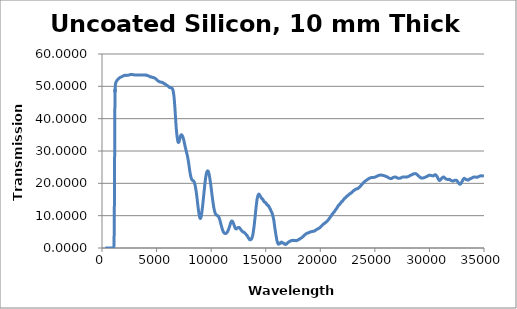
| Category | Transmission % |
|---|---|
| 300.0 | 0.002 |
| 301.0 | 0.002 |
| 302.0 | 0.002 |
| 303.0 | 0.002 |
| 304.0 | 0.002 |
| 305.0 | 0.002 |
| 306.0 | 0.002 |
| 307.0 | 0.002 |
| 308.0 | 0.002 |
| 309.0 | 0.002 |
| 310.0 | 0.002 |
| 311.0 | 0.002 |
| 312.0 | 0.002 |
| 313.0 | 0.002 |
| 314.0 | 0.002 |
| 315.0 | 0.002 |
| 316.0 | 0.002 |
| 317.0 | 0.002 |
| 318.0 | 0.002 |
| 319.0 | 0.002 |
| 320.0 | 0.002 |
| 321.0 | 0.002 |
| 322.0 | 0.002 |
| 323.0 | 0.002 |
| 324.0 | 0.002 |
| 325.0 | 0.002 |
| 326.0 | 0.002 |
| 327.0 | 0.002 |
| 328.0 | 0.002 |
| 329.0 | 0.002 |
| 330.0 | 0.002 |
| 331.0 | 0.002 |
| 332.0 | 0.002 |
| 333.0 | 0.002 |
| 334.0 | 0.002 |
| 335.0 | 0.002 |
| 336.0 | 0.002 |
| 337.0 | 0.002 |
| 338.0 | 0.002 |
| 339.0 | 0.002 |
| 340.0 | 0.002 |
| 341.0 | 0.002 |
| 342.0 | 0.002 |
| 343.0 | 0.002 |
| 344.0 | 0.002 |
| 345.0 | 0.002 |
| 346.0 | 0.002 |
| 347.0 | 0.002 |
| 348.0 | 0.002 |
| 349.0 | 0.002 |
| 350.0 | 0.001 |
| 351.0 | 0.001 |
| 352.0 | 0.001 |
| 353.0 | 0.001 |
| 354.0 | 0.001 |
| 355.0 | 0.001 |
| 356.0 | 0.001 |
| 357.0 | 0.001 |
| 358.0 | 0.001 |
| 359.0 | 0.001 |
| 360.0 | 0.001 |
| 361.0 | 0.001 |
| 362.0 | 0.001 |
| 363.0 | 0.002 |
| 364.0 | 0.002 |
| 365.0 | 0.002 |
| 366.0 | 0.002 |
| 367.0 | 0.002 |
| 368.0 | 0.002 |
| 369.0 | 0.002 |
| 370.0 | 0.002 |
| 371.0 | 0.002 |
| 372.0 | 0.002 |
| 373.0 | 0.001 |
| 374.0 | 0.002 |
| 375.0 | 0.002 |
| 376.0 | 0.002 |
| 377.0 | 0.002 |
| 378.0 | 0.001 |
| 379.0 | 0.001 |
| 380.0 | 0.001 |
| 381.0 | 0.001 |
| 382.0 | 0.001 |
| 383.0 | 0.001 |
| 384.0 | 0.001 |
| 385.0 | 0.001 |
| 386.0 | 0.001 |
| 387.0 | 0.001 |
| 388.0 | 0.001 |
| 389.0 | 0.001 |
| 390.0 | 0.001 |
| 391.0 | 0.001 |
| 392.0 | 0.002 |
| 393.0 | 0.002 |
| 394.0 | 0.001 |
| 395.0 | 0.001 |
| 396.0 | 0.002 |
| 397.0 | 0.002 |
| 398.0 | 0.002 |
| 399.0 | 0.001 |
| 400.0 | 0.001 |
| 401.0 | 0.001 |
| 402.0 | 0.001 |
| 403.0 | 0.001 |
| 404.0 | 0.001 |
| 405.0 | 0.001 |
| 406.0 | 0.001 |
| 407.0 | 0.001 |
| 408.0 | 0.001 |
| 409.0 | 0.001 |
| 410.0 | 0.001 |
| 411.0 | 0.001 |
| 412.0 | 0.001 |
| 413.0 | 0.001 |
| 414.0 | 0.001 |
| 415.0 | 0.001 |
| 416.0 | 0.001 |
| 417.0 | 0.001 |
| 418.0 | 0.001 |
| 419.0 | 0.001 |
| 420.0 | 0.001 |
| 421.0 | 0.001 |
| 422.0 | 0.001 |
| 423.0 | 0.001 |
| 424.0 | 0.001 |
| 425.0 | 0.001 |
| 426.0 | 0.001 |
| 427.0 | 0.001 |
| 428.0 | 0.001 |
| 429.0 | 0.001 |
| 430.0 | 0.001 |
| 431.0 | 0.001 |
| 432.0 | 0.001 |
| 433.0 | 0.001 |
| 434.0 | 0.001 |
| 435.0 | 0.001 |
| 436.0 | 0.001 |
| 437.0 | 0.001 |
| 438.0 | 0.001 |
| 439.0 | 0.001 |
| 440.0 | 0.001 |
| 441.0 | 0.001 |
| 442.0 | 0.001 |
| 443.0 | 0.001 |
| 444.0 | 0.001 |
| 445.0 | 0.001 |
| 446.0 | 0.001 |
| 447.0 | 0.001 |
| 448.0 | 0.001 |
| 449.0 | 0.001 |
| 450.0 | 0.001 |
| 451.0 | 0.001 |
| 452.0 | 0.001 |
| 453.0 | 0.001 |
| 454.0 | 0.001 |
| 455.0 | 0.001 |
| 456.0 | 0.001 |
| 457.0 | 0.001 |
| 458.0 | 0.001 |
| 459.0 | 0.001 |
| 460.0 | 0.001 |
| 461.0 | 0.001 |
| 462.0 | 0.001 |
| 463.0 | 0.001 |
| 464.0 | 0.001 |
| 465.0 | 0.001 |
| 466.0 | 0.001 |
| 467.0 | 0.001 |
| 468.0 | 0.001 |
| 469.0 | 0.001 |
| 470.0 | 0.001 |
| 471.0 | 0.001 |
| 472.0 | 0.001 |
| 473.0 | 0.001 |
| 474.0 | 0.001 |
| 475.0 | 0.001 |
| 476.0 | 0.001 |
| 477.0 | 0.001 |
| 478.0 | 0.001 |
| 479.0 | 0.001 |
| 480.0 | 0.001 |
| 481.0 | 0.001 |
| 482.0 | 0.001 |
| 483.0 | 0.001 |
| 484.0 | 0.001 |
| 485.0 | 0.001 |
| 486.0 | 0.001 |
| 487.0 | 0.001 |
| 488.0 | 0.001 |
| 489.0 | 0.001 |
| 490.0 | 0.001 |
| 491.0 | 0.001 |
| 492.0 | 0.001 |
| 493.0 | 0.001 |
| 494.0 | 0.001 |
| 495.0 | 0.001 |
| 496.0 | 0.001 |
| 497.0 | 0.001 |
| 498.0 | 0.001 |
| 499.0 | 0.001 |
| 500.0 | 0.001 |
| 501.0 | 0.001 |
| 502.0 | 0.001 |
| 503.0 | 0.001 |
| 504.0 | 0.001 |
| 505.0 | 0.001 |
| 506.0 | 0.001 |
| 507.0 | 0.001 |
| 508.0 | 0.001 |
| 509.0 | 0.001 |
| 510.0 | 0.001 |
| 511.0 | 0.001 |
| 512.0 | 0.001 |
| 513.0 | 0.001 |
| 514.0 | 0.001 |
| 515.0 | 0.001 |
| 516.0 | 0.001 |
| 517.0 | 0.001 |
| 518.0 | 0.001 |
| 519.0 | 0.001 |
| 520.0 | 0.001 |
| 521.0 | 0.001 |
| 522.0 | 0.001 |
| 523.0 | 0.001 |
| 524.0 | 0.001 |
| 525.0 | 0.001 |
| 526.0 | 0.001 |
| 527.0 | 0.001 |
| 528.0 | 0.001 |
| 529.0 | 0.001 |
| 530.0 | 0.001 |
| 531.0 | 0.001 |
| 532.0 | 0.001 |
| 533.0 | 0.001 |
| 534.0 | 0.001 |
| 535.0 | 0.001 |
| 536.0 | 0.001 |
| 537.0 | 0.001 |
| 538.0 | 0.001 |
| 539.0 | 0.001 |
| 540.0 | 0.001 |
| 541.0 | 0.001 |
| 542.0 | 0.001 |
| 543.0 | 0.001 |
| 544.0 | 0.001 |
| 545.0 | 0.001 |
| 546.0 | 0.002 |
| 547.0 | 0.001 |
| 548.0 | 0.001 |
| 549.0 | 0.001 |
| 550.0 | 0.001 |
| 551.0 | 0.002 |
| 552.0 | 0.002 |
| 553.0 | 0.002 |
| 554.0 | 0.002 |
| 555.0 | 0.002 |
| 556.0 | 0.002 |
| 557.0 | 0.002 |
| 558.0 | 0.002 |
| 559.0 | 0.001 |
| 560.0 | 0.001 |
| 561.0 | 0.001 |
| 562.0 | 0.001 |
| 563.0 | 0.001 |
| 564.0 | 0.001 |
| 565.0 | 0.001 |
| 566.0 | 0.001 |
| 567.0 | 0.001 |
| 568.0 | 0.001 |
| 569.0 | 0.001 |
| 570.0 | 0.001 |
| 571.0 | 0.001 |
| 572.0 | 0.001 |
| 573.0 | 0.001 |
| 574.0 | 0.001 |
| 575.0 | 0.001 |
| 576.0 | 0.001 |
| 577.0 | 0.001 |
| 578.0 | 0.001 |
| 579.0 | 0.001 |
| 580.0 | 0.001 |
| 581.0 | 0.001 |
| 582.0 | 0.001 |
| 583.0 | 0.001 |
| 584.0 | 0.001 |
| 585.0 | 0.001 |
| 586.0 | 0.001 |
| 587.0 | 0.001 |
| 588.0 | 0.001 |
| 589.0 | 0.001 |
| 590.0 | 0.001 |
| 591.0 | 0.001 |
| 592.0 | 0.001 |
| 593.0 | 0.001 |
| 594.0 | 0.001 |
| 595.0 | 0.001 |
| 596.0 | 0.001 |
| 597.0 | 0.001 |
| 598.0 | 0.001 |
| 599.0 | 0.001 |
| 600.0 | 0.001 |
| 601.0 | 0.002 |
| 602.0 | 0.002 |
| 603.0 | 0.002 |
| 604.0 | 0.002 |
| 605.0 | 0.002 |
| 606.0 | 0.002 |
| 607.0 | 0.002 |
| 608.0 | 0.002 |
| 609.0 | 0.002 |
| 610.0 | 0.002 |
| 611.0 | 0.002 |
| 612.0 | 0.002 |
| 613.0 | 0.002 |
| 614.0 | 0.002 |
| 615.0 | 0.002 |
| 616.0 | 0.002 |
| 617.0 | 0.002 |
| 618.0 | 0.002 |
| 619.0 | 0.002 |
| 620.0 | 0.002 |
| 621.0 | 0.002 |
| 622.0 | 0.002 |
| 623.0 | 0.002 |
| 624.0 | 0.002 |
| 625.0 | 0.002 |
| 626.0 | 0.002 |
| 627.0 | 0.002 |
| 628.0 | 0.002 |
| 629.0 | 0.002 |
| 630.0 | 0.002 |
| 631.0 | 0.002 |
| 632.0 | 0.002 |
| 633.0 | 0.002 |
| 634.0 | 0.002 |
| 635.0 | 0.002 |
| 636.0 | 0.002 |
| 637.0 | 0.002 |
| 638.0 | 0.002 |
| 639.0 | 0.002 |
| 640.0 | 0.002 |
| 641.0 | 0.002 |
| 642.0 | 0.002 |
| 643.0 | 0.002 |
| 644.0 | 0.002 |
| 645.0 | 0.002 |
| 646.0 | 0.002 |
| 647.0 | 0.002 |
| 648.0 | 0.002 |
| 649.0 | 0.002 |
| 650.0 | 0.002 |
| 651.0 | 0.002 |
| 652.0 | 0.002 |
| 653.0 | 0.002 |
| 654.0 | 0.002 |
| 655.0 | 0.002 |
| 656.0 | 0.002 |
| 657.0 | 0.002 |
| 658.0 | 0.002 |
| 659.0 | 0.002 |
| 660.0 | 0.002 |
| 661.0 | 0.002 |
| 662.0 | 0.002 |
| 663.0 | 0.002 |
| 664.0 | 0.002 |
| 665.0 | 0.002 |
| 666.0 | 0.002 |
| 667.0 | 0.002 |
| 668.0 | 0.002 |
| 669.0 | 0.002 |
| 670.0 | 0.002 |
| 671.0 | 0.002 |
| 672.0 | 0.002 |
| 673.0 | 0.002 |
| 674.0 | 0.002 |
| 675.0 | 0.002 |
| 676.0 | 0.002 |
| 677.0 | 0.002 |
| 678.0 | 0.002 |
| 679.0 | 0.002 |
| 680.0 | 0.002 |
| 681.0 | 0.002 |
| 682.0 | 0.002 |
| 683.0 | 0.002 |
| 684.0 | 0.002 |
| 685.0 | 0.002 |
| 686.0 | 0.002 |
| 687.0 | 0.002 |
| 688.0 | 0.002 |
| 689.0 | 0.002 |
| 690.0 | 0.002 |
| 691.0 | 0.002 |
| 692.0 | 0.002 |
| 693.0 | 0.002 |
| 694.0 | 0.002 |
| 695.0 | 0.002 |
| 696.0 | 0.002 |
| 697.0 | 0.002 |
| 698.0 | 0.002 |
| 699.0 | 0.002 |
| 700.0 | 0.002 |
| 701.0 | 0.002 |
| 702.0 | 0.002 |
| 703.0 | 0.002 |
| 704.0 | 0.002 |
| 705.0 | 0.002 |
| 706.0 | 0.002 |
| 707.0 | 0.002 |
| 708.0 | 0.002 |
| 709.0 | 0.002 |
| 710.0 | 0.002 |
| 711.0 | 0.002 |
| 712.0 | 0.002 |
| 713.0 | 0.002 |
| 714.0 | 0.002 |
| 715.0 | 0.002 |
| 716.0 | 0.002 |
| 717.0 | 0.002 |
| 718.0 | 0.002 |
| 719.0 | 0.002 |
| 720.0 | 0.002 |
| 721.0 | 0.002 |
| 722.0 | 0.002 |
| 723.0 | 0.002 |
| 724.0 | 0.002 |
| 725.0 | 0.002 |
| 726.0 | 0.002 |
| 727.0 | 0.002 |
| 728.0 | 0.002 |
| 729.0 | 0.002 |
| 730.0 | 0.002 |
| 731.0 | 0.002 |
| 732.0 | 0.002 |
| 733.0 | 0.001 |
| 734.0 | 0.001 |
| 735.0 | 0.001 |
| 736.0 | 0.001 |
| 737.0 | 0.001 |
| 738.0 | 0.001 |
| 739.0 | 0.001 |
| 740.0 | 0.001 |
| 741.0 | 0.001 |
| 742.0 | 0.001 |
| 743.0 | 0.001 |
| 744.0 | 0.001 |
| 745.0 | 0.001 |
| 746.0 | 0.001 |
| 747.0 | 0.001 |
| 748.0 | 0.001 |
| 749.0 | 0.001 |
| 750.0 | 0.001 |
| 751.0 | 0.001 |
| 752.0 | 0.001 |
| 753.0 | 0.001 |
| 754.0 | 0.001 |
| 755.0 | 0.001 |
| 756.0 | 0.001 |
| 757.0 | 0.001 |
| 758.0 | 0.001 |
| 759.0 | 0.001 |
| 760.0 | 0.001 |
| 761.0 | 0.001 |
| 762.0 | 0.001 |
| 763.0 | 0.001 |
| 764.0 | 0.001 |
| 765.0 | 0.001 |
| 766.0 | 0.001 |
| 767.0 | 0.001 |
| 768.0 | 0.001 |
| 769.0 | 0.001 |
| 770.0 | 0.001 |
| 771.0 | 0.001 |
| 772.0 | 0.001 |
| 773.0 | 0.001 |
| 774.0 | 0.001 |
| 775.0 | 0.001 |
| 776.0 | 0.001 |
| 777.0 | 0.001 |
| 778.0 | 0.001 |
| 779.0 | 0.001 |
| 780.0 | 0.001 |
| 781.0 | 0.001 |
| 782.0 | 0.001 |
| 783.0 | 0.001 |
| 784.0 | 0.001 |
| 785.0 | 0.001 |
| 786.0 | 0.001 |
| 787.0 | 0.001 |
| 788.0 | 0.001 |
| 789.0 | 0.001 |
| 790.0 | 0.001 |
| 791.0 | 0.001 |
| 792.0 | 0.001 |
| 793.0 | 0.001 |
| 794.0 | 0.001 |
| 795.0 | 0.001 |
| 796.0 | 0.001 |
| 797.0 | 0.001 |
| 798.0 | 0.001 |
| 799.0 | 0.001 |
| 800.0 | 0.001 |
| 801.0 | 0.001 |
| 802.0 | 0.001 |
| 803.0 | 0.001 |
| 804.0 | 0.001 |
| 805.0 | 0.001 |
| 806.0 | 0.001 |
| 807.0 | 0.001 |
| 808.0 | 0.001 |
| 809.0 | 0.001 |
| 810.0 | 0.001 |
| 811.0 | 0.001 |
| 812.0 | 0.001 |
| 813.0 | 0.001 |
| 814.0 | 0.001 |
| 815.0 | 0.001 |
| 816.0 | 0.001 |
| 817.0 | 0.001 |
| 818.0 | 0.001 |
| 819.0 | 0.001 |
| 820.0 | 0.001 |
| 821.0 | 0.001 |
| 822.0 | 0.001 |
| 823.0 | 0.001 |
| 824.0 | 0.001 |
| 825.0 | 0.001 |
| 826.0 | 0.001 |
| 827.0 | 0.001 |
| 828.0 | 0.001 |
| 829.0 | 0.001 |
| 830.0 | 0.001 |
| 831.0 | 0.001 |
| 832.0 | 0.001 |
| 833.0 | 0.001 |
| 834.0 | 0.001 |
| 835.0 | 0.001 |
| 836.0 | 0.001 |
| 837.0 | 0.001 |
| 838.0 | 0.001 |
| 839.0 | 0.001 |
| 840.0 | 0.001 |
| 841.0 | 0.002 |
| 842.0 | 0.002 |
| 843.0 | 0.002 |
| 844.0 | 0.003 |
| 845.0 | 0.004 |
| 846.0 | 0.004 |
| 847.0 | 0.005 |
| 848.0 | 0.006 |
| 849.0 | 0.007 |
| 850.0 | 0.007 |
| 851.0 | 0.008 |
| 852.0 | 0.008 |
| 853.0 | 0.008 |
| 854.0 | 0.009 |
| 855.0 | 0.01 |
| 856.0 | 0.01 |
| 857.0 | 0.01 |
| 858.0 | 0.01 |
| 859.0 | 0.011 |
| 860.0 | 0.011 |
| 861.0 | 0.011 |
| 862.0 | 0.011 |
| 863.0 | 0.011 |
| 864.0 | 0.012 |
| 865.0 | 0.013 |
| 866.0 | 0.013 |
| 867.0 | 0.014 |
| 868.0 | 0.015 |
| 869.0 | 0.015 |
| 870.0 | 0.016 |
| 871.0 | 0.017 |
| 872.0 | 0.018 |
| 873.0 | 0.018 |
| 874.0 | 0.019 |
| 875.0 | 0.019 |
| 876.0 | 0.019 |
| 877.0 | 0.02 |
| 878.0 | 0.021 |
| 879.0 | 0.022 |
| 880.0 | 0.022 |
| 881.0 | 0.023 |
| 882.0 | 0.023 |
| 883.0 | 0.023 |
| 884.0 | 0.023 |
| 885.0 | 0.023 |
| 886.0 | 0.022 |
| 887.0 | 0.022 |
| 888.0 | 0.022 |
| 889.0 | 0.021 |
| 890.0 | 0.021 |
| 891.0 | 0.021 |
| 892.0 | 0.021 |
| 893.0 | 0.022 |
| 894.0 | 0.022 |
| 895.0 | 0.021 |
| 896.0 | 0.02 |
| 897.0 | 0.02 |
| 898.0 | 0.02 |
| 899.0 | 0.02 |
| 900.0 | 0.02 |
| 901.0 | 0.02 |
| 902.0 | 0.02 |
| 903.0 | 0.021 |
| 904.0 | 0.021 |
| 905.0 | 0.021 |
| 906.0 | 0.021 |
| 907.0 | 0.021 |
| 908.0 | 0.021 |
| 909.0 | 0.021 |
| 910.0 | 0.021 |
| 911.0 | 0.021 |
| 912.0 | 0.02 |
| 913.0 | 0.02 |
| 914.0 | 0.02 |
| 915.0 | 0.02 |
| 916.0 | 0.019 |
| 917.0 | 0.02 |
| 918.0 | 0.019 |
| 919.0 | 0.019 |
| 920.0 | 0.019 |
| 921.0 | 0.02 |
| 922.0 | 0.02 |
| 923.0 | 0.019 |
| 924.0 | 0.019 |
| 925.0 | 0.018 |
| 926.0 | 0.018 |
| 927.0 | 0.019 |
| 928.0 | 0.019 |
| 929.0 | 0.019 |
| 930.0 | 0.019 |
| 931.0 | 0.019 |
| 932.0 | 0.019 |
| 933.0 | 0.019 |
| 934.0 | 0.02 |
| 935.0 | 0.021 |
| 936.0 | 0.021 |
| 937.0 | 0.022 |
| 938.0 | 0.022 |
| 939.0 | 0.023 |
| 940.0 | 0.024 |
| 941.0 | 0.025 |
| 942.0 | 0.025 |
| 943.0 | 0.025 |
| 944.0 | 0.024 |
| 945.0 | 0.024 |
| 946.0 | 0.024 |
| 947.0 | 0.023 |
| 948.0 | 0.023 |
| 949.0 | 0.022 |
| 950.0 | 0.022 |
| 951.0 | 0.022 |
| 952.0 | 0.022 |
| 953.0 | 0.022 |
| 954.0 | 0.022 |
| 955.0 | 0.022 |
| 956.0 | 0.022 |
| 957.0 | 0.022 |
| 958.0 | 0.022 |
| 959.0 | 0.022 |
| 960.0 | 0.022 |
| 961.0 | 0.023 |
| 962.0 | 0.022 |
| 963.0 | 0.022 |
| 964.0 | 0.022 |
| 965.0 | 0.022 |
| 966.0 | 0.022 |
| 967.0 | 0.022 |
| 968.0 | 0.022 |
| 969.0 | 0.022 |
| 970.0 | 0.022 |
| 971.0 | 0.022 |
| 972.0 | 0.022 |
| 973.0 | 0.022 |
| 974.0 | 0.022 |
| 975.0 | 0.021 |
| 976.0 | 0.021 |
| 977.0 | 0.021 |
| 978.0 | 0.02 |
| 979.0 | 0.021 |
| 980.0 | 0.02 |
| 981.0 | 0.02 |
| 982.0 | 0.02 |
| 983.0 | 0.019 |
| 984.0 | 0.02 |
| 985.0 | 0.02 |
| 986.0 | 0.021 |
| 987.0 | 0.021 |
| 988.0 | 0.021 |
| 989.0 | 0.021 |
| 990.0 | 0.021 |
| 991.0 | 0.021 |
| 992.0 | 0.022 |
| 993.0 | 0.021 |
| 994.0 | 0.021 |
| 995.0 | 0.021 |
| 996.0 | 0.021 |
| 997.0 | 0.021 |
| 998.0 | 0.021 |
| 999.0 | 0.021 |
| 1000.0 | 0.021 |
| 1001.0 | 0.021 |
| 1002.0 | 0.02 |
| 1003.0 | 0.021 |
| 1004.0 | 0.021 |
| 1005.0 | 0.021 |
| 1006.0 | 0.021 |
| 1007.0 | 0.022 |
| 1008.0 | 0.022 |
| 1009.0 | 0.023 |
| 1010.0 | 0.023 |
| 1011.0 | 0.023 |
| 1012.0 | 0.024 |
| 1013.0 | 0.024 |
| 1014.0 | 0.023 |
| 1015.0 | 0.024 |
| 1016.0 | 0.025 |
| 1017.0 | 0.024 |
| 1018.0 | 0.024 |
| 1019.0 | 0.024 |
| 1020.0 | 0.024 |
| 1021.0 | 0.023 |
| 1022.0 | 0.023 |
| 1023.0 | 0.023 |
| 1024.0 | 0.022 |
| 1025.0 | 0.022 |
| 1026.0 | 0.022 |
| 1027.0 | 0.022 |
| 1028.0 | 0.022 |
| 1029.0 | 0.022 |
| 1030.0 | 0.022 |
| 1031.0 | 0.023 |
| 1032.0 | 0.022 |
| 1033.0 | 0.022 |
| 1034.0 | 0.022 |
| 1035.0 | 0.022 |
| 1036.0 | 0.023 |
| 1037.0 | 0.023 |
| 1038.0 | 0.023 |
| 1039.0 | 0.024 |
| 1040.0 | 0.024 |
| 1041.0 | 0.024 |
| 1042.0 | 0.024 |
| 1043.0 | 0.025 |
| 1044.0 | 0.025 |
| 1045.0 | 0.026 |
| 1046.0 | 0.026 |
| 1047.0 | 0.026 |
| 1048.0 | 0.026 |
| 1049.0 | 0.026 |
| 1050.0 | 0.026 |
| 1051.0 | 0.026 |
| 1052.0 | 0.026 |
| 1053.0 | 0.026 |
| 1054.0 | 0.027 |
| 1055.0 | 0.028 |
| 1056.0 | 0.027 |
| 1057.0 | 0.026 |
| 1058.0 | 0.027 |
| 1059.0 | 0.029 |
| 1060.0 | 0.031 |
| 1061.0 | 0.033 |
| 1062.0 | 0.036 |
| 1063.0 | 0.038 |
| 1064.0 | 0.039 |
| 1065.0 | 0.042 |
| 1066.0 | 0.046 |
| 1067.0 | 0.05 |
| 1068.0 | 0.056 |
| 1069.0 | 0.063 |
| 1070.0 | 0.07 |
| 1071.0 | 0.077 |
| 1072.0 | 0.086 |
| 1073.0 | 0.096 |
| 1074.0 | 0.109 |
| 1075.0 | 0.122 |
| 1076.0 | 0.138 |
| 1077.0 | 0.155 |
| 1078.0 | 0.174 |
| 1079.0 | 0.195 |
| 1080.0 | 0.219 |
| 1081.0 | 0.246 |
| 1082.0 | 0.276 |
| 1083.0 | 0.308 |
| 1084.0 | 0.344 |
| 1085.0 | 0.383 |
| 1086.0 | 0.426 |
| 1087.0 | 0.471 |
| 1088.0 | 0.523 |
| 1089.0 | 0.579 |
| 1090.0 | 0.64 |
| 1091.0 | 0.706 |
| 1092.0 | 0.778 |
| 1093.0 | 0.855 |
| 1094.0 | 0.939 |
| 1095.0 | 1.03 |
| 1096.0 | 1.128 |
| 1097.0 | 1.234 |
| 1098.0 | 1.348 |
| 1099.0 | 1.469 |
| 1100.0 | 1.599 |
| 1101.0 | 1.736 |
| 1102.0 | 1.882 |
| 1103.0 | 2.037 |
| 1104.0 | 2.203 |
| 1105.0 | 2.38 |
| 1106.0 | 2.567 |
| 1107.0 | 2.762 |
| 1108.0 | 2.968 |
| 1109.0 | 3.185 |
| 1110.0 | 3.413 |
| 1111.0 | 3.653 |
| 1112.0 | 3.905 |
| 1113.0 | 4.169 |
| 1114.0 | 4.444 |
| 1115.0 | 4.731 |
| 1116.0 | 5.032 |
| 1117.0 | 5.347 |
| 1118.0 | 5.674 |
| 1119.0 | 6.015 |
| 1120.0 | 6.368 |
| 1121.0 | 6.733 |
| 1122.0 | 7.112 |
| 1123.0 | 7.504 |
| 1124.0 | 7.908 |
| 1125.0 | 8.326 |
| 1126.0 | 8.757 |
| 1127.0 | 9.201 |
| 1128.0 | 9.661 |
| 1129.0 | 10.135 |
| 1130.0 | 10.622 |
| 1131.0 | 11.123 |
| 1132.0 | 11.638 |
| 1133.0 | 12.165 |
| 1134.0 | 12.705 |
| 1135.0 | 13.258 |
| 1136.0 | 13.824 |
| 1137.0 | 14.403 |
| 1138.0 | 14.993 |
| 1139.0 | 15.598 |
| 1140.0 | 16.214 |
| 1141.0 | 16.842 |
| 1142.0 | 17.481 |
| 1143.0 | 18.132 |
| 1144.0 | 18.792 |
| 1145.0 | 19.463 |
| 1146.0 | 20.141 |
| 1147.0 | 20.827 |
| 1148.0 | 21.52 |
| 1149.0 | 22.22 |
| 1150.0 | 22.926 |
| 1151.0 | 23.636 |
| 1152.0 | 24.352 |
| 1153.0 | 25.075 |
| 1154.0 | 25.803 |
| 1155.0 | 26.538 |
| 1156.0 | 27.28 |
| 1157.0 | 28.029 |
| 1158.0 | 28.784 |
| 1159.0 | 29.547 |
| 1160.0 | 30.314 |
| 1161.0 | 31.083 |
| 1162.0 | 31.847 |
| 1163.0 | 32.604 |
| 1164.0 | 33.351 |
| 1165.0 | 34.087 |
| 1166.0 | 34.812 |
| 1167.0 | 35.523 |
| 1168.0 | 36.22 |
| 1169.0 | 36.901 |
| 1170.0 | 37.565 |
| 1171.0 | 38.214 |
| 1172.0 | 38.846 |
| 1173.0 | 39.463 |
| 1174.0 | 40.062 |
| 1175.0 | 40.645 |
| 1176.0 | 41.211 |
| 1177.0 | 41.758 |
| 1178.0 | 42.287 |
| 1179.0 | 42.798 |
| 1180.0 | 43.29 |
| 1181.0 | 43.763 |
| 1182.0 | 44.218 |
| 1183.0 | 44.653 |
| 1184.0 | 45.07 |
| 1185.0 | 45.469 |
| 1186.0 | 45.849 |
| 1187.0 | 46.211 |
| 1188.0 | 46.556 |
| 1189.0 | 46.884 |
| 1190.0 | 47.197 |
| 1191.0 | 47.492 |
| 1192.0 | 47.771 |
| 1193.0 | 48.034 |
| 1194.0 | 48.278 |
| 1195.0 | 48.505 |
| 1196.0 | 48.711 |
| 1197.0 | 48.898 |
| 1198.0 | 49.064 |
| 1199.0 | 49.207 |
| 1200.0 | 48.199 |
| 1201.0 | 48.371 |
| 1202.0 | 48.532 |
| 1203.0 | 48.683 |
| 1204.0 | 48.824 |
| 1205.0 | 48.956 |
| 1206.0 | 49.079 |
| 1207.0 | 49.193 |
| 1208.0 | 49.299 |
| 1209.0 | 49.397 |
| 1210.0 | 49.488 |
| 1211.0 | 49.572 |
| 1212.0 | 49.649 |
| 1213.0 | 49.72 |
| 1214.0 | 49.786 |
| 1215.0 | 49.845 |
| 1216.0 | 49.9 |
| 1217.0 | 49.95 |
| 1218.0 | 49.996 |
| 1219.0 | 50.039 |
| 1220.0 | 50.078 |
| 1221.0 | 50.138 |
| 1222.0 | 50.194 |
| 1223.0 | 50.246 |
| 1224.0 | 50.295 |
| 1225.0 | 50.341 |
| 1226.0 | 50.384 |
| 1227.0 | 50.424 |
| 1228.0 | 50.462 |
| 1229.0 | 50.498 |
| 1230.0 | 50.531 |
| 1231.0 | 50.563 |
| 1232.0 | 50.593 |
| 1233.0 | 50.621 |
| 1234.0 | 50.648 |
| 1235.0 | 50.673 |
| 1236.0 | 50.698 |
| 1237.0 | 50.721 |
| 1238.0 | 50.743 |
| 1239.0 | 50.764 |
| 1240.0 | 50.785 |
| 1241.0 | 50.805 |
| 1242.0 | 50.824 |
| 1243.0 | 50.843 |
| 1244.0 | 50.861 |
| 1245.0 | 50.878 |
| 1246.0 | 50.895 |
| 1247.0 | 50.911 |
| 1248.0 | 50.927 |
| 1249.0 | 50.943 |
| 1250.0 | 50.958 |
| 1251.0 | 50.973 |
| 1252.0 | 50.987 |
| 1253.0 | 51.001 |
| 1254.0 | 51.015 |
| 1255.0 | 51.028 |
| 1256.0 | 51.041 |
| 1257.0 | 51.053 |
| 1258.0 | 51.066 |
| 1259.0 | 51.078 |
| 1260.0 | 51.089 |
| 1261.0 | 51.101 |
| 1262.0 | 51.112 |
| 1263.0 | 51.123 |
| 1264.0 | 51.134 |
| 1265.0 | 51.144 |
| 1266.0 | 51.155 |
| 1267.0 | 51.165 |
| 1268.0 | 51.175 |
| 1269.0 | 51.184 |
| 1270.0 | 51.194 |
| 1271.0 | 51.203 |
| 1272.0 | 51.213 |
| 1273.0 | 51.222 |
| 1274.0 | 51.231 |
| 1275.0 | 51.239 |
| 1276.0 | 51.248 |
| 1277.0 | 51.257 |
| 1278.0 | 51.265 |
| 1279.0 | 51.273 |
| 1280.0 | 51.282 |
| 1281.0 | 51.29 |
| 1282.0 | 51.298 |
| 1283.0 | 51.305 |
| 1284.0 | 51.313 |
| 1285.0 | 51.321 |
| 1286.0 | 51.328 |
| 1287.0 | 51.336 |
| 1288.0 | 51.343 |
| 1289.0 | 51.351 |
| 1290.0 | 51.358 |
| 1291.0 | 51.365 |
| 1292.0 | 51.372 |
| 1293.0 | 51.379 |
| 1294.0 | 51.386 |
| 1295.0 | 51.393 |
| 1296.0 | 51.4 |
| 1297.0 | 51.407 |
| 1298.0 | 51.414 |
| 1299.0 | 51.42 |
| 1300.0 | 51.427 |
| 1301.0 | 51.433 |
| 1302.0 | 51.44 |
| 1303.0 | 51.446 |
| 1304.0 | 51.453 |
| 1305.0 | 51.459 |
| 1306.0 | 51.466 |
| 1307.0 | 51.472 |
| 1308.0 | 51.478 |
| 1309.0 | 51.484 |
| 1310.0 | 51.49 |
| 1311.0 | 51.496 |
| 1312.0 | 51.502 |
| 1313.0 | 51.508 |
| 1314.0 | 51.514 |
| 1315.0 | 51.52 |
| 1316.0 | 51.526 |
| 1317.0 | 51.532 |
| 1318.0 | 51.538 |
| 1319.0 | 51.543 |
| 1320.0 | 51.549 |
| 1321.0 | 51.555 |
| 1322.0 | 51.56 |
| 1323.0 | 51.566 |
| 1324.0 | 51.571 |
| 1325.0 | 51.577 |
| 1326.0 | 51.582 |
| 1327.0 | 51.588 |
| 1328.0 | 51.593 |
| 1329.0 | 51.598 |
| 1330.0 | 51.604 |
| 1331.0 | 51.609 |
| 1332.0 | 51.614 |
| 1333.0 | 51.619 |
| 1334.0 | 51.624 |
| 1335.0 | 51.63 |
| 1336.0 | 51.635 |
| 1337.0 | 51.64 |
| 1338.0 | 51.645 |
| 1339.0 | 51.65 |
| 1340.0 | 51.655 |
| 1341.0 | 51.66 |
| 1342.0 | 51.665 |
| 1343.0 | 51.669 |
| 1344.0 | 51.674 |
| 1345.0 | 51.679 |
| 1346.0 | 51.684 |
| 1347.0 | 51.689 |
| 1348.0 | 51.694 |
| 1349.0 | 51.698 |
| 1350.0 | 51.703 |
| 1351.0 | 51.708 |
| 1352.0 | 51.713 |
| 1353.0 | 51.717 |
| 1354.0 | 51.722 |
| 1355.0 | 51.727 |
| 1356.0 | 51.731 |
| 1357.0 | 51.736 |
| 1358.0 | 51.741 |
| 1359.0 | 51.745 |
| 1360.0 | 51.75 |
| 1361.0 | 51.755 |
| 1362.0 | 51.759 |
| 1363.0 | 51.764 |
| 1364.0 | 51.769 |
| 1365.0 | 51.774 |
| 1366.0 | 51.778 |
| 1367.0 | 51.783 |
| 1368.0 | 51.788 |
| 1369.0 | 51.792 |
| 1370.0 | 51.797 |
| 1371.0 | 51.802 |
| 1372.0 | 51.807 |
| 1373.0 | 51.811 |
| 1374.0 | 51.816 |
| 1375.0 | 51.821 |
| 1376.0 | 51.826 |
| 1377.0 | 51.83 |
| 1378.0 | 51.835 |
| 1379.0 | 51.84 |
| 1380.0 | 51.845 |
| 1381.0 | 51.849 |
| 1382.0 | 51.854 |
| 1383.0 | 51.859 |
| 1384.0 | 51.864 |
| 1385.0 | 51.868 |
| 1386.0 | 51.873 |
| 1387.0 | 51.878 |
| 1388.0 | 51.883 |
| 1389.0 | 51.887 |
| 1390.0 | 51.892 |
| 1391.0 | 51.897 |
| 1392.0 | 51.901 |
| 1393.0 | 51.906 |
| 1394.0 | 51.911 |
| 1395.0 | 51.916 |
| 1396.0 | 51.92 |
| 1397.0 | 51.925 |
| 1398.0 | 51.929 |
| 1399.0 | 51.934 |
| 1400.0 | 51.939 |
| 1401.0 | 51.943 |
| 1402.0 | 51.948 |
| 1403.0 | 51.953 |
| 1404.0 | 51.957 |
| 1405.0 | 51.962 |
| 1406.0 | 51.966 |
| 1407.0 | 51.971 |
| 1408.0 | 51.975 |
| 1409.0 | 51.98 |
| 1410.0 | 51.984 |
| 1411.0 | 51.988 |
| 1412.0 | 51.993 |
| 1413.0 | 51.997 |
| 1414.0 | 52.001 |
| 1415.0 | 52.006 |
| 1416.0 | 52.01 |
| 1417.0 | 52.014 |
| 1418.0 | 52.018 |
| 1419.0 | 52.022 |
| 1420.0 | 52.027 |
| 1421.0 | 52.031 |
| 1422.0 | 52.035 |
| 1423.0 | 52.039 |
| 1424.0 | 52.043 |
| 1425.0 | 52.047 |
| 1426.0 | 52.051 |
| 1427.0 | 52.055 |
| 1428.0 | 52.059 |
| 1429.0 | 52.063 |
| 1430.0 | 52.067 |
| 1431.0 | 52.071 |
| 1432.0 | 52.075 |
| 1433.0 | 52.079 |
| 1434.0 | 52.083 |
| 1435.0 | 52.087 |
| 1436.0 | 52.091 |
| 1437.0 | 52.095 |
| 1438.0 | 52.098 |
| 1439.0 | 52.102 |
| 1440.0 | 52.106 |
| 1441.0 | 52.11 |
| 1442.0 | 52.114 |
| 1443.0 | 52.117 |
| 1444.0 | 52.121 |
| 1445.0 | 52.125 |
| 1446.0 | 52.129 |
| 1447.0 | 52.132 |
| 1448.0 | 52.136 |
| 1449.0 | 52.14 |
| 1450.0 | 52.143 |
| 1451.0 | 52.147 |
| 1452.0 | 52.151 |
| 1453.0 | 52.154 |
| 1454.0 | 52.158 |
| 1455.0 | 52.162 |
| 1456.0 | 52.165 |
| 1457.0 | 52.169 |
| 1458.0 | 52.173 |
| 1459.0 | 52.176 |
| 1460.0 | 52.18 |
| 1461.0 | 52.183 |
| 1462.0 | 52.187 |
| 1463.0 | 52.19 |
| 1464.0 | 52.194 |
| 1465.0 | 52.197 |
| 1466.0 | 52.201 |
| 1467.0 | 52.204 |
| 1468.0 | 52.208 |
| 1469.0 | 52.211 |
| 1470.0 | 52.214 |
| 1471.0 | 52.218 |
| 1472.0 | 52.221 |
| 1473.0 | 52.224 |
| 1474.0 | 52.228 |
| 1475.0 | 52.231 |
| 1476.0 | 52.234 |
| 1477.0 | 52.237 |
| 1478.0 | 52.241 |
| 1479.0 | 52.244 |
| 1480.0 | 52.247 |
| 1481.0 | 52.25 |
| 1482.0 | 52.253 |
| 1483.0 | 52.256 |
| 1484.0 | 52.259 |
| 1485.0 | 52.262 |
| 1486.0 | 52.265 |
| 1487.0 | 52.268 |
| 1488.0 | 52.271 |
| 1489.0 | 52.274 |
| 1490.0 | 52.277 |
| 1491.0 | 52.28 |
| 1492.0 | 52.283 |
| 1493.0 | 52.286 |
| 1494.0 | 52.289 |
| 1495.0 | 52.292 |
| 1496.0 | 52.295 |
| 1497.0 | 52.298 |
| 1498.0 | 52.301 |
| 1499.0 | 52.304 |
| 1500.0 | 52.307 |
| 1501.0 | 52.31 |
| 1502.0 | 52.313 |
| 1503.0 | 52.316 |
| 1504.0 | 52.319 |
| 1505.0 | 52.322 |
| 1506.0 | 52.325 |
| 1507.0 | 52.328 |
| 1508.0 | 52.331 |
| 1509.0 | 52.334 |
| 1510.0 | 52.337 |
| 1511.0 | 52.34 |
| 1512.0 | 52.343 |
| 1513.0 | 52.346 |
| 1514.0 | 52.349 |
| 1515.0 | 52.353 |
| 1516.0 | 52.356 |
| 1517.0 | 52.359 |
| 1518.0 | 52.362 |
| 1519.0 | 52.366 |
| 1520.0 | 52.369 |
| 1521.0 | 52.372 |
| 1522.0 | 52.376 |
| 1523.0 | 52.379 |
| 1524.0 | 52.383 |
| 1525.0 | 52.386 |
| 1526.0 | 52.39 |
| 1527.0 | 52.393 |
| 1528.0 | 52.397 |
| 1529.0 | 52.4 |
| 1530.0 | 52.404 |
| 1531.0 | 52.407 |
| 1532.0 | 52.411 |
| 1533.0 | 52.414 |
| 1534.0 | 52.418 |
| 1535.0 | 52.421 |
| 1536.0 | 52.425 |
| 1537.0 | 52.428 |
| 1538.0 | 52.432 |
| 1539.0 | 52.436 |
| 1540.0 | 52.439 |
| 1541.0 | 52.443 |
| 1542.0 | 52.446 |
| 1543.0 | 52.45 |
| 1544.0 | 52.453 |
| 1545.0 | 52.457 |
| 1546.0 | 52.46 |
| 1547.0 | 52.463 |
| 1548.0 | 52.467 |
| 1549.0 | 52.47 |
| 1550.0 | 52.474 |
| 1551.0 | 52.477 |
| 1552.0 | 52.48 |
| 1553.0 | 52.483 |
| 1554.0 | 52.487 |
| 1555.0 | 52.49 |
| 1556.0 | 52.493 |
| 1557.0 | 52.496 |
| 1558.0 | 52.499 |
| 1559.0 | 52.502 |
| 1560.0 | 52.505 |
| 1561.0 | 52.508 |
| 1562.0 | 52.511 |
| 1563.0 | 52.514 |
| 1564.0 | 52.517 |
| 1565.0 | 52.52 |
| 1566.0 | 52.523 |
| 1567.0 | 52.526 |
| 1568.0 | 52.528 |
| 1569.0 | 52.531 |
| 1570.0 | 52.534 |
| 1571.0 | 52.537 |
| 1572.0 | 52.539 |
| 1573.0 | 52.542 |
| 1574.0 | 52.545 |
| 1575.0 | 52.547 |
| 1576.0 | 52.55 |
| 1577.0 | 52.552 |
| 1578.0 | 52.555 |
| 1579.0 | 52.558 |
| 1580.0 | 52.56 |
| 1581.0 | 52.563 |
| 1582.0 | 52.565 |
| 1583.0 | 52.568 |
| 1584.0 | 52.57 |
| 1585.0 | 52.572 |
| 1586.0 | 52.575 |
| 1587.0 | 52.577 |
| 1588.0 | 52.58 |
| 1589.0 | 52.582 |
| 1590.0 | 52.584 |
| 1591.0 | 52.587 |
| 1592.0 | 52.589 |
| 1593.0 | 52.591 |
| 1594.0 | 52.594 |
| 1595.0 | 52.596 |
| 1596.0 | 52.598 |
| 1597.0 | 52.601 |
| 1598.0 | 52.603 |
| 1599.0 | 52.605 |
| 1600.0 | 52.607 |
| 1601.0 | 52.61 |
| 1602.0 | 52.612 |
| 1603.0 | 52.614 |
| 1604.0 | 52.616 |
| 1605.0 | 52.619 |
| 1606.0 | 52.621 |
| 1607.0 | 52.623 |
| 1608.0 | 52.625 |
| 1609.0 | 52.627 |
| 1610.0 | 52.63 |
| 1611.0 | 52.632 |
| 1612.0 | 52.634 |
| 1613.0 | 52.636 |
| 1614.0 | 52.638 |
| 1615.0 | 52.64 |
| 1616.0 | 52.642 |
| 1617.0 | 52.644 |
| 1618.0 | 52.646 |
| 1619.0 | 52.649 |
| 1620.0 | 52.651 |
| 1621.0 | 52.653 |
| 1622.0 | 52.655 |
| 1623.0 | 52.657 |
| 1624.0 | 52.659 |
| 1625.0 | 52.661 |
| 1626.0 | 52.663 |
| 1627.0 | 52.665 |
| 1628.0 | 52.667 |
| 1629.0 | 52.669 |
| 1630.0 | 52.671 |
| 1631.0 | 52.673 |
| 1632.0 | 52.675 |
| 1633.0 | 52.677 |
| 1634.0 | 52.679 |
| 1635.0 | 52.681 |
| 1636.0 | 52.683 |
| 1637.0 | 52.685 |
| 1638.0 | 52.687 |
| 1639.0 | 52.689 |
| 1640.0 | 52.691 |
| 1641.0 | 52.693 |
| 1642.0 | 52.695 |
| 1643.0 | 52.697 |
| 1644.0 | 52.7 |
| 1645.0 | 52.702 |
| 1646.0 | 52.704 |
| 1647.0 | 52.706 |
| 1648.0 | 52.708 |
| 1649.0 | 52.71 |
| 1650.0 | 52.712 |
| 1651.0 | 52.714 |
| 1652.0 | 52.716 |
| 1653.0 | 52.718 |
| 1654.0 | 52.72 |
| 1655.0 | 52.722 |
| 1656.0 | 52.724 |
| 1657.0 | 52.726 |
| 1658.0 | 52.729 |
| 1659.0 | 52.731 |
| 1660.0 | 52.733 |
| 1661.0 | 52.735 |
| 1662.0 | 52.737 |
| 1663.0 | 52.739 |
| 1664.0 | 52.741 |
| 1665.0 | 52.743 |
| 1666.0 | 52.745 |
| 1667.0 | 52.747 |
| 1668.0 | 52.75 |
| 1669.0 | 52.752 |
| 1670.0 | 52.754 |
| 1671.0 | 52.756 |
| 1672.0 | 52.758 |
| 1673.0 | 52.76 |
| 1674.0 | 52.762 |
| 1675.0 | 52.764 |
| 1676.0 | 52.766 |
| 1677.0 | 52.768 |
| 1678.0 | 52.77 |
| 1679.0 | 52.772 |
| 1680.0 | 52.774 |
| 1681.0 | 52.776 |
| 1682.0 | 52.778 |
| 1683.0 | 52.78 |
| 1684.0 | 52.782 |
| 1685.0 | 52.784 |
| 1686.0 | 52.786 |
| 1687.0 | 52.788 |
| 1688.0 | 52.79 |
| 1689.0 | 52.792 |
| 1690.0 | 52.794 |
| 1691.0 | 52.796 |
| 1692.0 | 52.798 |
| 1693.0 | 52.8 |
| 1694.0 | 52.802 |
| 1695.0 | 52.804 |
| 1696.0 | 52.806 |
| 1697.0 | 52.808 |
| 1698.0 | 52.81 |
| 1699.0 | 52.812 |
| 1700.0 | 52.813 |
| 1701.0 | 52.815 |
| 1702.0 | 52.817 |
| 1703.0 | 52.819 |
| 1704.0 | 52.821 |
| 1705.0 | 52.823 |
| 1706.0 | 52.825 |
| 1707.0 | 52.827 |
| 1708.0 | 52.829 |
| 1709.0 | 52.831 |
| 1710.0 | 52.833 |
| 1711.0 | 52.835 |
| 1712.0 | 52.836 |
| 1713.0 | 52.838 |
| 1714.0 | 52.84 |
| 1715.0 | 52.842 |
| 1716.0 | 52.844 |
| 1717.0 | 52.846 |
| 1718.0 | 52.848 |
| 1719.0 | 52.85 |
| 1720.0 | 52.851 |
| 1721.0 | 52.853 |
| 1722.0 | 52.855 |
| 1723.0 | 52.857 |
| 1724.0 | 52.859 |
| 1725.0 | 52.861 |
| 1726.0 | 52.862 |
| 1727.0 | 52.864 |
| 1728.0 | 52.866 |
| 1729.0 | 52.868 |
| 1730.0 | 52.87 |
| 1731.0 | 52.872 |
| 1732.0 | 52.873 |
| 1733.0 | 52.875 |
| 1734.0 | 52.877 |
| 1735.0 | 52.879 |
| 1736.0 | 52.88 |
| 1737.0 | 52.882 |
| 1738.0 | 52.884 |
| 1739.0 | 52.886 |
| 1740.0 | 52.888 |
| 1741.0 | 52.889 |
| 1742.0 | 52.891 |
| 1743.0 | 52.893 |
| 1744.0 | 52.895 |
| 1745.0 | 52.896 |
| 1746.0 | 52.898 |
| 1747.0 | 52.9 |
| 1748.0 | 52.901 |
| 1749.0 | 52.903 |
| 1750.0 | 52.905 |
| 1751.0 | 52.907 |
| 1752.0 | 52.908 |
| 1753.0 | 52.91 |
| 1754.0 | 52.912 |
| 1755.0 | 52.913 |
| 1756.0 | 52.915 |
| 1757.0 | 52.917 |
| 1758.0 | 52.918 |
| 1759.0 | 52.92 |
| 1760.0 | 52.922 |
| 1761.0 | 52.923 |
| 1762.0 | 52.925 |
| 1763.0 | 52.927 |
| 1764.0 | 52.928 |
| 1765.0 | 52.93 |
| 1766.0 | 52.932 |
| 1767.0 | 52.933 |
| 1768.0 | 52.935 |
| 1769.0 | 52.937 |
| 1770.0 | 52.938 |
| 1771.0 | 52.94 |
| 1772.0 | 52.941 |
| 1773.0 | 52.943 |
| 1774.0 | 52.945 |
| 1775.0 | 52.946 |
| 1776.0 | 52.948 |
| 1777.0 | 52.949 |
| 1778.0 | 52.951 |
| 1779.0 | 52.953 |
| 1780.0 | 52.954 |
| 1781.0 | 52.956 |
| 1782.0 | 52.957 |
| 1783.0 | 52.959 |
| 1784.0 | 52.96 |
| 1785.0 | 52.962 |
| 1786.0 | 52.964 |
| 1787.0 | 52.965 |
| 1788.0 | 52.967 |
| 1789.0 | 52.968 |
| 1790.0 | 52.97 |
| 1791.0 | 52.971 |
| 1792.0 | 52.973 |
| 1793.0 | 52.974 |
| 1794.0 | 52.976 |
| 1795.0 | 52.977 |
| 1796.0 | 52.979 |
| 1797.0 | 52.98 |
| 1798.0 | 52.982 |
| 1799.0 | 52.983 |
| 1800.0 | 52.985 |
| 1801.0 | 52.986 |
| 1802.0 | 52.988 |
| 1803.0 | 52.989 |
| 1804.0 | 52.991 |
| 1805.0 | 52.992 |
| 1806.0 | 52.994 |
| 1807.0 | 52.995 |
| 1808.0 | 52.997 |
| 1809.0 | 52.998 |
| 1810.0 | 52.999 |
| 1811.0 | 53.001 |
| 1812.0 | 53.002 |
| 1813.0 | 53.004 |
| 1814.0 | 53.005 |
| 1815.0 | 53.007 |
| 1816.0 | 53.008 |
| 1817.0 | 53.009 |
| 1818.0 | 53.011 |
| 1819.0 | 53.012 |
| 1820.0 | 53.014 |
| 1821.0 | 53.015 |
| 1822.0 | 53.017 |
| 1823.0 | 53.018 |
| 1824.0 | 53.019 |
| 1825.0 | 53.021 |
| 1826.0 | 53.022 |
| 1827.0 | 53.024 |
| 1828.0 | 53.025 |
| 1829.0 | 53.026 |
| 1830.0 | 53.028 |
| 1831.0 | 53.029 |
| 1832.0 | 53.031 |
| 1833.0 | 53.032 |
| 1834.0 | 53.033 |
| 1835.0 | 53.035 |
| 1836.0 | 53.036 |
| 1837.0 | 53.038 |
| 1838.0 | 53.039 |
| 1839.0 | 53.04 |
| 1840.0 | 53.042 |
| 1841.0 | 53.043 |
| 1842.0 | 53.045 |
| 1843.0 | 53.046 |
| 1844.0 | 53.047 |
| 1845.0 | 53.049 |
| 1846.0 | 53.05 |
| 1847.0 | 53.052 |
| 1848.0 | 53.053 |
| 1849.0 | 53.054 |
| 1850.0 | 53.056 |
| 1851.0 | 53.057 |
| 1852.0 | 53.058 |
| 1853.0 | 53.06 |
| 1854.0 | 53.061 |
| 1855.0 | 53.063 |
| 1856.0 | 53.064 |
| 1857.0 | 53.065 |
| 1858.0 | 53.067 |
| 1859.0 | 53.068 |
| 1860.0 | 53.07 |
| 1861.0 | 53.071 |
| 1862.0 | 53.072 |
| 1863.0 | 53.074 |
| 1864.0 | 53.075 |
| 1865.0 | 53.077 |
| 1866.0 | 53.078 |
| 1867.0 | 53.08 |
| 1868.0 | 53.081 |
| 1869.0 | 53.082 |
| 1870.0 | 53.084 |
| 1871.0 | 53.085 |
| 1872.0 | 53.087 |
| 1873.0 | 53.088 |
| 1874.0 | 53.089 |
| 1875.0 | 53.091 |
| 1876.0 | 53.092 |
| 1877.0 | 53.094 |
| 1878.0 | 53.095 |
| 1879.0 | 53.097 |
| 1880.0 | 53.098 |
| 1881.0 | 53.1 |
| 1882.0 | 53.101 |
| 1883.0 | 53.103 |
| 1884.0 | 53.104 |
| 1885.0 | 53.106 |
| 1886.0 | 53.107 |
| 1887.0 | 53.109 |
| 1888.0 | 53.11 |
| 1889.0 | 53.112 |
| 1890.0 | 53.113 |
| 1891.0 | 53.115 |
| 1892.0 | 53.116 |
| 1893.0 | 53.118 |
| 1894.0 | 53.12 |
| 1895.0 | 53.121 |
| 1896.0 | 53.123 |
| 1897.0 | 53.124 |
| 1898.0 | 53.126 |
| 1899.0 | 53.128 |
| 1900.0 | 53.129 |
| 1901.0 | 53.131 |
| 1902.0 | 53.133 |
| 1903.0 | 53.134 |
| 1904.0 | 53.136 |
| 1905.0 | 53.138 |
| 1906.0 | 53.14 |
| 1907.0 | 53.142 |
| 1908.0 | 53.143 |
| 1909.0 | 53.145 |
| 1910.0 | 53.147 |
| 1911.0 | 53.149 |
| 1912.0 | 53.151 |
| 1913.0 | 53.152 |
| 1914.0 | 53.154 |
| 1915.0 | 53.156 |
| 1916.0 | 53.158 |
| 1917.0 | 53.16 |
| 1918.0 | 53.162 |
| 1919.0 | 53.164 |
| 1920.0 | 53.166 |
| 1921.0 | 53.168 |
| 1922.0 | 53.17 |
| 1923.0 | 53.172 |
| 1924.0 | 53.174 |
| 1925.0 | 53.176 |
| 1926.0 | 53.178 |
| 1927.0 | 53.18 |
| 1928.0 | 53.182 |
| 1929.0 | 53.184 |
| 1930.0 | 53.186 |
| 1931.0 | 53.189 |
| 1932.0 | 53.191 |
| 1933.0 | 53.193 |
| 1934.0 | 53.195 |
| 1935.0 | 53.197 |
| 1936.0 | 53.199 |
| 1937.0 | 53.201 |
| 1938.0 | 53.204 |
| 1939.0 | 53.206 |
| 1940.0 | 53.208 |
| 1941.0 | 53.21 |
| 1942.0 | 53.212 |
| 1943.0 | 53.214 |
| 1944.0 | 53.217 |
| 1945.0 | 53.219 |
| 1946.0 | 53.221 |
| 1947.0 | 53.223 |
| 1948.0 | 53.225 |
| 1949.0 | 53.227 |
| 1950.0 | 53.23 |
| 1951.0 | 53.232 |
| 1952.0 | 53.234 |
| 1953.0 | 53.236 |
| 1954.0 | 53.238 |
| 1955.0 | 53.24 |
| 1956.0 | 53.242 |
| 1957.0 | 53.245 |
| 1958.0 | 53.247 |
| 1959.0 | 53.249 |
| 1960.0 | 53.251 |
| 1961.0 | 53.253 |
| 1962.0 | 53.255 |
| 1963.0 | 53.257 |
| 1964.0 | 53.259 |
| 1965.0 | 53.261 |
| 1966.0 | 53.263 |
| 1967.0 | 53.265 |
| 1968.0 | 53.267 |
| 1969.0 | 53.269 |
| 1970.0 | 53.271 |
| 1971.0 | 53.273 |
| 1972.0 | 53.275 |
| 1973.0 | 53.277 |
| 1974.0 | 53.279 |
| 1975.0 | 53.28 |
| 1976.0 | 53.282 |
| 1977.0 | 53.284 |
| 1978.0 | 53.286 |
| 1979.0 | 53.288 |
| 1980.0 | 53.289 |
| 1981.0 | 53.291 |
| 1982.0 | 53.293 |
| 1983.0 | 53.295 |
| 1984.0 | 53.296 |
| 1985.0 | 53.298 |
| 1986.0 | 53.3 |
| 1987.0 | 53.301 |
| 1988.0 | 53.303 |
| 1989.0 | 53.305 |
| 1990.0 | 53.306 |
| 1991.0 | 53.308 |
| 1992.0 | 53.309 |
| 1993.0 | 53.311 |
| 1994.0 | 53.312 |
| 1995.0 | 53.314 |
| 1996.0 | 53.315 |
| 1997.0 | 53.317 |
| 1998.0 | 53.318 |
| 1999.0 | 53.319 |
| 2000.0 | 53.321 |
| 2001.0 | 53.322 |
| 2002.0 | 53.324 |
| 2003.0 | 53.325 |
| 2004.0 | 53.326 |
| 2005.0 | 53.328 |
| 2006.0 | 53.329 |
| 2007.0 | 53.33 |
| 2008.0 | 53.331 |
| 2009.0 | 53.333 |
| 2010.0 | 53.334 |
| 2011.0 | 53.335 |
| 2012.0 | 53.336 |
| 2013.0 | 53.337 |
| 2014.0 | 53.338 |
| 2015.0 | 53.34 |
| 2016.0 | 53.341 |
| 2017.0 | 53.342 |
| 2018.0 | 53.343 |
| 2019.0 | 53.344 |
| 2020.0 | 53.345 |
| 2021.0 | 53.346 |
| 2022.0 | 53.347 |
| 2023.0 | 53.348 |
| 2024.0 | 53.349 |
| 2025.0 | 53.35 |
| 2026.0 | 53.351 |
| 2027.0 | 53.352 |
| 2028.0 | 53.353 |
| 2029.0 | 53.354 |
| 2030.0 | 53.355 |
| 2031.0 | 53.356 |
| 2032.0 | 53.357 |
| 2033.0 | 53.358 |
| 2034.0 | 53.359 |
| 2035.0 | 53.359 |
| 2036.0 | 53.36 |
| 2037.0 | 53.361 |
| 2038.0 | 53.362 |
| 2039.0 | 53.363 |
| 2040.0 | 53.364 |
| 2041.0 | 53.365 |
| 2042.0 | 53.366 |
| 2043.0 | 53.366 |
| 2044.0 | 53.367 |
| 2045.0 | 53.368 |
| 2046.0 | 53.369 |
| 2047.0 | 53.37 |
| 2048.0 | 53.37 |
| 2049.0 | 53.371 |
| 2050.0 | 53.372 |
| 2051.0 | 53.373 |
| 2052.0 | 53.374 |
| 2053.0 | 53.374 |
| 2054.0 | 53.375 |
| 2055.0 | 53.376 |
| 2056.0 | 53.377 |
| 2057.0 | 53.378 |
| 2058.0 | 53.378 |
| 2059.0 | 53.379 |
| 2060.0 | 53.38 |
| 2061.0 | 53.381 |
| 2062.0 | 53.382 |
| 2063.0 | 53.382 |
| 2064.0 | 53.383 |
| 2065.0 | 53.384 |
| 2066.0 | 53.385 |
| 2067.0 | 53.385 |
| 2068.0 | 53.386 |
| 2069.0 | 53.387 |
| 2070.0 | 53.388 |
| 2071.0 | 53.389 |
| 2072.0 | 53.389 |
| 2073.0 | 53.39 |
| 2074.0 | 53.391 |
| 2075.0 | 53.392 |
| 2076.0 | 53.392 |
| 2077.0 | 53.393 |
| 2078.0 | 53.394 |
| 2079.0 | 53.395 |
| 2080.0 | 53.395 |
| 2081.0 | 53.396 |
| 2082.0 | 53.397 |
| 2083.0 | 53.398 |
| 2084.0 | 53.398 |
| 2085.0 | 53.399 |
| 2086.0 | 53.4 |
| 2087.0 | 53.401 |
| 2088.0 | 53.401 |
| 2089.0 | 53.402 |
| 2090.0 | 53.403 |
| 2091.0 | 53.403 |
| 2092.0 | 53.404 |
| 2093.0 | 53.405 |
| 2094.0 | 53.406 |
| 2095.0 | 53.406 |
| 2096.0 | 53.407 |
| 2097.0 | 53.408 |
| 2098.0 | 53.408 |
| 2099.0 | 53.409 |
| 2100.0 | 53.409 |
| 2101.0 | 53.41 |
| 2102.0 | 53.411 |
| 2103.0 | 53.411 |
| 2104.0 | 53.412 |
| 2105.0 | 53.412 |
| 2106.0 | 53.413 |
| 2107.0 | 53.414 |
| 2108.0 | 53.414 |
| 2109.0 | 53.415 |
| 2110.0 | 53.415 |
| 2111.0 | 53.416 |
| 2112.0 | 53.416 |
| 2113.0 | 53.417 |
| 2114.0 | 53.417 |
| 2115.0 | 53.417 |
| 2116.0 | 53.418 |
| 2117.0 | 53.418 |
| 2118.0 | 53.419 |
| 2119.0 | 53.419 |
| 2120.0 | 53.419 |
| 2121.0 | 53.42 |
| 2122.0 | 53.42 |
| 2123.0 | 53.42 |
| 2124.0 | 53.421 |
| 2125.0 | 53.421 |
| 2126.0 | 53.421 |
| 2127.0 | 53.421 |
| 2128.0 | 53.422 |
| 2129.0 | 53.422 |
| 2130.0 | 53.422 |
| 2131.0 | 53.422 |
| 2132.0 | 53.422 |
| 2133.0 | 53.422 |
| 2134.0 | 53.422 |
| 2135.0 | 53.422 |
| 2136.0 | 53.422 |
| 2137.0 | 53.422 |
| 2138.0 | 53.422 |
| 2139.0 | 53.422 |
| 2140.0 | 53.422 |
| 2141.0 | 53.422 |
| 2142.0 | 53.422 |
| 2143.0 | 53.422 |
| 2144.0 | 53.422 |
| 2145.0 | 53.422 |
| 2146.0 | 53.421 |
| 2147.0 | 53.421 |
| 2148.0 | 53.421 |
| 2149.0 | 53.421 |
| 2150.0 | 53.42 |
| 2151.0 | 53.42 |
| 2152.0 | 53.42 |
| 2153.0 | 53.419 |
| 2154.0 | 53.419 |
| 2155.0 | 53.418 |
| 2156.0 | 53.418 |
| 2157.0 | 53.417 |
| 2158.0 | 53.417 |
| 2159.0 | 53.416 |
| 2160.0 | 53.416 |
| 2161.0 | 53.415 |
| 2162.0 | 53.414 |
| 2163.0 | 53.414 |
| 2164.0 | 53.413 |
| 2165.0 | 53.412 |
| 2166.0 | 53.412 |
| 2167.0 | 53.411 |
| 2168.0 | 53.41 |
| 2169.0 | 53.409 |
| 2170.0 | 53.409 |
| 2171.0 | 53.408 |
| 2172.0 | 53.407 |
| 2173.0 | 53.406 |
| 2174.0 | 53.405 |
| 2175.0 | 53.404 |
| 2176.0 | 53.403 |
| 2177.0 | 53.402 |
| 2178.0 | 53.401 |
| 2179.0 | 53.4 |
| 2180.0 | 53.399 |
| 2181.0 | 53.398 |
| 2182.0 | 53.397 |
| 2183.0 | 53.396 |
| 2184.0 | 53.395 |
| 2185.0 | 53.394 |
| 2186.0 | 53.393 |
| 2187.0 | 53.392 |
| 2188.0 | 53.391 |
| 2189.0 | 53.39 |
| 2190.0 | 53.389 |
| 2191.0 | 53.388 |
| 2192.0 | 53.387 |
| 2193.0 | 53.386 |
| 2194.0 | 53.386 |
| 2195.0 | 53.385 |
| 2196.0 | 53.384 |
| 2197.0 | 53.383 |
| 2198.0 | 53.382 |
| 2199.0 | 53.381 |
| 2200.0 | 53.38 |
| 2201.0 | 53.379 |
| 2202.0 | 53.378 |
| 2203.0 | 53.378 |
| 2204.0 | 53.377 |
| 2205.0 | 53.376 |
| 2206.0 | 53.375 |
| 2207.0 | 53.375 |
| 2208.0 | 53.374 |
| 2209.0 | 53.373 |
| 2210.0 | 53.373 |
| 2211.0 | 53.372 |
| 2212.0 | 53.372 |
| 2213.0 | 53.371 |
| 2214.0 | 53.371 |
| 2215.0 | 53.37 |
| 2216.0 | 53.37 |
| 2217.0 | 53.369 |
| 2218.0 | 53.369 |
| 2219.0 | 53.369 |
| 2220.0 | 53.369 |
| 2221.0 | 53.368 |
| 2222.0 | 53.368 |
| 2223.0 | 53.368 |
| 2224.0 | 53.368 |
| 2225.0 | 53.368 |
| 2226.0 | 53.368 |
| 2227.0 | 53.368 |
| 2228.0 | 53.368 |
| 2229.0 | 53.368 |
| 2230.0 | 53.368 |
| 2231.0 | 53.369 |
| 2232.0 | 53.369 |
| 2233.0 | 53.369 |
| 2234.0 | 53.37 |
| 2235.0 | 53.37 |
| 2236.0 | 53.37 |
| 2237.0 | 53.371 |
| 2238.0 | 53.371 |
| 2239.0 | 53.372 |
| 2240.0 | 53.372 |
| 2241.0 | 53.373 |
| 2242.0 | 53.373 |
| 2243.0 | 53.374 |
| 2244.0 | 53.375 |
| 2245.0 | 53.375 |
| 2246.0 | 53.376 |
| 2247.0 | 53.377 |
| 2248.0 | 53.377 |
| 2249.0 | 53.378 |
| 2250.0 | 53.379 |
| 2251.0 | 53.38 |
| 2252.0 | 53.381 |
| 2253.0 | 53.382 |
| 2254.0 | 53.382 |
| 2255.0 | 53.383 |
| 2256.0 | 53.384 |
| 2257.0 | 53.385 |
| 2258.0 | 53.386 |
| 2259.0 | 53.387 |
| 2260.0 | 53.388 |
| 2261.0 | 53.389 |
| 2262.0 | 53.39 |
| 2263.0 | 53.391 |
| 2264.0 | 53.392 |
| 2265.0 | 53.393 |
| 2266.0 | 53.394 |
| 2267.0 | 53.395 |
| 2268.0 | 53.396 |
| 2269.0 | 53.397 |
| 2270.0 | 53.398 |
| 2271.0 | 53.399 |
| 2272.0 | 53.4 |
| 2273.0 | 53.401 |
| 2274.0 | 53.402 |
| 2275.0 | 53.403 |
| 2276.0 | 53.404 |
| 2277.0 | 53.405 |
| 2278.0 | 53.406 |
| 2279.0 | 53.407 |
| 2280.0 | 53.408 |
| 2281.0 | 53.409 |
| 2282.0 | 53.41 |
| 2283.0 | 53.411 |
| 2284.0 | 53.412 |
| 2285.0 | 53.413 |
| 2286.0 | 53.414 |
| 2287.0 | 53.415 |
| 2288.0 | 53.416 |
| 2289.0 | 53.417 |
| 2290.0 | 53.418 |
| 2291.0 | 53.419 |
| 2292.0 | 53.419 |
| 2293.0 | 53.42 |
| 2294.0 | 53.421 |
| 2295.0 | 53.422 |
| 2296.0 | 53.423 |
| 2297.0 | 53.424 |
| 2298.0 | 53.424 |
| 2299.0 | 53.425 |
| 2300.0 | 53.426 |
| 2301.0 | 53.427 |
| 2302.0 | 53.427 |
| 2303.0 | 53.428 |
| 2304.0 | 53.429 |
| 2305.0 | 53.43 |
| 2306.0 | 53.43 |
| 2307.0 | 53.431 |
| 2308.0 | 53.432 |
| 2309.0 | 53.432 |
| 2310.0 | 53.433 |
| 2311.0 | 53.433 |
| 2312.0 | 53.434 |
| 2313.0 | 53.435 |
| 2314.0 | 53.435 |
| 2315.0 | 53.436 |
| 2316.0 | 53.436 |
| 2317.0 | 53.437 |
| 2318.0 | 53.437 |
| 2319.0 | 53.438 |
| 2320.0 | 53.438 |
| 2321.0 | 53.439 |
| 2322.0 | 53.439 |
| 2323.0 | 53.44 |
| 2324.0 | 53.44 |
| 2325.0 | 53.441 |
| 2326.0 | 53.441 |
| 2327.0 | 53.441 |
| 2328.0 | 53.442 |
| 2329.0 | 53.442 |
| 2330.0 | 53.442 |
| 2331.0 | 53.443 |
| 2332.0 | 53.443 |
| 2333.0 | 53.443 |
| 2334.0 | 53.444 |
| 2335.0 | 53.444 |
| 2336.0 | 53.444 |
| 2337.0 | 53.445 |
| 2338.0 | 53.445 |
| 2339.0 | 53.445 |
| 2340.0 | 53.445 |
| 2341.0 | 53.446 |
| 2342.0 | 53.446 |
| 2343.0 | 53.446 |
| 2344.0 | 53.446 |
| 2345.0 | 53.447 |
| 2346.0 | 53.447 |
| 2347.0 | 53.447 |
| 2348.0 | 53.447 |
| 2349.0 | 53.447 |
| 2350.0 | 53.448 |
| 2351.0 | 53.448 |
| 2352.0 | 53.448 |
| 2353.0 | 53.448 |
| 2354.0 | 53.448 |
| 2355.0 | 53.449 |
| 2356.0 | 53.449 |
| 2357.0 | 53.449 |
| 2358.0 | 53.449 |
| 2359.0 | 53.449 |
| 2360.0 | 53.449 |
| 2361.0 | 53.45 |
| 2362.0 | 53.45 |
| 2363.0 | 53.45 |
| 2364.0 | 53.45 |
| 2365.0 | 53.45 |
| 2366.0 | 53.45 |
| 2367.0 | 53.451 |
| 2368.0 | 53.451 |
| 2369.0 | 53.451 |
| 2370.0 | 53.451 |
| 2371.0 | 53.451 |
| 2372.0 | 53.451 |
| 2373.0 | 53.451 |
| 2374.0 | 53.452 |
| 2375.0 | 53.452 |
| 2376.0 | 53.452 |
| 2377.0 | 53.452 |
| 2378.0 | 53.452 |
| 2379.0 | 53.452 |
| 2380.0 | 53.453 |
| 2381.0 | 53.453 |
| 2382.0 | 53.453 |
| 2383.0 | 53.453 |
| 2384.0 | 53.453 |
| 2385.0 | 53.454 |
| 2386.0 | 53.454 |
| 2387.0 | 53.454 |
| 2388.0 | 53.454 |
| 2389.0 | 53.454 |
| 2390.0 | 53.455 |
| 2391.0 | 53.455 |
| 2392.0 | 53.455 |
| 2393.0 | 53.455 |
| 2394.0 | 53.455 |
| 2395.0 | 53.456 |
| 2396.0 | 53.456 |
| 2397.0 | 53.456 |
| 2398.0 | 53.456 |
| 2399.0 | 53.457 |
| 2400.0 | 53.457 |
| 2401.0 | 53.457 |
| 2402.0 | 53.457 |
| 2403.0 | 53.458 |
| 2404.0 | 53.458 |
| 2405.0 | 53.458 |
| 2406.0 | 53.459 |
| 2407.0 | 53.459 |
| 2408.0 | 53.459 |
| 2409.0 | 53.46 |
| 2410.0 | 53.46 |
| 2411.0 | 53.46 |
| 2412.0 | 53.46 |
| 2413.0 | 53.461 |
| 2414.0 | 53.461 |
| 2415.0 | 53.462 |
| 2416.0 | 53.462 |
| 2417.0 | 53.462 |
| 2418.0 | 53.463 |
| 2419.0 | 53.463 |
| 2420.0 | 53.463 |
| 2421.0 | 53.464 |
| 2422.0 | 53.464 |
| 2423.0 | 53.465 |
| 2424.0 | 53.465 |
| 2425.0 | 53.465 |
| 2426.0 | 53.466 |
| 2427.0 | 53.466 |
| 2428.0 | 53.467 |
| 2429.0 | 53.467 |
| 2430.0 | 53.467 |
| 2431.0 | 53.468 |
| 2432.0 | 53.468 |
| 2433.0 | 53.469 |
| 2434.0 | 53.469 |
| 2435.0 | 53.47 |
| 2436.0 | 53.47 |
| 2437.0 | 53.471 |
| 2438.0 | 53.471 |
| 2439.0 | 53.472 |
| 2440.0 | 53.472 |
| 2441.0 | 53.472 |
| 2442.0 | 53.473 |
| 2443.0 | 53.473 |
| 2444.0 | 53.474 |
| 2445.0 | 53.474 |
| 2446.0 | 53.475 |
| 2447.0 | 53.475 |
| 2448.0 | 53.476 |
| 2449.0 | 53.476 |
| 2450.0 | 53.477 |
| 2451.0 | 53.477 |
| 2452.0 | 53.478 |
| 2453.0 | 53.478 |
| 2454.0 | 53.479 |
| 2455.0 | 53.479 |
| 2456.0 | 53.48 |
| 2457.0 | 53.48 |
| 2458.0 | 53.481 |
| 2459.0 | 53.481 |
| 2460.0 | 53.481 |
| 2461.0 | 53.482 |
| 2462.0 | 53.482 |
| 2463.0 | 53.483 |
| 2464.0 | 53.483 |
| 2465.0 | 53.484 |
| 2466.0 | 53.484 |
| 2467.0 | 53.485 |
| 2468.0 | 53.485 |
| 2469.0 | 53.485 |
| 2470.0 | 53.486 |
| 2471.0 | 53.486 |
| 2472.0 | 53.487 |
| 2473.0 | 53.487 |
| 2474.0 | 53.487 |
| 2475.0 | 53.488 |
| 2476.0 | 53.488 |
| 2477.0 | 53.489 |
| 2478.0 | 53.489 |
| 2479.0 | 53.489 |
| 2480.0 | 53.49 |
| 2481.0 | 53.49 |
| 2482.0 | 53.491 |
| 2483.0 | 53.491 |
| 2484.0 | 53.491 |
| 2485.0 | 53.492 |
| 2486.0 | 53.492 |
| 2487.0 | 53.492 |
| 2488.0 | 53.493 |
| 2489.0 | 53.493 |
| 2490.0 | 53.494 |
| 2491.0 | 53.494 |
| 2492.0 | 53.494 |
| 2493.0 | 53.495 |
| 2494.0 | 53.495 |
| 2495.0 | 53.495 |
| 2496.0 | 53.496 |
| 2497.0 | 53.496 |
| 2498.0 | 53.497 |
| 2499.0 | 53.497 |
| 2500.0 | 53.498 |
| 2501.0 | 53.498 |
| 2502.0 | 53.498 |
| 2503.0 | 53.499 |
| 2504.0 | 53.499 |
| 2505.0 | 53.5 |
| 2506.0 | 53.5 |
| 2507.0 | 53.501 |
| 2508.0 | 53.501 |
| 2509.0 | 53.502 |
| 2510.0 | 53.503 |
| 2511.0 | 53.503 |
| 2512.0 | 53.504 |
| 2513.0 | 53.504 |
| 2514.0 | 53.505 |
| 2515.0 | 53.506 |
| 2516.0 | 53.506 |
| 2517.0 | 53.507 |
| 2518.0 | 53.508 |
| 2519.0 | 53.509 |
| 2520.0 | 53.51 |
| 2521.0 | 53.51 |
| 2522.0 | 53.511 |
| 2523.0 | 53.512 |
| 2524.0 | 53.513 |
| 2525.0 | 53.514 |
| 2526.0 | 53.515 |
| 2527.0 | 53.517 |
| 2528.0 | 53.518 |
| 2529.0 | 53.519 |
| 2530.0 | 53.52 |
| 2531.0 | 53.522 |
| 2532.0 | 53.523 |
| 2533.0 | 53.524 |
| 2534.0 | 53.526 |
| 2535.0 | 53.528 |
| 2536.0 | 53.529 |
| 2537.0 | 53.531 |
| 2538.0 | 53.533 |
| 2539.0 | 53.534 |
| 2540.0 | 53.536 |
| 2541.0 | 53.538 |
| 2542.0 | 53.54 |
| 2543.0 | 53.542 |
| 2544.0 | 53.544 |
| 2545.0 | 53.546 |
| 2546.0 | 53.549 |
| 2547.0 | 53.551 |
| 2548.0 | 53.553 |
| 2549.0 | 53.556 |
| 2550.0 | 53.558 |
| 2551.0 | 53.561 |
| 2552.0 | 53.563 |
| 2553.0 | 53.566 |
| 2554.0 | 53.569 |
| 2555.0 | 53.571 |
| 2556.0 | 53.574 |
| 2557.0 | 53.577 |
| 2558.0 | 53.58 |
| 2559.0 | 53.583 |
| 2560.0 | 53.586 |
| 2561.0 | 53.588 |
| 2562.0 | 53.591 |
| 2563.0 | 53.594 |
| 2564.0 | 53.597 |
| 2565.0 | 53.6 |
| 2566.0 | 53.603 |
| 2567.0 | 53.606 |
| 2568.0 | 53.609 |
| 2569.0 | 53.612 |
| 2570.0 | 53.615 |
| 2571.0 | 53.617 |
| 2572.0 | 53.62 |
| 2573.0 | 53.623 |
| 2574.0 | 53.625 |
| 2575.0 | 53.628 |
| 2576.0 | 53.63 |
| 2577.0 | 53.633 |
| 2578.0 | 53.635 |
| 2579.0 | 53.637 |
| 2580.0 | 53.64 |
| 2581.0 | 53.642 |
| 2582.0 | 53.644 |
| 2583.0 | 53.646 |
| 2584.0 | 53.647 |
| 2585.0 | 53.649 |
| 2586.0 | 53.65 |
| 2587.0 | 53.652 |
| 2588.0 | 53.653 |
| 2589.0 | 53.654 |
| 2590.0 | 53.655 |
| 2591.0 | 53.656 |
| 2592.0 | 53.657 |
| 2593.0 | 53.657 |
| 2594.0 | 53.658 |
| 2595.0 | 53.658 |
| 2596.0 | 53.658 |
| 2597.0 | 53.658 |
| 2598.0 | 53.658 |
| 2599.0 | 53.658 |
| 2600.0 | 53.657 |
| 2603.16381 | 53.656 |
| 2612.5521 | 53.656 |
| 2622.21268 | 53.655 |
| 2631.59349 | 53.654 |
| 2640.9706 | 53.652 |
| 2650.34398 | 53.651 |
| 2659.71363 | 53.65 |
| 2669.35495 | 53.648 |
| 2678.71699 | 53.646 |
| 2688.07525 | 53.645 |
| 2697.42973 | 53.643 |
| 2707.05537 | 53.64 |
| 2716.40212 | 53.638 |
| 2725.74504 | 53.636 |
| 2735.08413 | 53.634 |
| 2744.69387 | 53.631 |
| 2754.02513 | 53.629 |
| 2763.62678 | 53.626 |
| 2772.95014 | 53.637 |
| 2782.26961 | 53.632 |
| 2791.85908 | 53.627 |
| 2801.17057 | 53.622 |
| 2810.75181 | 53.616 |
| 2820.05529 | 53.611 |
| 2829.35479 | 53.606 |
| 2838.92365 | 53.6 |
| 2848.21505 | 53.595 |
| 2857.77553 | 53.59 |
| 2867.05878 | 53.585 |
| 2876.61084 | 53.58 |
| 2886.15861 | 53.575 |
| 2895.42946 | 53.57 |
| 2904.96873 | 53.566 |
| 2914.23129 | 53.561 |
| 2923.76199 | 53.557 |
| 2933.28833 | 53.553 |
| 2942.53829 | 53.549 |
| 2952.05599 | 53.546 |
| 2961.56927 | 53.542 |
| 2970.80652 | 53.539 |
| 2980.31108 | 53.536 |
| 2989.81119 | 53.533 |
| 2999.03559 | 53.53 |
| 3008.52689 | 53.527 |
| 3018.0137 | 53.525 |
| 3027.496 | 53.523 |
| 3036.97378 | 53.521 |
| 3046.17643 | 53.519 |
| 3055.64527 | 53.517 |
| 3065.10954 | 53.516 |
| 3074.56924 | 53.514 |
| 3084.02434 | 53.513 |
| 3093.47485 | 53.512 |
| 3102.92074 | 53.511 |
| 3112.36199 | 53.51 |
| 3121.7986 | 53.51 |
| 3131.23056 | 53.509 |
| 3140.65783 | 53.509 |
| 3150.08042 | 53.508 |
| 3159.49831 | 53.508 |
| 3168.91148 | 53.508 |
| 3178.31992 | 53.508 |
| 3187.72362 | 53.508 |
| 3197.12256 | 53.508 |
| 3206.51673 | 53.508 |
| 3215.90611 | 53.508 |
| 3225.29069 | 53.509 |
| 3234.67046 | 53.509 |
| 3244.31318 | 53.509 |
| 3253.68314 | 53.51 |
| 3263.04824 | 53.51 |
| 3272.40847 | 53.511 |
| 3282.03104 | 53.511 |
| 3291.38135 | 53.512 |
| 3300.72675 | 53.513 |
| 3310.06721 | 53.513 |
| 3319.6694 | 53.514 |
| 3328.99983 | 53.515 |
| 3338.59166 | 53.515 |
| 3347.912 | 53.516 |
| 3357.22734 | 53.517 |
| 3366.8036 | 53.518 |
| 3376.10876 | 53.518 |
| 3385.67453 | 53.519 |
| 3394.96945 | 53.52 |
| 3404.52465 | 53.52 |
| 3413.80928 | 53.521 |
| 3423.35387 | 53.521 |
| 3432.62815 | 53.522 |
| 3442.16206 | 53.522 |
| 3451.69054 | 53.523 |
| 3460.94911 | 53.523 |
| 3470.46682 | 53.524 |
| 3479.97905 | 53.524 |
| 3489.22178 | 53.524 |
| 3498.72316 | 53.525 |
| 3508.21902 | 53.525 |
| 3517.44579 | 53.525 |
| 3526.9307 | 53.525 |
| 3536.41004 | 53.526 |
| 3545.8838 | 53.526 |
| 3555.35196 | 53.526 |
| 3564.81451 | 53.526 |
| 3574.00881 | 53.526 |
| 3583.46024 | 53.527 |
| 3592.90601 | 53.527 |
| 3602.34611 | 53.527 |
| 3611.78051 | 53.527 |
| 3621.20922 | 53.527 |
| 3630.63221 | 53.527 |
| 3640.04946 | 53.527 |
| 3649.46096 | 53.527 |
| 3658.8667 | 53.527 |
| 3668.26667 | 53.527 |
| 3677.92171 | 53.527 |
| 3687.30991 | 53.526 |
| 3696.69229 | 53.526 |
| 3706.06883 | 53.526 |
| 3715.43952 | 53.525 |
| 3725.06439 | 53.524 |
| 3734.42317 | 53.523 |
| 3743.77605 | 53.522 |
| 3753.12302 | 53.521 |
| 3762.72345 | 53.52 |
| 3772.05838 | 53.518 |
| 3781.38736 | 53.517 |
| 3790.96925 | 53.515 |
| 3800.2861 | 53.513 |
| 3809.85551 | 53.511 |
| 3819.16017 | 53.509 |
| 3828.71702 | 53.508 |
| 3838.00945 | 53.507 |
| 3847.55368 | 53.505 |
| 3856.8338 | 53.504 |
| 3866.36535 | 53.503 |
| 3875.63311 | 53.503 |
| 3885.15192 | 53.502 |
| 3894.66425 | 53.5 |
| 3903.91326 | 53.497 |
| 3913.41276 | 53.493 |
| 3922.90573 | 53.489 |
| 3932.39216 | 53.485 |
| 3941.61591 | 53.481 |
| 3951.08938 | 53.477 |
| 3960.55626 | 53.472 |
| 3970.01653 | 53.468 |
| 3979.47019 | 53.463 |
| 3988.9172 | 53.458 |
| 3998.35756 | 53.454 |
| 4007.79125 | 53.448 |
| 4017.21826 | 53.439 |
| 4026.63856 | 53.486 |
| 4036.05215 | 53.46 |
| 4045.459 | 53.47 |
| 4054.85911 | 53.51 |
| 4064.25245 | 53.505 |
| 4073.63902 | 53.494 |
| 4083.01878 | 53.465 |
| 4092.64497 | 53.408 |
| 4102.01092 | 53.358 |
| 4111.37002 | 53.344 |
| 4120.72227 | 53.364 |
| 4130.32012 | 53.365 |
| 4139.65842 | 53.357 |
| 4148.98981 | 53.347 |
| 4158.56619 | 53.333 |
| 4167.88354 | 53.335 |
| 4177.44547 | 53.328 |
| 4186.74871 | 53.324 |
| 4196.29611 | 53.293 |
| 4205.58518 | 53.283 |
| 4215.11799 | 53.283 |
| 4224.39282 | 53.298 |
| 4233.91099 | 53.289 |
| 4243.4217 | 53.262 |
| 4252.67496 | 53.243 |
| 4262.17092 | 53.238 |
| 4271.65939 | 53.249 |
| 4281.14033 | 53.223 |
| 4290.36455 | 53.193 |
| 4299.83061 | 53.161 |
| 4309.28911 | 53.14 |
| 4318.74003 | 53.12 |
| 4328.18335 | 53.113 |
| 4337.61905 | 53.107 |
| 4347.04712 | 53.079 |
| 4356.46754 | 53.052 |
| 4365.8803 | 53.01 |
| 4375.28538 | 53.005 |
| 4384.68276 | 52.986 |
| 4394.07242 | 52.991 |
| 4403.70114 | 52.99 |
| 4413.07512 | 52.96 |
| 4422.44134 | 52.95 |
| 4431.79977 | 52.929 |
| 4441.39637 | 52.884 |
| 4450.73899 | 52.869 |
| 4460.07378 | 52.862 |
| 4469.64605 | 52.877 |
| 4478.96492 | 52.911 |
| 4488.52083 | 52.926 |
| 4497.82371 | 52.933 |
| 4507.36318 | 52.913 |
| 4516.65001 | 52.886 |
| 4526.17296 | 52.863 |
| 4535.44367 | 52.855 |
| 4544.95005 | 52.858 |
| 4554.448 | 52.859 |
| 4563.93752 | 52.842 |
| 4573.17557 | 52.818 |
| 4582.64837 | 52.81 |
| 4592.11267 | 52.795 |
| 4601.56847 | 52.777 |
| 4611.01573 | 52.767 |
| 4620.45445 | 52.741 |
| 4629.88461 | 52.755 |
| 4639.30619 | 52.768 |
| 4648.71917 | 52.766 |
| 4658.12353 | 52.755 |
| 4667.51926 | 52.735 |
| 4676.90634 | 52.735 |
| 4686.28475 | 52.736 |
| 4695.89461 | 52.73 |
| 4705.25541 | 52.718 |
| 4714.60749 | 52.704 |
| 4724.1903 | 52.707 |
| 4733.52466 | 52.695 |
| 4742.85025 | 52.686 |
| 4752.40583 | 52.694 |
| 4761.7136 | 52.668 |
| 4771.25086 | 52.647 |
| 4780.54073 | 52.641 |
| 4790.05961 | 52.629 |
| 4799.56914 | 52.619 |
| 4808.83193 | 52.607 |
| 4818.32296 | 52.585 |
| 4827.80461 | 52.556 |
| 4837.27684 | 52.539 |
| 4846.50318 | 52.51 |
| 4855.95677 | 52.482 |
| 4865.40089 | 52.469 |
| 4874.83553 | 52.454 |
| 4884.26066 | 52.43 |
| 4893.67627 | 52.406 |
| 4903.08234 | 52.37 |
| 4912.71364 | 52.365 |
| 4922.10033 | 52.352 |
| 4931.47743 | 52.329 |
| 4940.84491 | 52.272 |
| 4950.20276 | 52.246 |
| 4959.78454 | 52.225 |
| 4969.12283 | 52.209 |
| 4978.68452 | 52.177 |
| 4988.00318 | 52.146 |
| 4997.54471 | 52.093 |
| 5007.02133 | 52.076 |
| 5016.08524 | 52.035 |
| 5025.90348 | 51.994 |
| 5034.96555 | 51.979 |
| 5044.7818 | 51.953 |
| 5053.84204 | 51.941 |
| 5063.65629 | 51.912 |
| 5072.71467 | 51.885 |
| 5082.52691 | 51.854 |
| 5091.58344 | 51.81 |
| 5101.39367 | 51.784 |
| 5110.44833 | 51.745 |
| 5120.25654 | 51.713 |
| 5129.30933 | 51.688 |
| 5139.11551 | 51.67 |
| 5148.16643 | 51.649 |
| 5157.97057 | 51.642 |
| 5167.0196 | 51.612 |
| 5176.8217 | 51.585 |
| 5185.86884 | 51.568 |
| 5195.66889 | 51.553 |
| 5204.71413 | 51.528 |
| 5214.51212 | 51.506 |
| 5223.55546 | 51.487 |
| 5233.35138 | 51.465 |
| 5242.39281 | 51.454 |
| 5252.18665 | 51.432 |
| 5261.22616 | 51.415 |
| 5271.01793 | 51.404 |
| 5280.05551 | 51.393 |
| 5289.84519 | 51.409 |
| 5298.88084 | 51.403 |
| 5308.66842 | 51.39 |
| 5317.70213 | 51.365 |
| 5327.48761 | 51.372 |
| 5336.51938 | 51.368 |
| 5346.30274 | 51.353 |
| 5355.33256 | 51.344 |
| 5365.1138 | 51.344 |
| 5374.14166 | 51.333 |
| 5383.92077 | 51.336 |
| 5392.94667 | 51.322 |
| 5402.72365 | 51.314 |
| 5412.49952 | 51.308 |
| 5421.52241 | 51.298 |
| 5431.29613 | 51.282 |
| 5440.31704 | 51.255 |
| 5450.08861 | 51.244 |
| 5459.10753 | 51.221 |
| 5468.87694 | 51.238 |
| 5477.89386 | 51.259 |
| 5487.6611 | 51.25 |
| 5496.67602 | 51.241 |
| 5506.44109 | 51.242 |
| 5516.20502 | 51.236 |
| 5525.21688 | 51.215 |
| 5534.97863 | 51.22 |
| 5543.98846 | 51.179 |
| 5553.74802 | 51.153 |
| 5562.75583 | 51.145 |
| 5572.51318 | 51.132 |
| 5581.51895 | 51.115 |
| 5591.2741 | 51.089 |
| 5601.02809 | 51.082 |
| 5610.03076 | 51.052 |
| 5619.78253 | 51.036 |
| 5628.78314 | 51.016 |
| 5638.53269 | 51.008 |
| 5647.53124 | 50.985 |
| 5657.27855 | 50.944 |
| 5667.0247 | 50.916 |
| 5676.02011 | 50.852 |
| 5685.76401 | 50.822 |
| 5694.75735 | 50.804 |
| 5704.49899 | 50.799 |
| 5713.49024 | 50.802 |
| 5723.22963 | 50.784 |
| 5732.96784 | 50.771 |
| 5741.95591 | 50.756 |
| 5751.69185 | 50.74 |
| 5760.67782 | 50.721 |
| 5770.41147 | 50.705 |
| 5780.14394 | 50.705 |
| 5789.12671 | 50.686 |
| 5798.85688 | 50.699 |
| 5807.83753 | 50.654 |
| 5817.56541 | 50.633 |
| 5826.54393 | 50.612 |
| 5836.2695 | 50.589 |
| 5845.99388 | 50.577 |
| 5854.96915 | 50.539 |
| 5864.69121 | 50.46 |
| 5873.66435 | 50.444 |
| 5883.38408 | 50.415 |
| 5893.1026 | 50.395 |
| 5902.07246 | 50.384 |
| 5911.78865 | 50.362 |
| 5921.50362 | 50.326 |
| 5930.4702 | 50.313 |
| 5940.18282 | 50.3 |
| 5949.14723 | 50.262 |
| 5958.8575 | 50.246 |
| 5968.56654 | 50.214 |
| 5977.52764 | 50.203 |
| 5987.23431 | 50.199 |
| 5996.93976 | 50.185 |
| 6005.89753 | 50.156 |
| 6015.6006 | 50.139 |
| 6024.55617 | 50.108 |
| 6034.25685 | 50.095 |
| 6043.95629 | 50.085 |
| 6052.90852 | 50.067 |
| 6062.60556 | 50.057 |
| 6072.30136 | 50.025 |
| 6081.25021 | 49.996 |
| 6090.9436 | 49.966 |
| 6099.89023 | 49.928 |
| 6109.58121 | 49.894 |
| 6119.27092 | 49.874 |
| 6128.21416 | 49.849 |
| 6137.90145 | 49.814 |
| 6147.58748 | 49.806 |
| 6156.5273 | 49.787 |
| 6166.2109 | 49.752 |
| 6175.89322 | 49.715 |
| 6184.82962 | 49.644 |
| 6194.50949 | 49.649 |
| 6204.18809 | 49.636 |
| 6213.12105 | 49.63 |
| 6222.79719 | 49.643 |
| 6232.47205 | 49.631 |
| 6241.40155 | 49.607 |
| 6251.07394 | 49.65 |
| 6260.74504 | 49.622 |
| 6269.67107 | 49.608 |
| 6279.33969 | 49.59 |
| 6289.00702 | 49.58 |
| 6297.92955 | 49.551 |
| 6307.59439 | 49.563 |
| 6317.25793 | 49.572 |
| 6326.17696 | 49.568 |
| 6335.83799 | 49.559 |
| 6345.49772 | 49.531 |
| 6354.41323 | 49.508 |
| 6364.07045 | 49.505 |
| 6373.72635 | 49.482 |
| 6383.38094 | 49.475 |
| 6392.29171 | 49.478 |
| 6401.94377 | 49.423 |
| 6411.59451 | 49.402 |
| 6420.50172 | 49.351 |
| 6430.14992 | 49.336 |
| 6439.7968 | 49.3 |
| 6448.70043 | 49.228 |
| 6458.34476 | 49.17 |
| 6467.98776 | 49.094 |
| 6477.62942 | 49.02 |
| 6486.52823 | 48.932 |
| 6496.16733 | 48.835 |
| 6505.80509 | 48.737 |
| 6514.7003 | 48.596 |
| 6524.33548 | 48.438 |
| 6533.96932 | 48.28 |
| 6543.60181 | 48.103 |
| 6552.49215 | 47.919 |
| 6562.12205 | 47.717 |
| 6571.75059 | 47.518 |
| 6580.63728 | 47.275 |
| 6590.26323 | 47.011 |
| 6599.88782 | 46.711 |
| 6609.51104 | 46.346 |
| 6618.39282 | 45.996 |
| 6628.01342 | 45.627 |
| 6637.63267 | 45.252 |
| 6647.25055 | 44.872 |
| 6656.12737 | 44.462 |
| 6665.74262 | 44.035 |
| 6675.35649 | 43.562 |
| 6684.96898 | 43.117 |
| 6693.84083 | 42.61 |
| 6703.45068 | 42.08 |
| 6713.05915 | 41.57 |
| 6722.66623 | 41.064 |
| 6731.53308 | 40.56 |
| 6741.1375 | 40.096 |
| 6750.74053 | 39.599 |
| 6760.34218 | 39.097 |
| 6769.204 | 38.604 |
| 6778.80296 | 38.136 |
| 6788.40053 | 37.736 |
| 6797.9967 | 37.321 |
| 6806.85346 | 36.962 |
| 6816.44693 | 36.553 |
| 6826.039 | 36.173 |
| 6835.62967 | 35.859 |
| 6845.21893 | 35.524 |
| 6854.0693 | 35.222 |
| 6863.65585 | 34.925 |
| 6873.24098 | 34.654 |
| 6882.8247 | 34.393 |
| 6891.66995 | 34.127 |
| 6901.25094 | 33.917 |
| 6910.83051 | 33.72 |
| 6920.40865 | 33.523 |
| 6929.98538 | 33.356 |
| 6938.82416 | 33.192 |
| 6948.39813 | 33.067 |
| 6957.97068 | 32.939 |
| 6967.54179 | 32.809 |
| 6977.11147 | 32.721 |
| 6985.94374 | 32.679 |
| 6995.51065 | 32.66 |
| 7005.07612 | 32.64 |
| 7014.64015 | 32.665 |
| 7024.20274 | 32.662 |
| 7033.76387 | 32.681 |
| 7042.58825 | 32.742 |
| 7052.1466 | 32.806 |
| 7061.7035 | 32.902 |
| 7071.25895 | 33.005 |
| 7080.81294 | 33.109 |
| 7089.63071 | 33.279 |
| 7099.18189 | 33.419 |
| 7108.73161 | 33.558 |
| 7118.27987 | 33.701 |
| 7127.82666 | 33.827 |
| 7137.37198 | 33.963 |
| 7146.18175 | 34.1 |
| 7155.72424 | 34.249 |
| 7165.26526 | 34.377 |
| 7174.80481 | 34.48 |
| 7184.34288 | 34.571 |
| 7193.87947 | 34.639 |
| 7203.41457 | 34.726 |
| 7212.2149 | 34.806 |
| 7221.74715 | 34.854 |
| 7231.27792 | 34.903 |
| 7240.80719 | 34.946 |
| 7250.33498 | 34.977 |
| 7259.86127 | 34.993 |
| 7269.38607 | 35.01 |
| 7278.17686 | 35.022 |
| 7287.69878 | 35.013 |
| 7297.2192 | 35.004 |
| 7306.73811 | 34.971 |
| 7316.25552 | 34.943 |
| 7325.77143 | 34.917 |
| 7335.28582 | 34.877 |
| 7344.79871 | 34.835 |
| 7353.57849 | 34.786 |
| 7363.08846 | 34.725 |
| 7372.59692 | 34.642 |
| 7382.10386 | 34.571 |
| 7391.60928 | 34.509 |
| 7401.11318 | 34.423 |
| 7410.61555 | 34.331 |
| 7420.1164 | 34.23 |
| 7429.61572 | 34.127 |
| 7438.38296 | 34.014 |
| 7447.87934 | 33.901 |
| 7457.37418 | 33.784 |
| 7466.86749 | 33.676 |
| 7476.35926 | 33.549 |
| 7485.84949 | 33.436 |
| 7495.33817 | 33.318 |
| 7504.82532 | 33.198 |
| 7514.31092 | 33.063 |
| 7523.79497 | 32.928 |
| 7533.27747 | 32.778 |
| 7542.75842 | 32.625 |
| 7551.50869 | 32.471 |
| 7560.98665 | 32.321 |
| 7570.46306 | 32.157 |
| 7579.9379 | 32.003 |
| 7589.41119 | 31.841 |
| 7598.88291 | 31.688 |
| 7608.35307 | 31.543 |
| 7617.82166 | 31.412 |
| 7627.28868 | 31.273 |
| 7636.75413 | 31.117 |
| 7646.21801 | 30.966 |
| 7655.68032 | 30.818 |
| 7665.14105 | 30.688 |
| 7674.6002 | 30.546 |
| 7684.05777 | 30.422 |
| 7693.51375 | 30.288 |
| 7702.96816 | 30.144 |
| 7712.42097 | 30.003 |
| 7721.14524 | 29.867 |
| 7730.595 | 29.751 |
| 7740.04317 | 29.63 |
| 7749.48974 | 29.507 |
| 7758.93472 | 29.395 |
| 7768.37811 | 29.279 |
| 7777.81989 | 29.152 |
| 7787.26007 | 29.019 |
| 7796.69864 | 28.903 |
| 7806.13562 | 28.779 |
| 7815.57098 | 28.634 |
| 7825.00473 | 28.499 |
| 7834.43688 | 28.361 |
| 7843.86741 | 28.214 |
| 7853.29632 | 28.059 |
| 7862.72362 | 27.867 |
| 7872.1493 | 27.676 |
| 7881.57335 | 27.491 |
| 7890.99579 | 27.293 |
| 7900.4166 | 27.099 |
| 7909.83578 | 26.906 |
| 7919.25333 | 26.702 |
| 7928.66926 | 26.481 |
| 7938.08355 | 26.272 |
| 7947.4962 | 26.051 |
| 7956.90722 | 25.821 |
| 7966.3166 | 25.6 |
| 7975.72434 | 25.38 |
| 7985.13044 | 25.157 |
| 7994.53489 | 24.943 |
| 8003.9377 | 24.712 |
| 8014.06196 | 24.468 |
| 8023.46134 | 24.25 |
| 8032.85907 | 24.035 |
| 8042.25515 | 23.83 |
| 8051.64957 | 23.602 |
| 8061.04233 | 23.406 |
| 8070.43343 | 23.214 |
| 8079.82287 | 23.045 |
| 8089.21064 | 22.885 |
| 8098.59675 | 22.72 |
| 8107.9812 | 22.561 |
| 8117.36397 | 22.398 |
| 8126.74507 | 22.269 |
| 8136.1245 | 22.128 |
| 8145.50225 | 21.992 |
| 8154.87833 | 21.864 |
| 8164.25272 | 21.729 |
| 8173.62544 | 21.63 |
| 8183.71725 | 21.522 |
| 8193.08646 | 21.436 |
| 8202.45399 | 21.355 |
| 8211.81983 | 21.275 |
| 8221.18398 | 21.203 |
| 8230.54644 | 21.14 |
| 8239.9072 | 21.086 |
| 8249.26627 | 21.055 |
| 8258.62363 | 21.024 |
| 8267.9793 | 20.991 |
| 8277.33326 | 20.966 |
| 8287.40485 | 20.934 |
| 8296.75528 | 20.91 |
| 8306.10399 | 20.898 |
| 8315.45099 | 20.889 |
| 8324.79628 | 20.873 |
| 8334.13985 | 20.854 |
| 8343.48171 | 20.859 |
| 8352.82186 | 20.845 |
| 8362.16028 | 20.82 |
| 8372.21511 | 20.792 |
| 8381.54995 | 20.744 |
| 8390.88307 | 20.701 |
| 8400.21446 | 20.663 |
| 8409.54412 | 20.621 |
| 8418.87205 | 20.582 |
| 8428.19824 | 20.526 |
| 8437.5227 | 20.47 |
| 8447.56248 | 20.392 |
| 8456.88333 | 20.295 |
| 8466.20243 | 20.221 |
| 8475.5198 | 20.11 |
| 8484.83541 | 20.011 |
| 8494.14928 | 19.907 |
| 8504.17765 | 19.792 |
| 8513.48788 | 19.64 |
| 8522.79637 | 19.506 |
| 8532.10309 | 19.359 |
| 8541.40806 | 19.203 |
| 8550.71127 | 19.063 |
| 8560.72815 | 18.882 |
| 8570.0277 | 18.71 |
| 8579.32549 | 18.53 |
| 8588.62151 | 18.346 |
| 8597.91576 | 18.162 |
| 8607.20824 | 17.95 |
| 8617.21355 | 17.755 |
| 8626.50235 | 17.532 |
| 8635.78937 | 17.296 |
| 8645.07461 | 17.064 |
| 8654.35808 | 16.84 |
| 8664.35366 | 16.589 |
| 8673.63342 | 16.352 |
| 8682.91139 | 16.081 |
| 8692.18758 | 15.831 |
| 8701.46197 | 15.549 |
| 8711.44778 | 15.275 |
| 8720.71845 | 15.022 |
| 8729.98733 | 14.737 |
| 8739.25441 | 14.447 |
| 8749.23233 | 14.177 |
| 8758.49567 | 13.903 |
| 8767.7572 | 13.64 |
| 8777.01693 | 13.388 |
| 8786.98693 | 13.123 |
| 8796.2429 | 12.848 |
| 8805.49707 | 12.582 |
| 8814.74942 | 12.322 |
| 8823.99995 | 12.078 |
| 8833.96003 | 11.846 |
| 8843.20679 | 11.608 |
| 8852.45173 | 11.363 |
| 8861.69484 | 11.125 |
| 8871.64693 | 10.909 |
| 8880.88625 | 10.687 |
| 8890.12374 | 10.492 |
| 8900.06976 | 10.318 |
| 8909.30345 | 10.13 |
| 8918.53531 | 9.964 |
| 8927.76533 | 9.801 |
| 8937.70329 | 9.662 |
| 8946.92949 | 9.546 |
| 8956.15384 | 9.438 |
| 8965.37635 | 9.343 |
| 8975.30623 | 9.269 |
| 8984.5249 | 9.197 |
| 8993.74172 | 9.166 |
| 9003.66547 | 9.12 |
| 9012.87844 | 9.123 |
| 9022.08956 | 9.154 |
| 9032.00715 | 9.185 |
| 9041.21441 | 9.222 |
| 9050.41981 | 9.289 |
| 9060.33123 | 9.371 |
| 9069.53275 | 9.488 |
| 9078.73241 | 9.604 |
| 9087.9302 | 9.765 |
| 9097.83342 | 9.932 |
| 9107.02732 | 10.085 |
| 9116.21934 | 10.286 |
| 9126.11634 | 10.505 |
| 9135.30446 | 10.722 |
| 9144.49071 | 10.958 |
| 9154.38148 | 11.174 |
| 9163.5638 | 11.398 |
| 9172.74424 | 11.662 |
| 9182.62876 | 11.938 |
| 9191.80528 | 12.197 |
| 9201.68556 | 12.487 |
| 9210.85815 | 12.757 |
| 9220.02883 | 13.035 |
| 9229.90283 | 13.339 |
| 9239.06957 | 13.636 |
| 9248.23441 | 13.955 |
| 9258.10211 | 14.263 |
| 9267.26299 | 14.568 |
| 9277.12642 | 14.87 |
| 9286.28333 | 15.167 |
| 9295.43834 | 15.489 |
| 9305.29543 | 15.823 |
| 9314.44646 | 16.138 |
| 9323.59556 | 16.447 |
| 9333.4463 | 16.75 |
| 9342.59142 | 17.079 |
| 9352.43786 | 17.388 |
| 9361.57898 | 17.705 |
| 9370.71817 | 18.02 |
| 9380.55822 | 18.315 |
| 9389.6934 | 18.631 |
| 9399.52913 | 18.944 |
| 9408.66029 | 19.234 |
| 9418.49169 | 19.522 |
| 9427.61883 | 19.81 |
| 9436.74402 | 20.095 |
| 9446.56898 | 20.37 |
| 9455.69014 | 20.636 |
| 9465.51075 | 20.9 |
| 9474.62787 | 21.162 |
| 9484.44411 | 21.404 |
| 9493.55717 | 21.635 |
| 9502.66828 | 21.853 |
| 9512.47805 | 22.053 |
| 9521.58508 | 22.246 |
| 9531.39047 | 22.415 |
| 9540.49343 | 22.604 |
| 9550.29443 | 22.785 |
| 9559.39331 | 22.93 |
| 9569.1899 | 23.062 |
| 9578.28469 | 23.191 |
| 9588.07688 | 23.288 |
| 9597.16757 | 23.398 |
| 9606.95533 | 23.485 |
| 9616.04192 | 23.573 |
| 9625.82526 | 23.641 |
| 9634.90773 | 23.708 |
| 9644.68663 | 23.746 |
| 9653.76498 | 23.807 |
| 9663.53944 | 23.826 |
| 9672.61366 | 23.85 |
| 9682.38366 | 23.858 |
| 9691.45374 | 23.836 |
| 9701.21928 | 23.835 |
| 9710.28522 | 23.808 |
| 9720.04629 | 23.766 |
| 9729.10807 | 23.699 |
| 9738.86466 | 23.645 |
| 9747.92227 | 23.573 |
| 9757.67438 | 23.486 |
| 9766.72782 | 23.403 |
| 9776.47543 | 23.296 |
| 9785.5247 | 23.161 |
| 9795.2678 | 23.041 |
| 9804.31288 | 22.899 |
| 9814.05147 | 22.758 |
| 9823.78772 | 22.621 |
| 9832.82642 | 22.465 |
| 9842.55815 | 22.291 |
| 9851.59264 | 22.113 |
| 9861.31983 | 21.926 |
| 9870.35011 | 21.725 |
| 9880.07275 | 21.532 |
| 9889.79303 | 21.33 |
| 9898.81689 | 21.117 |
| 9908.53262 | 20.908 |
| 9917.55225 | 20.695 |
| 9927.26341 | 20.477 |
| 9936.27879 | 20.233 |
| 9945.98538 | 20 |
| 9955.68959 | 19.773 |
| 9964.69851 | 19.55 |
| 9974.39813 | 19.304 |
| 9983.40279 | 19.069 |
| 9993.09782 | 18.816 |
| 10002.79046 | 18.552 |
| 10011.78863 | 18.301 |
| 10021.47666 | 18.049 |
| 10031.1623 | 17.795 |
| 10040.15396 | 17.508 |
| 10049.83498 | 17.263 |
| 10058.82234 | 17.009 |
| 10068.49873 | 16.743 |
| 10078.17271 | 16.486 |
| 10087.15354 | 16.23 |
| 10096.82287 | 15.968 |
| 10106.4898 | 15.742 |
| 10115.46407 | 15.502 |
| 10125.12634 | 15.255 |
| 10134.78619 | 15.002 |
| 10143.75388 | 14.777 |
| 10153.40906 | 14.545 |
| 10163.06182 | 14.32 |
| 10172.02292 | 14.084 |
| 10181.67099 | 13.868 |
| 10191.31663 | 13.652 |
| 10200.27112 | 13.448 |
| 10209.91206 | 13.24 |
| 10219.55057 | 13.035 |
| 10228.49842 | 12.847 |
| 10238.13222 | 12.648 |
| 10247.76357 | 12.466 |
| 10257.39248 | 12.293 |
| 10266.33141 | 12.125 |
| 10275.95559 | 11.957 |
| 10285.57731 | 11.799 |
| 10294.50957 | 11.651 |
| 10304.12656 | 11.514 |
| 10313.74108 | 11.39 |
| 10323.35314 | 11.28 |
| 10332.27642 | 11.17 |
| 10341.88373 | 11.055 |
| 10351.48856 | 10.934 |
| 10361.09092 | 10.841 |
| 10370.00519 | 10.76 |
| 10379.60277 | 10.696 |
| 10389.19788 | 10.626 |
| 10398.79051 | 10.553 |
| 10407.69573 | 10.477 |
| 10417.28357 | 10.442 |
| 10426.86891 | 10.422 |
| 10436.45177 | 10.386 |
| 10445.34791 | 10.345 |
| 10454.92596 | 10.311 |
| 10464.50151 | 10.283 |
| 10474.07457 | 10.246 |
| 10482.96159 | 10.228 |
| 10492.52982 | 10.2 |
| 10502.09554 | 10.173 |
| 10511.65875 | 10.158 |
| 10521.21946 | 10.143 |
| 10530.095 | 10.115 |
| 10539.65086 | 10.116 |
| 10549.2042 | 10.083 |
| 10558.75502 | 10.071 |
| 10568.30331 | 10.035 |
| 10577.84909 | 10.02 |
| 10586.71076 | 9.997 |
| 10596.25166 | 9.964 |
| 10605.79002 | 9.949 |
| 10615.32586 | 9.917 |
| 10624.85916 | 9.899 |
| 10634.38992 | 9.862 |
| 10643.23764 | 9.834 |
| 10652.76351 | 9.809 |
| 10662.28683 | 9.766 |
| 10671.8076 | 9.721 |
| 10681.32582 | 9.658 |
| 10690.8415 | 9.596 |
| 10700.35462 | 9.536 |
| 10709.18594 | 9.467 |
| 10718.69413 | 9.388 |
| 10728.19976 | 9.318 |
| 10737.70283 | 9.253 |
| 10747.20333 | 9.185 |
| 10756.70127 | 9.096 |
| 10766.19663 | 9.01 |
| 10775.68943 | 8.905 |
| 10785.17965 | 8.808 |
| 10794.6673 | 8.713 |
| 10803.47495 | 8.584 |
| 10812.95762 | 8.47 |
| 10822.43772 | 8.33 |
| 10831.91522 | 8.206 |
| 10841.39014 | 8.09 |
| 10850.86247 | 7.98 |
| 10860.33221 | 7.865 |
| 10869.79936 | 7.737 |
| 10879.26391 | 7.605 |
| 10888.72586 | 7.471 |
| 10898.18521 | 7.352 |
| 10907.64196 | 7.23 |
| 10917.0961 | 7.117 |
| 10926.54764 | 6.976 |
| 10935.99656 | 6.863 |
| 10945.44288 | 6.754 |
| 10954.88658 | 6.635 |
| 10964.32766 | 6.522 |
| 10973.76613 | 6.41 |
| 10982.52807 | 6.3 |
| 10991.96148 | 6.174 |
| 11001.39227 | 6.078 |
| 11010.82042 | 5.978 |
| 11020.24595 | 5.875 |
| 11029.66885 | 5.78 |
| 11039.08911 | 5.672 |
| 11049.17932 | 5.579 |
| 11058.59412 | 5.475 |
| 11068.00628 | 5.403 |
| 11077.41579 | 5.316 |
| 11086.82266 | 5.226 |
| 11096.22688 | 5.145 |
| 11105.62845 | 5.081 |
| 11115.02737 | 5.031 |
| 11124.42363 | 4.971 |
| 11133.81724 | 4.916 |
| 11143.20819 | 4.845 |
| 11152.59647 | 4.797 |
| 11161.9821 | 4.763 |
| 11171.36505 | 4.724 |
| 11180.74534 | 4.692 |
| 11190.12296 | 4.664 |
| 11199.49791 | 4.629 |
| 11208.87018 | 4.613 |
| 11218.23978 | 4.588 |
| 11227.6067 | 4.578 |
| 11237.6397 | 4.542 |
| 11247.00106 | 4.512 |
| 11256.35974 | 4.513 |
| 11265.71572 | 4.517 |
| 11275.06902 | 4.518 |
| 11284.41962 | 4.496 |
| 11293.76753 | 4.48 |
| 11303.11274 | 4.462 |
| 11312.45525 | 4.468 |
| 11322.46208 | 4.471 |
| 11331.79899 | 4.492 |
| 11341.1332 | 4.499 |
| 11350.4647 | 4.519 |
| 11359.79348 | 4.518 |
| 11369.11956 | 4.522 |
| 11378.44291 | 4.55 |
| 11388.42921 | 4.576 |
| 11397.74694 | 4.605 |
| 11407.06194 | 4.635 |
| 11416.37422 | 4.641 |
| 11425.68378 | 4.683 |
| 11434.9906 | 4.714 |
| 11444.95917 | 4.772 |
| 11454.26034 | 4.805 |
| 11463.55877 | 4.857 |
| 11472.85446 | 4.908 |
| 11482.14742 | 4.964 |
| 11492.10111 | 4.998 |
| 11501.38838 | 5.034 |
| 11510.6729 | 5.094 |
| 11519.95468 | 5.168 |
| 11529.2337 | 5.225 |
| 11539.17246 | 5.281 |
| 11548.44577 | 5.362 |
| 11557.71633 | 5.433 |
| 11566.98413 | 5.497 |
| 11576.91085 | 5.57 |
| 11586.17293 | 5.633 |
| 11595.43224 | 5.72 |
| 11604.68877 | 5.828 |
| 11614.60342 | 5.91 |
| 11623.85421 | 5.996 |
| 11633.10223 | 6.108 |
| 11642.34747 | 6.195 |
| 11652.25 | 6.292 |
| 11661.48948 | 6.4 |
| 11670.72618 | 6.505 |
| 11680.61954 | 6.595 |
| 11689.85046 | 6.681 |
| 11699.07859 | 6.757 |
| 11708.96276 | 6.883 |
| 11718.1851 | 6.973 |
| 11727.40464 | 7.089 |
| 11736.62138 | 7.174 |
| 11746.49334 | 7.302 |
| 11755.70427 | 7.416 |
| 11764.91239 | 7.522 |
| 11774.77512 | 7.612 |
| 11783.97742 | 7.697 |
| 11793.1769 | 7.794 |
| 11803.03036 | 7.877 |
| 11812.22401 | 7.929 |
| 11822.07122 | 7.998 |
| 11831.25902 | 8.062 |
| 11840.444 | 8.122 |
| 11850.28191 | 8.183 |
| 11859.46102 | 8.236 |
| 11868.63731 | 8.27 |
| 11878.46589 | 8.314 |
| 11887.6363 | 8.338 |
| 11897.45859 | 8.33 |
| 11906.62312 | 8.311 |
| 11915.7848 | 8.319 |
| 11925.59774 | 8.302 |
| 11934.75352 | 8.27 |
| 11944.56013 | 8.227 |
| 11953.71001 | 8.184 |
| 11962.85704 | 8.144 |
| 11972.65425 | 8.121 |
| 11981.79535 | 8.064 |
| 11991.58622 | 7.993 |
| 12000.72139 | 7.921 |
| 12010.5059 | 7.862 |
| 12019.63514 | 7.796 |
| 12029.41328 | 7.727 |
| 12038.53656 | 7.645 |
| 12048.30832 | 7.562 |
| 12057.42565 | 7.492 |
| 12066.5401 | 7.407 |
| 12076.30239 | 7.357 |
| 12085.41086 | 7.273 |
| 12095.16674 | 7.163 |
| 12104.26924 | 7.07 |
| 12114.01871 | 6.968 |
| 12123.11522 | 6.889 |
| 12132.85826 | 6.782 |
| 12141.94877 | 6.697 |
| 12151.68538 | 6.599 |
| 12161.41866 | 6.491 |
| 12170.50004 | 6.405 |
| 12180.22687 | 6.313 |
| 12189.30224 | 6.267 |
| 12199.02261 | 6.218 |
| 12208.09194 | 6.167 |
| 12217.80585 | 6.098 |
| 12226.86913 | 6.057 |
| 12236.57656 | 6.001 |
| 12245.6338 | 5.958 |
| 12255.33474 | 5.936 |
| 12265.03232 | 5.912 |
| 12274.08035 | 5.901 |
| 12283.77143 | 5.903 |
| 12292.81339 | 5.907 |
| 12302.49796 | 5.917 |
| 12312.17915 | 5.94 |
| 12321.21188 | 5.931 |
| 12330.88654 | 5.981 |
| 12339.91317 | 6.018 |
| 12349.58129 | 6.042 |
| 12359.24603 | 6.052 |
| 12368.26339 | 6.083 |
| 12377.92158 | 6.128 |
| 12387.57637 | 6.158 |
| 12396.58444 | 6.187 |
| 12406.23266 | 6.203 |
| 12415.87748 | 6.234 |
| 12424.87624 | 6.254 |
| 12434.51448 | 6.277 |
| 12444.14931 | 6.264 |
| 12453.13874 | 6.287 |
| 12462.76697 | 6.283 |
| 12472.39178 | 6.323 |
| 12481.37186 | 6.331 |
| 12490.99006 | 6.337 |
| 12500.60483 | 6.339 |
| 12509.57553 | 6.362 |
| 12519.18368 | 6.355 |
| 12528.78839 | 6.348 |
| 12538.38967 | 6.355 |
| 12547.34777 | 6.369 |
| 12556.9424 | 6.349 |
| 12566.53359 | 6.325 |
| 12576.12134 | 6.267 |
| 12585.06679 | 6.256 |
| 12594.64786 | 6.245 |
| 12604.22549 | 6.219 |
| 12613.79965 | 6.184 |
| 12622.73243 | 6.151 |
| 12632.29991 | 6.112 |
| 12641.86392 | 6.062 |
| 12651.42447 | 6.04 |
| 12660.98156 | 5.989 |
| 12669.89837 | 5.953 |
| 12679.44874 | 5.907 |
| 12688.99563 | 5.853 |
| 12698.53904 | 5.804 |
| 12708.07898 | 5.783 |
| 12716.97977 | 5.71 |
| 12726.51297 | 5.653 |
| 12736.04267 | 5.599 |
| 12745.56889 | 5.562 |
| 12755.09161 | 5.515 |
| 12764.61083 | 5.48 |
| 12773.49228 | 5.444 |
| 12783.00474 | 5.414 |
| 12792.51369 | 5.379 |
| 12802.01913 | 5.334 |
| 12811.52106 | 5.3 |
| 12821.01949 | 5.258 |
| 12830.51439 | 5.25 |
| 12840.00578 | 5.227 |
| 12849.49365 | 5.187 |
| 12858.34582 | 5.148 |
| 12867.82687 | 5.116 |
| 12877.3044 | 5.074 |
| 12886.7784 | 5.049 |
| 12896.24886 | 5.009 |
| 12905.71579 | 5.008 |
| 12915.17918 | 4.972 |
| 12924.63903 | 4.959 |
| 12934.09534 | 4.949 |
| 12943.5481 | 4.966 |
| 12952.99731 | 4.961 |
| 12962.44297 | 4.969 |
| 12971.88508 | 4.918 |
| 12981.32363 | 4.889 |
| 12990.75862 | 4.879 |
| 13000.19005 | 4.886 |
| 13009.61792 | 4.866 |
| 13019.04222 | 4.84 |
| 13028.46295 | 4.818 |
| 13037.88011 | 4.774 |
| 13047.29369 | 4.738 |
| 13056.7037 | 4.694 |
| 13066.11013 | 4.669 |
| 13075.51297 | 4.645 |
| 13084.91223 | 4.619 |
| 13094.30791 | 4.57 |
| 13103.69999 | 4.564 |
| 13113.08848 | 4.541 |
| 13122.47338 | 4.518 |
| 13131.85468 | 4.48 |
| 13141.23238 | 4.445 |
| 13150.60647 | 4.391 |
| 13159.97696 | 4.358 |
| 13169.96818 | 4.317 |
| 13179.33121 | 4.277 |
| 13188.69062 | 4.231 |
| 13198.04643 | 4.185 |
| 13207.39861 | 4.156 |
| 13216.74717 | 4.124 |
| 13226.09211 | 4.071 |
| 13235.43343 | 4.076 |
| 13244.77111 | 4.034 |
| 13254.72731 | 3.992 |
| 13264.05749 | 3.971 |
| 13273.38403 | 3.95 |
| 13282.70693 | 3.92 |
| 13292.02619 | 3.866 |
| 13301.34181 | 3.842 |
| 13311.27445 | 3.76 |
| 13320.58252 | 3.695 |
| 13329.88695 | 3.613 |
| 13339.18772 | 3.539 |
| 13348.48484 | 3.49 |
| 13358.39772 | 3.451 |
| 13367.68727 | 3.388 |
| 13376.97316 | 3.326 |
| 13386.25537 | 3.252 |
| 13396.15236 | 3.214 |
| 13405.42699 | 3.175 |
| 13414.69794 | 3.141 |
| 13423.96522 | 3.111 |
| 13433.84626 | 3.04 |
| 13443.10592 | 2.99 |
| 13452.3619 | 2.931 |
| 13461.6142 | 2.867 |
| 13471.47924 | 2.823 |
| 13480.72391 | 2.79 |
| 13489.96488 | 2.722 |
| 13499.81783 | 2.707 |
| 13509.05115 | 2.665 |
| 13518.28077 | 2.598 |
| 13528.12161 | 2.594 |
| 13537.34357 | 2.574 |
| 13546.56182 | 2.542 |
| 13556.39052 | 2.52 |
| 13565.60108 | 2.516 |
| 13574.80793 | 2.529 |
| 13584.62447 | 2.553 |
| 13593.82362 | 2.548 |
| 13603.01905 | 2.521 |
| 13612.82339 | 2.561 |
| 13622.01111 | 2.582 |
| 13631.80722 | 2.623 |
| 13640.98722 | 2.645 |
| 13650.16348 | 2.68 |
| 13659.94736 | 2.681 |
| 13669.11588 | 2.675 |
| 13678.8915 | 2.696 |
| 13688.05227 | 2.746 |
| 13697.81963 | 2.825 |
| 13706.97264 | 2.871 |
| 13716.1219 | 2.925 |
| 13725.87696 | 3.014 |
| 13735.01844 | 3.085 |
| 13744.7652 | 3.161 |
| 13753.8989 | 3.291 |
| 13763.63735 | 3.388 |
| 13772.76325 | 3.489 |
| 13782.49339 | 3.577 |
| 13791.61148 | 3.676 |
| 13801.33328 | 3.787 |
| 13810.44356 | 3.91 |
| 13820.15702 | 4.07 |
| 13829.25947 | 4.256 |
| 13838.96457 | 4.456 |
| 13848.05918 | 4.655 |
| 13857.75591 | 4.883 |
| 13867.44833 | 5.095 |
| 13876.53104 | 5.319 |
| 13886.21506 | 5.498 |
| 13895.28991 | 5.736 |
| 13904.96554 | 6.002 |
| 13914.03251 | 6.215 |
| 13923.69974 | 6.463 |
| 13933.36262 | 6.699 |
| 13942.41763 | 6.976 |
| 13952.07209 | 7.262 |
| 13961.72219 | 7.562 |
| 13970.76522 | 7.839 |
| 13980.40688 | 8.12 |
| 13989.44199 | 8.438 |
| 13999.0752 | 8.705 |
| 14008.70405 | 8.961 |
| 14017.72713 | 9.222 |
| 14027.34751 | 9.585 |
| 14036.96352 | 9.903 |
| 14045.97454 | 10.229 |
| 14055.58206 | 10.555 |
| 14065.1852 | 10.918 |
| 14074.78394 | 11.211 |
| 14083.77878 | 11.51 |
| 14093.36902 | 11.805 |
| 14102.95486 | 12.098 |
| 14112.5363 | 12.375 |
| 14121.51491 | 12.671 |
| 14131.08782 | 12.995 |
| 14140.65632 | 13.261 |
| 14150.22041 | 13.541 |
| 14159.18274 | 13.824 |
| 14168.73828 | 14.08 |
| 14178.2894 | 14.334 |
| 14187.83609 | 14.529 |
| 14197.37836 | 14.761 |
| 14206.32022 | 14.982 |
| 14215.8539 | 15.181 |
| 14225.38316 | 15.331 |
| 14234.90797 | 15.503 |
| 14244.42835 | 15.589 |
| 14253.34966 | 15.732 |
| 14262.86143 | 15.892 |
| 14272.36874 | 16.051 |
| 14281.8716 | 16.172 |
| 14291.37001 | 16.277 |
| 14300.86396 | 16.342 |
| 14310.35345 | 16.382 |
| 14319.83847 | 16.467 |
| 14329.31903 | 16.525 |
| 14338.203 | 16.572 |
| 14347.67489 | 16.6 |
| 14357.14231 | 16.632 |
| 14366.60525 | 16.671 |
| 14376.06371 | 16.616 |
| 14385.51769 | 16.62 |
| 14394.96718 | 16.647 |
| 14404.41218 | 16.578 |
| 14413.85268 | 16.512 |
| 14423.28869 | 16.439 |
| 14432.7202 | 16.361 |
| 14442.14721 | 16.313 |
| 14451.56971 | 16.238 |
| 14460.98771 | 16.218 |
| 14470.40119 | 16.193 |
| 14479.81016 | 16.199 |
| 14489.21462 | 16.136 |
| 14498.61455 | 16.118 |
| 14508.00997 | 16.066 |
| 14517.40085 | 15.963 |
| 14526.78721 | 15.891 |
| 14536.16904 | 15.904 |
| 14546.13226 | 15.805 |
| 14555.50473 | 15.762 |
| 14564.87267 | 15.694 |
| 14574.23605 | 15.646 |
| 14583.5949 | 15.553 |
| 14592.94919 | 15.48 |
| 14602.29893 | 15.485 |
| 14611.64412 | 15.409 |
| 14620.98475 | 15.376 |
| 14630.90417 | 15.382 |
| 14640.23539 | 15.377 |
| 14649.56204 | 15.271 |
| 14658.88412 | 15.189 |
| 14668.20163 | 15.161 |
| 14678.09647 | 15.16 |
| 14687.40454 | 15.171 |
| 14696.70803 | 15.188 |
| 14706.00694 | 15.164 |
| 14715.30125 | 15.093 |
| 14725.17144 | 15.037 |
| 14734.45628 | 14.955 |
| 14743.73653 | 14.915 |
| 14753.01219 | 14.84 |
| 14762.86252 | 14.804 |
| 14772.12868 | 14.769 |
| 14781.39023 | 14.658 |
| 14790.64717 | 14.685 |
| 14800.47761 | 14.681 |
| 14809.72503 | 14.705 |
| 14818.96783 | 14.657 |
| 14828.78324 | 14.551 |
| 14838.01651 | 14.447 |
| 14847.24514 | 14.318 |
| 14857.04549 | 14.321 |
| 14866.26457 | 14.267 |
| 14875.47902 | 14.287 |
| 14885.26428 | 14.199 |
| 14894.46915 | 14.191 |
| 14904.24423 | 14.136 |
| 14913.43951 | 14.114 |
| 14922.63015 | 14.076 |
| 14932.39009 | 14.06 |
| 14941.57112 | 14.024 |
| 14951.32086 | 14.015 |
| 14960.49227 | 14.002 |
| 14970.23178 | 13.994 |
| 14979.39357 | 14.063 |
| 14989.12284 | 13.985 |
| 14998.27499 | 14.002 |
| 15007.99401 | 13.906 |
| 15017.13651 | 13.89 |
| 15026.84527 | 13.758 |
| 15035.9781 | 13.742 |
| 15045.67659 | 13.747 |
| 15054.79974 | 13.745 |
| 15064.48794 | 13.704 |
| 15073.6014 | 13.597 |
| 15083.27931 | 13.534 |
| 15092.38307 | 13.459 |
| 15102.05066 | 13.458 |
| 15111.14471 | 13.425 |
| 15120.80197 | 13.365 |
| 15130.45391 | 13.334 |
| 15139.53321 | 13.267 |
| 15149.17481 | 13.328 |
| 15158.24437 | 13.312 |
| 15167.87561 | 13.251 |
| 15177.5015 | 13.215 |
| 15186.55628 | 13.207 |
| 15196.17179 | 13.101 |
| 15205.78196 | 13.111 |
| 15214.82193 | 13.137 |
| 15224.42169 | 13.133 |
| 15234.0161 | 13.183 |
| 15243.60514 | 13.12 |
| 15252.62521 | 13.057 |
| 15262.20383 | 13.001 |
| 15271.77707 | 13.019 |
| 15280.78227 | 12.867 |
| 15290.34507 | 12.858 |
| 15299.90249 | 12.795 |
| 15309.45452 | 12.654 |
| 15319.00116 | 12.606 |
| 15327.9813 | 12.579 |
| 15337.51746 | 12.527 |
| 15347.04822 | 12.443 |
| 15356.57358 | 12.407 |
| 15366.09353 | 12.252 |
| 15375.04854 | 12.24 |
| 15384.55799 | 12.183 |
| 15394.06201 | 12.191 |
| 15403.56062 | 12.147 |
| 15413.0538 | 12.155 |
| 15422.54155 | 12.084 |
| 15432.02388 | 12.01 |
| 15441.50077 | 11.832 |
| 15450.97222 | 11.749 |
| 15459.88155 | 11.7 |
| 15469.34244 | 11.625 |
| 15478.79788 | 11.57 |
| 15488.24787 | 11.458 |
| 15497.6924 | 11.385 |
| 15507.13148 | 11.342 |
| 15516.56509 | 11.214 |
| 15525.99325 | 11.209 |
| 15535.41593 | 11.085 |
| 15544.83315 | 11.027 |
| 15554.24489 | 11.018 |
| 15563.65115 | 10.995 |
| 15573.05193 | 10.825 |
| 15582.44723 | 10.71 |
| 15592.38921 | 10.622 |
| 15601.77321 | 10.577 |
| 15611.15172 | 10.57 |
| 15620.52472 | 10.366 |
| 15629.89223 | 10.244 |
| 15639.25423 | 10.156 |
| 15648.61073 | 9.984 |
| 15657.96171 | 9.809 |
| 15667.30718 | 9.764 |
| 15677.19638 | 9.619 |
| 15686.53048 | 9.465 |
| 15695.85907 | 9.368 |
| 15705.18213 | 9.246 |
| 15714.49966 | 9.057 |
| 15723.81165 | 8.884 |
| 15733.66537 | 8.751 |
| 15742.96596 | 8.547 |
| 15752.26101 | 8.467 |
| 15761.55051 | 8.16 |
| 15771.3804 | 7.897 |
| 15780.65847 | 7.626 |
| 15789.93098 | 7.376 |
| 15799.74288 | 7.121 |
| 15809.00394 | 6.912 |
| 15818.25943 | 6.657 |
| 15827.50936 | 6.475 |
| 15837.29732 | 6.205 |
| 15846.53577 | 5.991 |
| 15856.31157 | 5.805 |
| 15865.53852 | 5.585 |
| 15874.75989 | 5.44 |
| 15884.5176 | 5.19 |
| 15893.72745 | 4.971 |
| 15902.93171 | 4.763 |
| 15912.67129 | 4.557 |
| 15921.86402 | 4.391 |
| 15931.59138 | 4.165 |
| 15940.77256 | 3.984 |
| 15950.48768 | 3.749 |
| 15959.6573 | 3.581 |
| 15969.36018 | 3.424 |
| 15978.51823 | 3.23 |
| 15988.20885 | 3.018 |
| 15997.3553 | 2.768 |
| 16007.03364 | 2.732 |
| 16016.1685 | 2.526 |
| 16025.83455 | 2.336 |
| 16034.95779 | 2.244 |
| 16044.61153 | 2.127 |
| 16053.72315 | 1.997 |
| 16063.36457 | 1.861 |
| 16072.99966 | 1.75 |
| 16082.09363 | 1.718 |
| 16091.71637 | 1.606 |
| 16101.33276 | 1.514 |
| 16110.40907 | 1.491 |
| 16120.0131 | 1.413 |
| 16129.61076 | 1.384 |
| 16138.66937 | 1.248 |
| 16148.25465 | 1.24 |
| 16157.83355 | 1.23 |
| 16166.87444 | 1.217 |
| 16176.44093 | 1.169 |
| 16186.00104 | 1.232 |
| 16195.55476 | 1.245 |
| 16204.57185 | 1.236 |
| 16214.11313 | 1.245 |
| 16223.64801 | 1.256 |
| 16233.17649 | 1.299 |
| 16242.69856 | 1.257 |
| 16251.68574 | 1.297 |
| 16261.19534 | 1.35 |
| 16270.69851 | 1.37 |
| 16280.19527 | 1.384 |
| 16289.68559 | 1.477 |
| 16299.16949 | 1.507 |
| 16308.64695 | 1.46 |
| 16318.11797 | 1.458 |
| 16327.58256 | 1.431 |
| 16336.51541 | 1.514 |
| 16345.96745 | 1.586 |
| 16355.41304 | 1.6 |
| 16364.85218 | 1.654 |
| 16374.28485 | 1.652 |
| 16383.71106 | 1.67 |
| 16393.1308 | 1.619 |
| 16402.54407 | 1.686 |
| 16411.95086 | 1.772 |
| 16421.35118 | 1.766 |
| 16431.2667 | 1.757 |
| 16440.65368 | 1.785 |
| 16450.03417 | 1.797 |
| 16459.40817 | 1.809 |
| 16468.77568 | 1.727 |
| 16478.13668 | 1.7 |
| 16487.49117 | 1.676 |
| 16496.83916 | 1.602 |
| 16506.18063 | 1.597 |
| 16516.034 | 1.556 |
| 16525.36208 | 1.568 |
| 16534.68363 | 1.567 |
| 16543.99865 | 1.575 |
| 16553.30714 | 1.597 |
| 16563.12568 | 1.579 |
| 16572.42074 | 1.514 |
| 16581.70925 | 1.511 |
| 16591.50669 | 1.519 |
| 16600.78174 | 1.516 |
| 16610.05024 | 1.529 |
| 16619.31218 | 1.523 |
| 16629.08156 | 1.523 |
| 16638.33001 | 1.498 |
| 16647.57189 | 1.41 |
| 16657.32008 | 1.427 |
| 16665.67797 | 1.448 |
| 16676.59721 | 1.383 |
| 16684.78643 | 1.324 |
| 16695.7051 | 1.364 |
| 16703.8939 | 1.362 |
| 16714.812 | 1.374 |
| 16723.00036 | 1.283 |
| 16733.9179 | 1.2 |
| 16742.10583 | 1.195 |
| 16750.29359 | 1.171 |
| 16761.2103 | 1.187 |
| 16769.39763 | 1.19 |
| 16780.31377 | 1.215 |
| 16788.50067 | 1.173 |
| 16799.41624 | 1.106 |
| 16807.60271 | 1.112 |
| 16818.51771 | 1.116 |
| 16826.70374 | 1.068 |
| 16837.61817 | 1.122 |
| 16845.80377 | 1.121 |
| 16853.98919 | 1.098 |
| 16864.90279 | 1.12 |
| 16873.08778 | 1.161 |
| 16884.00081 | 1.193 |
| 16892.18537 | 1.244 |
| 16903.09782 | 1.271 |
| 16911.28194 | 1.275 |
| 16922.19382 | 1.304 |
| 16930.37751 | 1.346 |
| 16941.28881 | 1.366 |
| 16949.47207 | 1.416 |
| 16957.65514 | 1.443 |
| 16968.56561 | 1.469 |
| 16976.74825 | 1.525 |
| 16987.65814 | 1.558 |
| 16995.84034 | 1.589 |
| 17006.74966 | 1.602 |
| 17014.93143 | 1.629 |
| 17025.84016 | 1.666 |
| 17034.02149 | 1.684 |
| 17044.92964 | 1.704 |
| 17053.11054 | 1.733 |
| 17061.29125 | 1.747 |
| 17072.19857 | 1.767 |
| 17080.37884 | 1.78 |
| 17091.28558 | 1.802 |
| 17099.46542 | 1.833 |
| 17110.37157 | 1.863 |
| 17118.55097 | 1.893 |
| 17129.45654 | 1.933 |
| 17137.6355 | 1.95 |
| 17148.54049 | 1.96 |
| 17156.71901 | 1.957 |
| 17164.89734 | 1.965 |
| 17175.80149 | 1.985 |
| 17183.97939 | 2.009 |
| 17194.88295 | 2.021 |
| 17203.0604 | 2.061 |
| 17213.96338 | 2.092 |
| 17222.1404 | 2.07 |
| 17233.04279 | 2.094 |
| 17241.21936 | 2.126 |
| 17252.12116 | 2.155 |
| 17260.29729 | 2.155 |
| 17271.19851 | 2.173 |
| 17279.3742 | 2.163 |
| 17287.5497 | 2.2 |
| 17298.45007 | 2.219 |
| 17306.62512 | 2.23 |
| 17317.52491 | 2.236 |
| 17325.69952 | 2.259 |
| 17336.59871 | 2.261 |
| 17344.77288 | 2.286 |
| 17355.67148 | 2.289 |
| 17363.84521 | 2.301 |
| 17374.74321 | 2.308 |
| 17382.9165 | 2.31 |
| 17393.81391 | 2.328 |
| 17401.98675 | 2.354 |
| 17410.15939 | 2.359 |
| 17421.05596 | 2.347 |
| 17429.22816 | 2.352 |
| 17440.12413 | 2.322 |
| 17448.29589 | 2.331 |
| 17459.19126 | 2.36 |
| 17467.36257 | 2.35 |
| 17478.25735 | 2.349 |
| 17486.42821 | 2.339 |
| 17497.32239 | 2.32 |
| 17505.49281 | 2.315 |
| 17513.66303 | 2.324 |
| 17524.55636 | 2.329 |
| 17532.72613 | 2.336 |
| 17543.61887 | 2.356 |
| 17551.78819 | 2.351 |
| 17562.68032 | 2.364 |
| 17570.8492 | 2.375 |
| 17581.74073 | 2.374 |
| 17589.90916 | 2.352 |
| 17600.80009 | 2.336 |
| 17608.96807 | 2.347 |
| 17619.8584 | 2.344 |
| 17628.02593 | 2.341 |
| 17636.19326 | 2.338 |
| 17647.08273 | 2.35 |
| 17655.24961 | 2.335 |
| 17666.13849 | 2.343 |
| 17674.30491 | 2.328 |
| 17685.19318 | 2.337 |
| 17693.35916 | 2.34 |
| 17704.24682 | 2.35 |
| 17712.41235 | 2.329 |
| 17723.29941 | 2.323 |
| 17731.46448 | 2.313 |
| 17742.35094 | 2.302 |
| 17750.51555 | 2.273 |
| 17761.4014 | 2.278 |
| 17769.56556 | 2.287 |
| 17777.72953 | 2.272 |
| 17788.61452 | 2.27 |
| 17796.77803 | 2.276 |
| 17807.66241 | 2.27 |
| 17815.82546 | 2.286 |
| 17826.70923 | 2.313 |
| 17834.87183 | 2.326 |
| 17845.75499 | 2.303 |
| 17853.91714 | 2.309 |
| 17864.79969 | 2.337 |
| 17872.96138 | 2.348 |
| 17883.84332 | 2.353 |
| 17892.00455 | 2.392 |
| 17900.16558 | 2.402 |
| 17911.04665 | 2.41 |
| 17919.20723 | 2.435 |
| 17930.08769 | 2.448 |
| 17938.2478 | 2.466 |
| 17949.12765 | 2.459 |
| 17957.28731 | 2.47 |
| 17968.16655 | 2.496 |
| 17976.32574 | 2.522 |
| 17987.20437 | 2.551 |
| 17995.3631 | 2.568 |
| 18006.24111 | 2.596 |
| 18014.39939 | 2.612 |
| 18025.27678 | 2.605 |
| 18033.4346 | 2.625 |
| 18041.59222 | 2.658 |
| 18052.46873 | 2.685 |
| 18060.62589 | 2.704 |
| 18071.50179 | 2.714 |
| 18079.65848 | 2.709 |
| 18090.53376 | 2.708 |
| 18098.68999 | 2.726 |
| 18109.56466 | 2.763 |
| 18117.72043 | 2.785 |
| 18128.59448 | 2.814 |
| 18136.74978 | 2.844 |
| 18147.62321 | 2.844 |
| 18155.77805 | 2.869 |
| 18166.65086 | 2.91 |
| 18174.80523 | 2.938 |
| 18182.95941 | 2.946 |
| 18193.83133 | 2.996 |
| 18201.98504 | 2.998 |
| 18212.85635 | 2.994 |
| 18221.00959 | 3.021 |
| 18231.88027 | 3.055 |
| 18240.03305 | 3.075 |
| 18250.90311 | 3.081 |
| 18259.05542 | 3.094 |
| 18269.92486 | 3.137 |
| 18278.0767 | 3.146 |
| 18288.94551 | 3.165 |
| 18297.09689 | 3.195 |
| 18307.96508 | 3.207 |
| 18316.11598 | 3.226 |
| 18324.26669 | 3.26 |
| 18335.13399 | 3.286 |
| 18343.28423 | 3.315 |
| 18354.1509 | 3.333 |
| 18362.30066 | 3.373 |
| 18373.16671 | 3.407 |
| 18381.31601 | 3.426 |
| 18392.18142 | 3.435 |
| 18400.33025 | 3.468 |
| 18411.19504 | 3.51 |
| 18419.3434 | 3.537 |
| 18430.20756 | 3.571 |
| 18438.35544 | 3.595 |
| 18449.21898 | 3.625 |
| 18457.36639 | 3.649 |
| 18468.22929 | 3.695 |
| 18476.37623 | 3.729 |
| 18484.52297 | 3.771 |
| 18495.38498 | 3.779 |
| 18503.53124 | 3.822 |
| 18514.39261 | 3.858 |
| 18522.5384 | 3.866 |
| 18533.39914 | 3.924 |
| 18541.54446 | 3.953 |
| 18552.40457 | 3.968 |
| 18560.54941 | 3.991 |
| 18571.40888 | 4.035 |
| 18579.55325 | 4.054 |
| 18590.41209 | 4.085 |
| 18598.55598 | 4.137 |
| 18609.41419 | 4.156 |
| 18617.55761 | 4.177 |
| 18628.41518 | 4.21 |
| 18636.55812 | 4.243 |
| 18647.41505 | 4.284 |
| 18655.55751 | 4.309 |
| 18663.69977 | 4.323 |
| 18674.5558 | 4.338 |
| 18682.69758 | 4.347 |
| 18693.55297 | 4.367 |
| 18701.69427 | 4.392 |
| 18712.54902 | 4.403 |
| 18720.68984 | 4.438 |
| 18731.54396 | 4.459 |
| 18739.6843 | 4.456 |
| 18750.53777 | 4.48 |
| 18758.67764 | 4.501 |
| 18769.53047 | 4.513 |
| 18777.66986 | 4.543 |
| 18788.52205 | 4.565 |
| 18796.66095 | 4.571 |
| 18807.5125 | 4.59 |
| 18815.65093 | 4.599 |
| 18826.50184 | 4.604 |
| 18834.63978 | 4.607 |
| 18842.77751 | 4.621 |
| 18853.6275 | 4.627 |
| 18861.76476 | 4.656 |
| 18872.6141 | 4.665 |
| 18880.75087 | 4.697 |
| 18891.59958 | 4.707 |
| 18899.73586 | 4.703 |
| 18910.58392 | 4.734 |
| 18918.71973 | 4.72 |
| 18929.56714 | 4.715 |
| 18937.70246 | 4.726 |
| 18948.54923 | 4.738 |
| 18956.68406 | 4.74 |
| 18967.53018 | 4.756 |
| 18975.66453 | 4.767 |
| 18986.51001 | 4.769 |
| 18994.64387 | 4.786 |
| 19005.48869 | 4.828 |
| 19013.62207 | 4.832 |
| 19024.46625 | 4.864 |
| 19032.59914 | 4.895 |
| 19040.73182 | 4.902 |
| 19051.57507 | 4.913 |
| 19059.70727 | 4.943 |
| 19070.54987 | 4.959 |
| 19078.68157 | 4.978 |
| 19089.52352 | 4.979 |
| 19097.65474 | 4.979 |
| 19108.49604 | 4.971 |
| 19116.62677 | 4.972 |
| 19127.46741 | 5.007 |
| 19135.59765 | 5.017 |
| 19146.43764 | 5.011 |
| 19154.56739 | 5.024 |
| 19165.40673 | 5.025 |
| 19173.53599 | 5.021 |
| 19184.37468 | 5.041 |
| 19192.50345 | 5.037 |
| 19203.34148 | 5.039 |
| 19211.46976 | 5.046 |
| 19222.30713 | 5.064 |
| 19230.43492 | 5.075 |
| 19241.27164 | 5.08 |
| 19249.39893 | 5.077 |
| 19257.52602 | 5.093 |
| 19268.3618 | 5.094 |
| 19276.48839 | 5.106 |
| 19287.32351 | 5.132 |
| 19295.44961 | 5.126 |
| 19306.28407 | 5.142 |
| 19314.40968 | 5.164 |
| 19325.24348 | 5.173 |
| 19333.36859 | 5.18 |
| 19344.20174 | 5.171 |
| 19352.32635 | 5.176 |
| 19363.15884 | 5.176 |
| 19371.28296 | 5.179 |
| 19382.11479 | 5.185 |
| 19390.23841 | 5.177 |
| 19401.06957 | 5.193 |
| 19409.1927 | 5.185 |
| 19420.0232 | 5.184 |
| 19428.14583 | 5.198 |
| 19438.97567 | 5.221 |
| 19447.0978 | 5.233 |
| 19457.92698 | 5.253 |
| 19466.04862 | 5.277 |
| 19476.87713 | 5.298 |
| 19484.99827 | 5.328 |
| 19493.11919 | 5.338 |
| 19503.94675 | 5.362 |
| 19512.06717 | 5.38 |
| 19522.89407 | 5.38 |
| 19531.014 | 5.411 |
| 19541.84023 | 5.441 |
| 19549.95965 | 5.451 |
| 19560.78522 | 5.484 |
| 19568.90414 | 5.516 |
| 19579.72904 | 5.538 |
| 19587.84746 | 5.559 |
| 19598.67169 | 5.568 |
| 19606.78961 | 5.584 |
| 19617.61317 | 5.601 |
| 19625.73059 | 5.628 |
| 19636.55348 | 5.658 |
| 19644.6704 | 5.659 |
| 19655.49262 | 5.677 |
| 19663.60904 | 5.681 |
| 19674.43059 | 5.689 |
| 19682.5465 | 5.725 |
| 19693.36738 | 5.747 |
| 19701.48279 | 5.762 |
| 19712.30299 | 5.781 |
| 19720.4179 | 5.801 |
| 19731.23743 | 5.845 |
| 19739.35183 | 5.869 |
| 19750.17069 | 5.912 |
| 19758.28458 | 5.927 |
| 19769.10277 | 5.939 |
| 19777.21616 | 5.961 |
| 19785.32933 | 5.979 |
| 19796.14655 | 5.988 |
| 19804.25922 | 5.981 |
| 19815.07576 | 6.004 |
| 19823.18792 | 6.006 |
| 19834.00379 | 6.016 |
| 19842.11544 | 6.038 |
| 19852.93064 | 6.046 |
| 19861.04178 | 6.072 |
| 19871.8563 | 6.093 |
| 19879.96693 | 6.136 |
| 19890.78077 | 6.132 |
| 19898.89089 | 6.142 |
| 19909.70405 | 6.165 |
| 19917.81367 | 6.189 |
| 19928.62615 | 6.19 |
| 19936.73526 | 6.245 |
| 19947.54706 | 6.267 |
| 19955.65565 | 6.278 |
| 19966.46677 | 6.304 |
| 19974.57486 | 6.314 |
| 19985.3853 | 6.354 |
| 19993.49287 | 6.378 |
| 20004.30263 | 6.419 |
| 20012.40969 | 6.439 |
| 20023.21876 | 6.46 |
| 20031.32531 | 6.497 |
| 20042.1337 | 6.547 |
| 20050.23974 | 6.596 |
| 20061.04745 | 6.633 |
| 20069.15297 | 6.662 |
| 20079.95999 | 6.687 |
| 20088.065 | 6.72 |
| 20098.87134 | 6.739 |
| 20106.97584 | 6.768 |
| 20117.78149 | 6.797 |
| 20125.88547 | 6.832 |
| 20136.69043 | 6.861 |
| 20144.7939 | 6.903 |
| 20152.89715 | 6.933 |
| 20163.70113 | 6.965 |
| 20171.80386 | 6.987 |
| 20182.60715 | 7.016 |
| 20190.70937 | 7.063 |
| 20201.51197 | 7.091 |
| 20209.61367 | 7.15 |
| 20220.41559 | 7.183 |
| 20228.51677 | 7.218 |
| 20239.31799 | 7.247 |
| 20247.41865 | 7.292 |
| 20258.21919 | 7.3 |
| 20266.31933 | 7.312 |
| 20277.11918 | 7.355 |
| 20285.2188 | 7.369 |
| 20296.01796 | 7.408 |
| 20304.11706 | 7.44 |
| 20314.91552 | 7.478 |
| 20323.01411 | 7.463 |
| 20333.81187 | 7.484 |
| 20341.90994 | 7.523 |
| 20352.70701 | 7.567 |
| 20360.80456 | 7.599 |
| 20371.60094 | 7.634 |
| 20379.69796 | 7.664 |
| 20390.49364 | 7.666 |
| 20398.59015 | 7.692 |
| 20409.38513 | 7.723 |
| 20417.48111 | 7.735 |
| 20428.27541 | 7.731 |
| 20436.37086 | 7.728 |
| 20447.16446 | 7.763 |
| 20455.25939 | 7.78 |
| 20466.05229 | 7.816 |
| 20474.1467 | 7.83 |
| 20484.9389 | 7.864 |
| 20493.03278 | 7.926 |
| 20503.82428 | 7.951 |
| 20511.91765 | 7.961 |
| 20522.70844 | 7.97 |
| 20530.80128 | 8.005 |
| 20541.59138 | 8.045 |
| 20549.68369 | 8.069 |
| 20560.47309 | 8.084 |
| 20568.56488 | 8.115 |
| 20579.35357 | 8.168 |
| 20587.44483 | 8.206 |
| 20598.23283 | 8.21 |
| 20606.32356 | 8.23 |
| 20617.11085 | 8.258 |
| 20625.20106 | 8.284 |
| 20635.98764 | 8.317 |
| 20644.07732 | 8.353 |
| 20654.86321 | 8.39 |
| 20662.95235 | 8.45 |
| 20673.73753 | 8.475 |
| 20681.82615 | 8.501 |
| 20692.61063 | 8.545 |
| 20700.69872 | 8.583 |
| 20711.48248 | 8.638 |
| 20719.57005 | 8.665 |
| 20730.35311 | 8.701 |
| 20738.44014 | 8.725 |
| 20749.22249 | 8.776 |
| 20757.30899 | 8.807 |
| 20768.09063 | 8.832 |
| 20776.1766 | 8.905 |
| 20786.95754 | 8.956 |
| 20795.04298 | 8.973 |
| 20805.8232 | 9.052 |
| 20813.90811 | 9.105 |
| 20824.68763 | 9.147 |
| 20832.772 | 9.159 |
| 20843.5508 | 9.214 |
| 20851.63464 | 9.248 |
| 20862.41274 | 9.3 |
| 20870.49604 | 9.36 |
| 20881.27343 | 9.358 |
| 20889.3562 | 9.412 |
| 20900.13287 | 9.48 |
| 20908.2151 | 9.529 |
| 20918.99106 | 9.552 |
| 20927.07276 | 9.608 |
| 20937.84801 | 9.645 |
| 20945.92917 | 9.696 |
| 20956.7037 | 9.756 |
| 20964.78433 | 9.748 |
| 20975.55814 | 9.765 |
| 20983.63824 | 9.848 |
| 20994.41133 | 9.895 |
| 21002.49089 | 9.933 |
| 21013.26327 | 9.999 |
| 21021.34229 | 10.041 |
| 21032.11395 | 10.104 |
| 21040.19243 | 10.175 |
| 21050.96338 | 10.208 |
| 21059.04132 | 10.295 |
| 21069.81155 | 10.34 |
| 21077.88895 | 10.36 |
| 21088.65846 | 10.412 |
| 21096.73533 | 10.454 |
| 21107.50412 | 10.533 |
| 21115.58044 | 10.556 |
| 21126.34851 | 10.579 |
| 21134.42429 | 10.605 |
| 21145.19164 | 10.641 |
| 21153.26688 | 10.669 |
| 21164.03351 | 10.693 |
| 21172.10821 | 10.742 |
| 21182.87412 | 10.784 |
| 21190.94828 | 10.841 |
| 21201.71346 | 10.898 |
| 21209.78707 | 10.929 |
| 21220.55153 | 10.98 |
| 21228.62461 | 11.017 |
| 21239.38834 | 11.051 |
| 21247.46087 | 11.102 |
| 21258.22388 | 11.104 |
| 21266.29587 | 11.157 |
| 21277.05815 | 11.167 |
| 21285.12959 | 11.18 |
| 21295.89115 | 11.239 |
| 21303.96205 | 11.313 |
| 21314.72288 | 11.319 |
| 21322.79323 | 11.382 |
| 21333.55334 | 11.467 |
| 21341.62314 | 11.497 |
| 21352.38252 | 11.593 |
| 21360.45178 | 11.665 |
| 21371.21043 | 11.667 |
| 21379.27914 | 11.724 |
| 21390.03706 | 11.751 |
| 21398.10523 | 11.806 |
| 21408.86242 | 11.844 |
| 21416.93003 | 11.899 |
| 21427.68649 | 11.932 |
| 21435.75356 | 11.95 |
| 21446.50929 | 12.002 |
| 21454.57581 | 12.047 |
| 21465.33081 | 12.103 |
| 21473.39678 | 12.138 |
| 21484.15104 | 12.179 |
| 21492.21646 | 12.176 |
| 21502.96999 | 12.234 |
| 21511.03487 | 12.302 |
| 21521.78766 | 12.365 |
| 21529.85198 | 12.418 |
| 21540.60405 | 12.512 |
| 21548.66782 | 12.553 |
| 21559.41914 | 12.573 |
| 21567.48236 | 12.648 |
| 21578.23295 | 12.652 |
| 21586.29562 | 12.672 |
| 21597.04548 | 12.771 |
| 21605.10759 | 12.799 |
| 21615.85671 | 12.878 |
| 21623.91827 | 12.943 |
| 21634.66665 | 12.991 |
| 21642.72766 | 13.059 |
| 21653.4753 | 13.094 |
| 21661.53575 | 13.135 |
| 21672.28266 | 13.204 |
| 21680.34256 | 13.221 |
| 21691.08872 | 13.242 |
| 21699.14807 | 13.309 |
| 21709.89349 | 13.334 |
| 21717.95228 | 13.353 |
| 21728.69696 | 13.38 |
| 21736.7552 | 13.407 |
| 21747.49914 | 13.412 |
| 21755.55681 | 13.484 |
| 21766.30001 | 13.518 |
| 21774.35713 | 13.56 |
| 21785.09959 | 13.547 |
| 21793.15615 | 13.565 |
| 21803.89787 | 13.604 |
| 21811.95387 | 13.666 |
| 21822.69484 | 13.728 |
| 21830.75029 | 13.746 |
| 21841.49051 | 13.764 |
| 21852.23031 | 13.79 |
| 21860.28488 | 13.85 |
| 21871.02393 | 13.905 |
| 21879.07794 | 13.977 |
| 21889.81625 | 14.035 |
| 21897.8697 | 14.087 |
| 21908.60726 | 14.113 |
| 21916.66015 | 14.155 |
| 21927.39696 | 14.202 |
| 21935.44929 | 14.242 |
| 21946.18535 | 14.282 |
| 21954.23712 | 14.317 |
| 21964.97243 | 14.337 |
| 21973.02364 | 14.403 |
| 21983.7582 | 14.404 |
| 21991.80885 | 14.457 |
| 22002.54266 | 14.414 |
| 22010.59274 | 14.416 |
| 22021.3258 | 14.418 |
| 22029.37532 | 14.448 |
| 22040.10763 | 14.5 |
| 22048.15659 | 14.574 |
| 22058.88815 | 14.61 |
| 22066.93654 | 14.689 |
| 22077.66734 | 14.723 |
| 22085.71517 | 14.766 |
| 22096.44522 | 14.798 |
| 22104.49248 | 14.842 |
| 22115.22178 | 14.884 |
| 22123.26847 | 14.907 |
| 22133.99702 | 14.972 |
| 22142.04314 | 14.993 |
| 22152.77094 | 15.074 |
| 22160.8165 | 15.119 |
| 22171.54353 | 15.152 |
| 22179.58852 | 15.204 |
| 22190.3148 | 15.213 |
| 22198.35923 | 15.224 |
| 22209.08475 | 15.265 |
| 22219.80983 | 15.318 |
| 22227.85337 | 15.366 |
| 22238.5777 | 15.427 |
| 22246.62066 | 15.432 |
| 22257.34423 | 15.425 |
| 22265.38662 | 15.456 |
| 22276.10943 | 15.458 |
| 22284.15126 | 15.46 |
| 22294.87331 | 15.494 |
| 22302.91456 | 15.524 |
| 22313.63585 | 15.531 |
| 22321.67653 | 15.578 |
| 22332.39706 | 15.639 |
| 22340.43718 | 15.671 |
| 22351.15694 | 15.726 |
| 22359.19648 | 15.733 |
| 22369.91549 | 15.755 |
| 22377.95445 | 15.79 |
| 22388.67269 | 15.874 |
| 22396.71109 | 15.89 |
| 22407.42857 | 15.917 |
| 22415.46639 | 15.963 |
| 22426.1831 | 15.992 |
| 22434.22035 | 15.979 |
| 22444.93629 | 16.009 |
| 22452.97297 | 16.036 |
| 22463.68815 | 16.092 |
| 22471.72425 | 16.091 |
| 22482.43866 | 16.137 |
| 22493.15264 | 16.151 |
| 22501.18783 | 16.189 |
| 22511.90104 | 16.208 |
| 22519.93566 | 16.228 |
| 22530.6481 | 16.215 |
| 22538.68214 | 16.208 |
| 22549.39381 | 16.256 |
| 22557.42728 | 16.297 |
| 22568.13818 | 16.312 |
| 22576.17107 | 16.36 |
| 22586.8812 | 16.415 |
| 22594.91351 | 16.391 |
| 22605.62287 | 16.435 |
| 22613.65461 | 16.478 |
| 22624.3632 | 16.484 |
| 22632.39435 | 16.536 |
| 22643.10217 | 16.57 |
| 22651.13274 | 16.584 |
| 22661.83979 | 16.617 |
| 22669.86978 | 16.659 |
| 22680.57605 | 16.676 |
| 22688.60547 | 16.727 |
| 22699.31097 | 16.783 |
| 22707.3398 | 16.743 |
| 22718.04452 | 16.744 |
| 22728.7488 | 16.756 |
| 22736.77672 | 16.766 |
| 22747.48023 | 16.796 |
| 22755.50757 | 16.859 |
| 22766.2103 | 16.863 |
| 22774.23705 | 16.892 |
| 22784.939 | 16.958 |
| 22792.96518 | 16.998 |
| 22803.66635 | 17.007 |
| 22811.69194 | 17.015 |
| 22822.39234 | 17.042 |
| 22830.41734 | 17.042 |
| 22841.11696 | 17.046 |
| 22849.14138 | 17.063 |
| 22859.84022 | 17.113 |
| 22867.86406 | 17.127 |
| 22878.56211 | 17.127 |
| 22886.58537 | 17.174 |
| 22897.28264 | 17.216 |
| 22905.30531 | 17.265 |
| 22916.0018 | 17.315 |
| 22926.69785 | 17.344 |
| 22934.7196 | 17.363 |
| 22945.41487 | 17.401 |
| 22953.43602 | 17.43 |
| 22964.13051 | 17.458 |
| 22972.15108 | 17.416 |
| 22982.84478 | 17.518 |
| 22990.86476 | 17.521 |
| 23001.55767 | 17.561 |
| 23009.57707 | 17.605 |
| 23020.2692 | 17.61 |
| 23028.288 | 17.662 |
| 23038.97935 | 17.693 |
| 23046.99756 | 17.716 |
| 23057.68812 | 17.751 |
| 23065.70575 | 17.793 |
| 23076.39552 | 17.811 |
| 23084.41256 | 17.785 |
| 23095.10154 | 17.833 |
| 23105.79008 | 17.855 |
| 23113.80618 | 17.84 |
| 23124.49393 | 17.872 |
| 23132.50944 | 17.883 |
| 23143.1964 | 17.886 |
| 23151.21132 | 17.932 |
| 23161.89749 | 17.946 |
| 23169.91182 | 17.97 |
| 23180.5972 | 17.998 |
| 23188.61094 | 18.028 |
| 23199.29552 | 18.056 |
| 23207.30867 | 18.101 |
| 23217.99246 | 18.138 |
| 23226.00501 | 18.144 |
| 23236.68801 | 18.154 |
| 23244.69997 | 18.162 |
| 23255.38218 | 18.183 |
| 23266.06394 | 18.229 |
| 23274.07496 | 18.225 |
| 23284.75592 | 18.237 |
| 23292.76634 | 18.235 |
| 23303.44651 | 18.265 |
| 23311.45634 | 18.269 |
| 23322.13571 | 18.275 |
| 23330.14494 | 18.293 |
| 23340.82352 | 18.313 |
| 23348.83215 | 18.314 |
| 23359.50993 | 18.36 |
| 23367.51797 | 18.33 |
| 23378.19495 | 18.334 |
| 23386.20239 | 18.323 |
| 23396.87858 | 18.32 |
| 23404.88542 | 18.346 |
| 23415.56081 | 18.356 |
| 23426.23574 | 18.37 |
| 23434.24164 | 18.39 |
| 23444.91577 | 18.394 |
| 23452.92107 | 18.405 |
| 23463.5944 | 18.403 |
| 23471.5991 | 18.438 |
| 23482.27163 | 18.483 |
| 23490.27573 | 18.511 |
| 23500.94746 | 18.57 |
| 23508.95095 | 18.597 |
| 23519.62188 | 18.63 |
| 23527.62477 | 18.653 |
| 23538.2949 | 18.676 |
| 23546.29719 | 18.7 |
| 23556.96651 | 18.724 |
| 23567.63538 | 18.749 |
| 23575.63672 | 18.776 |
| 23586.30478 | 18.805 |
| 23594.30552 | 18.834 |
| 23604.97278 | 18.862 |
| 23612.97291 | 18.892 |
| 23623.63936 | 18.924 |
| 23631.6389 | 18.957 |
| 23642.30454 | 18.989 |
| 23650.30347 | 19.024 |
| 23660.9683 | 19.059 |
| 23668.96663 | 19.095 |
| 23679.63066 | 19.129 |
| 23687.62837 | 19.165 |
| 23698.29159 | 19.2 |
| 23708.95435 | 19.237 |
| 23716.95112 | 19.273 |
| 23727.61307 | 19.311 |
| 23735.60922 | 19.351 |
| 23746.27036 | 19.389 |
| 23754.26591 | 19.427 |
| 23764.92624 | 19.465 |
| 23772.92119 | 19.502 |
| 23783.5807 | 19.541 |
| 23791.57504 | 19.58 |
| 23802.23374 | 19.62 |
| 23810.22747 | 19.659 |
| 23820.88536 | 19.701 |
| 23831.54279 | 19.741 |
| 23839.53556 | 19.782 |
| 23850.19218 | 19.822 |
| 23858.18434 | 19.86 |
| 23868.84014 | 19.896 |
| 23876.83168 | 19.93 |
| 23887.48667 | 19.965 |
| 23895.47761 | 19.998 |
| 23906.13178 | 20.031 |
| 23914.12211 | 20.064 |
| 23924.77546 | 20.097 |
| 23932.76518 | 20.13 |
| 23943.41772 | 20.163 |
| 23954.06979 | 20.196 |
| 23962.05854 | 20.229 |
| 23972.7098 | 20.261 |
| 23980.69793 | 20.292 |
| 23991.34837 | 20.324 |
| 23999.3359 | 20.355 |
| 24009.98552 | 20.385 |
| 24017.97242 | 20.414 |
| 24028.62122 | 20.444 |
| 24036.60752 | 20.473 |
| 24047.2555 | 20.5 |
| 24055.24118 | 20.529 |
| 24065.88834 | 20.557 |
| 24076.53503 | 20.583 |
| 24084.51974 | 20.608 |
| 24095.16561 | 20.632 |
| 24103.1497 | 20.657 |
| 24113.79475 | 20.681 |
| 24121.77823 | 20.704 |
| 24132.42245 | 20.728 |
| 24140.40531 | 20.753 |
| 24151.04871 | 20.777 |
| 24159.03096 | 20.802 |
| 24169.67353 | 20.823 |
| 24180.31564 | 20.843 |
| 24188.29691 | 20.864 |
| 24198.93819 | 20.883 |
| 24206.91884 | 20.9 |
| 24217.5593 | 20.922 |
| 24225.53933 | 20.942 |
| 24236.17896 | 20.964 |
| 24244.15837 | 20.986 |
| 24254.79717 | 21.01 |
| 24262.77596 | 21.036 |
| 24273.41394 | 21.061 |
| 24284.05144 | 21.087 |
| 24292.02925 | 21.111 |
| 24302.66592 | 21.135 |
| 24310.64312 | 21.158 |
| 24321.27896 | 21.18 |
| 24329.25553 | 21.202 |
| 24339.89054 | 21.223 |
| 24347.86649 | 21.243 |
| 24358.50068 | 21.264 |
| 24366.476 | 21.286 |
| 24377.10935 | 21.308 |
| 24387.74223 | 21.33 |
| 24395.71657 | 21.353 |
| 24406.34862 | 21.374 |
| 24414.32234 | 21.393 |
| 24424.95355 | 21.413 |
| 24432.92664 | 21.433 |
| 24443.55702 | 21.451 |
| 24451.52949 | 21.47 |
| 24462.15904 | 21.489 |
| 24470.13088 | 21.509 |
| 24480.75959 | 21.529 |
| 24491.38782 | 21.545 |
| 24499.35868 | 21.56 |
| 24509.98608 | 21.575 |
| 24517.95631 | 21.589 |
| 24528.58287 | 21.602 |
| 24536.55248 | 21.615 |
| 24547.1782 | 21.627 |
| 24555.14718 | 21.641 |
| 24565.77206 | 21.656 |
| 24573.74041 | 21.67 |
| 24584.36446 | 21.684 |
| 24594.98803 | 21.701 |
| 24602.95539 | 21.714 |
| 24613.57812 | 21.726 |
| 24621.54485 | 21.737 |
| 24632.16674 | 21.747 |
| 24640.13284 | 21.755 |
| 24650.75388 | 21.761 |
| 24658.71935 | 21.767 |
| 24669.33956 | 21.77 |
| 24679.95929 | 21.772 |
| 24687.92377 | 21.774 |
| 24698.54265 | 21.778 |
| 24706.5065 | 21.781 |
| 24717.12454 | 21.783 |
| 24725.08775 | 21.786 |
| 24735.70495 | 21.789 |
| 24743.66753 | 21.794 |
| 24754.28388 | 21.797 |
| 24762.24583 | 21.802 |
| 24772.86134 | 21.803 |
| 24783.47637 | 21.805 |
| 24791.43732 | 21.807 |
| 24802.0515 | 21.809 |
| 24810.01182 | 21.81 |
| 24820.62515 | 21.811 |
| 24828.58483 | 21.813 |
| 24839.19732 | 21.816 |
| 24847.15637 | 21.818 |
| 24857.76801 | 21.817 |
| 24868.37916 | 21.816 |
| 24876.33721 | 21.82 |
| 24886.94751 | 21.825 |
| 24894.90493 | 21.828 |
| 24905.51438 | 21.833 |
| 24913.47116 | 21.838 |
| 24924.07976 | 21.845 |
| 24932.0359 | 21.852 |
| 24942.64366 | 21.861 |
| 24953.25093 | 21.871 |
| 24961.20606 | 21.881 |
| 24971.81248 | 21.89 |
| 24979.76697 | 21.896 |
| 24990.37254 | 21.904 |
| 24998.32639 | 21.913 |
| 25008.93111 | 21.921 |
| 25016.88432 | 21.932 |
| 25027.48818 | 21.942 |
| 25038.09156 | 21.956 |
| 25046.04377 | 21.968 |
| 25056.64628 | 21.982 |
| 25064.59785 | 22 |
| 25075.19952 | 22.016 |
| 25083.15044 | 22.032 |
| 25093.75125 | 22.048 |
| 25101.70153 | 22.065 |
| 25112.30149 | 22.083 |
| 25122.90095 | 22.097 |
| 25130.85022 | 22.109 |
| 25141.44883 | 22.12 |
| 25149.39746 | 22.132 |
| 25159.99521 | 22.147 |
| 25167.94319 | 22.162 |
| 25178.54008 | 22.181 |
| 25186.48743 | 22.199 |
| 25197.08345 | 22.217 |
| 25207.67899 | 22.235 |
| 25215.62532 | 22.25 |
| 25226.22 | 22.262 |
| 25234.16569 | 22.277 |
| 25244.7595 | 22.297 |
| 25252.70454 | 22.318 |
| 25263.2975 | 22.335 |
| 25271.24189 | 22.352 |
| 25281.83398 | 22.37 |
| 25292.42559 | 22.387 |
| 25300.36896 | 22.404 |
| 25310.9597 | 22.418 |
| 25318.90243 | 22.43 |
| 25329.4923 | 22.439 |
| 25337.43438 | 22.447 |
| 25348.02339 | 22.452 |
| 25358.61191 | 22.458 |
| 25366.55297 | 22.466 |
| 25377.14062 | 22.473 |
| 25385.08103 | 22.481 |
| 25395.66782 | 22.489 |
| 25403.60758 | 22.494 |
| 25414.1935 | 22.501 |
| 25422.13261 | 22.503 |
| 25432.71766 | 22.507 |
| 25443.30222 | 22.514 |
| 25451.24031 | 22.519 |
| 25461.82399 | 22.524 |
| 25469.76143 | 22.529 |
| 25480.34425 | 22.534 |
| 25488.28104 | 22.539 |
| 25498.86298 | 22.543 |
| 25509.44443 | 22.548 |
| 25517.3802 | 22.555 |
| 25527.96078 | 22.561 |
| 25535.89588 | 22.567 |
| 25546.47559 | 22.567 |
| 25554.41005 | 22.567 |
| 25564.98889 | 22.562 |
| 25572.92269 | 22.559 |
| 25583.50065 | 22.556 |
| 25594.07812 | 22.555 |
| 25602.01089 | 22.554 |
| 25612.58749 | 22.554 |
| 25620.5196 | 22.551 |
| 25631.09532 | 22.546 |
| 25639.02678 | 22.537 |
| 25649.60163 | 22.528 |
| 25660.17597 | 22.519 |
| 25668.1064 | 22.507 |
| 25678.67987 | 22.495 |
| 25686.60965 | 22.485 |
| 25697.18224 | 22.477 |
| 25705.11135 | 22.468 |
| 25715.68307 | 22.46 |
| 25726.25428 | 22.454 |
| 25734.18237 | 22.449 |
| 25744.7527 | 22.443 |
| 25752.68013 | 22.436 |
| 25763.24958 | 22.432 |
| 25771.17635 | 22.427 |
| 25781.74493 | 22.422 |
| 25789.67103 | 22.42 |
| 25800.23873 | 22.416 |
| 25810.80593 | 22.411 |
| 25818.731 | 22.407 |
| 25829.29731 | 22.398 |
| 25837.22172 | 22.388 |
| 25847.78715 | 22.376 |
| 25855.7109 | 22.362 |
| 25866.27545 | 22.349 |
| 25876.8395 | 22.335 |
| 25884.7622 | 22.323 |
| 25895.32537 | 22.308 |
| 25903.24741 | 22.293 |
| 25913.80969 | 22.278 |
| 25921.73107 | 22.262 |
| 25932.29247 | 22.251 |
| 25942.85336 | 22.237 |
| 25950.7737 | 22.225 |
| 25961.3337 | 22.211 |
| 25969.25338 | 22.199 |
| 25979.8125 | 22.185 |
| 25987.7315 | 22.17 |
| 25998.28974 | 22.157 |
| 26008.84747 | 22.145 |
| 26016.76543 | 22.133 |
| 26027.32227 | 22.123 |
| 26035.23957 | 22.115 |
| 26045.79552 | 22.107 |
| 26053.71215 | 22.102 |
| 26064.26721 | 22.095 |
| 26074.82177 | 22.087 |
| 26082.73735 | 22.076 |
| 26093.29101 | 22.063 |
| 26101.20593 | 22.049 |
| 26111.7587 | 22.033 |
| 26119.67295 | 22.018 |
| 26130.22483 | 22.005 |
| 26140.77621 | 21.992 |
| 26148.6894 | 21.969 |
| 26159.23989 | 21.946 |
| 26167.15241 | 21.921 |
| 26177.702 | 21.895 |
| 26185.61386 | 21.866 |
| 26196.16256 | 21.843 |
| 26206.71074 | 21.818 |
| 26214.62155 | 21.795 |
| 26225.16884 | 21.773 |
| 26233.07897 | 21.752 |
| 26243.62537 | 21.735 |
| 26251.53483 | 21.718 |
| 26262.08033 | 21.703 |
| 26272.62532 | 21.686 |
| 26280.53373 | 21.669 |
| 26291.07782 | 21.655 |
| 26298.98555 | 21.641 |
| 26309.52875 | 21.63 |
| 26320.07143 | 21.612 |
| 26327.9781 | 21.599 |
| 26338.51989 | 21.587 |
| 26346.42589 | 21.574 |
| 26356.96678 | 21.562 |
| 26364.8721 | 21.552 |
| 26375.41209 | 21.543 |
| 26385.95156 | 21.536 |
| 26393.85583 | 21.527 |
| 26404.3944 | 21.52 |
| 26412.29799 | 21.509 |
| 26422.83566 | 21.497 |
| 26430.73858 | 21.485 |
| 26441.27535 | 21.475 |
| 26451.8116 | 21.466 |
| 26459.71345 | 21.456 |
| 26470.2488 | 21.453 |
| 26478.14998 | 21.453 |
| 26488.68443 | 21.459 |
| 26496.58492 | 21.466 |
| 26507.11847 | 21.475 |
| 26517.6515 | 21.48 |
| 26525.55093 | 21.486 |
| 26536.08305 | 21.5 |
| 26543.9818 | 21.516 |
| 26554.51302 | 21.536 |
| 26565.04372 | 21.558 |
| 26572.9414 | 21.583 |
| 26583.4712 | 21.606 |
| 26591.3682 | 21.63 |
| 26601.89709 | 21.653 |
| 26609.79341 | 21.675 |
| 26620.32139 | 21.699 |
| 26630.84885 | 21.718 |
| 26638.7441 | 21.735 |
| 26649.27065 | 21.75 |
| 26657.16522 | 21.764 |
| 26667.69086 | 21.78 |
| 26678.21599 | 21.795 |
| 26686.10949 | 21.81 |
| 26696.6337 | 21.821 |
| 26704.52651 | 21.836 |
| 26715.04981 | 21.85 |
| 26722.94195 | 21.862 |
| 26733.46433 | 21.876 |
| 26743.9862 | 21.887 |
| 26751.87726 | 21.899 |
| 26762.39821 | 21.908 |
| 26770.28859 | 21.914 |
| 26780.80863 | 21.919 |
| 26791.32815 | 21.923 |
| 26799.21745 | 21.931 |
| 26809.73605 | 21.941 |
| 26817.62466 | 21.949 |
| 26828.14235 | 21.956 |
| 26836.03028 | 21.961 |
| 26846.54705 | 21.972 |
| 26857.0633 | 21.976 |
| 26864.95015 | 21.977 |
| 26875.46548 | 21.973 |
| 26883.35164 | 21.968 |
| 26893.86606 | 21.958 |
| 26904.37995 | 21.949 |
| 26912.26503 | 21.94 |
| 26922.778 | 21.931 |
| 26930.66239 | 21.92 |
| 26941.17445 | 21.905 |
| 26949.05815 | 21.887 |
| 26959.56928 | 21.87 |
| 26970.0799 | 21.848 |
| 26977.96251 | 21.825 |
| 26988.4722 | 21.804 |
| 26996.35413 | 21.781 |
| 27006.8629 | 21.759 |
| 27017.37114 | 21.741 |
| 27025.25198 | 21.723 |
| 27035.7593 | 21.706 |
| 27043.63945 | 21.688 |
| 27054.14585 | 21.672 |
| 27064.65172 | 21.655 |
| 27072.53078 | 21.641 |
| 27083.03573 | 21.63 |
| 27090.91409 | 21.618 |
| 27101.41812 | 21.609 |
| 27109.29579 | 21.602 |
| 27119.79889 | 21.595 |
| 27130.30146 | 21.59 |
| 27138.17804 | 21.583 |
| 27148.67969 | 21.578 |
| 27156.55558 | 21.575 |
| 27167.0563 | 21.575 |
| 27177.55649 | 21.574 |
| 27185.43128 | 21.572 |
| 27195.93054 | 21.569 |
| 27203.80464 | 21.565 |
| 27214.30298 | 21.565 |
| 27224.80078 | 21.564 |
| 27232.67378 | 21.558 |
| 27243.17066 | 21.554 |
| 27251.04297 | 21.553 |
| 27261.53891 | 21.554 |
| 27272.03433 | 21.557 |
| 27279.90554 | 21.564 |
| 27290.40002 | 21.574 |
| 27298.27053 | 21.582 |
| 27308.76409 | 21.59 |
| 27316.6339 | 21.598 |
| 27327.12652 | 21.61 |
| 27337.61861 | 21.624 |
| 27345.48732 | 21.635 |
| 27355.97848 | 21.649 |
| 27363.84649 | 21.663 |
| 27374.33672 | 21.679 |
| 27384.8264 | 21.697 |
| 27392.69332 | 21.715 |
| 27403.18207 | 21.73 |
| 27411.04829 | 21.746 |
| 27421.5361 | 21.763 |
| 27432.02339 | 21.78 |
| 27439.8885 | 21.798 |
| 27450.37485 | 21.817 |
| 27458.23926 | 21.835 |
| 27468.72467 | 21.85 |
| 27479.20954 | 21.865 |
| 27487.07285 | 21.879 |
| 27497.55678 | 21.892 |
| 27505.41939 | 21.902 |
| 27515.90238 | 21.91 |
| 27526.38485 | 21.918 |
| 27534.24634 | 21.924 |
| 27544.72787 | 21.929 |
| 27552.58866 | 21.932 |
| 27563.06924 | 21.939 |
| 27573.54929 | 21.946 |
| 27581.40897 | 21.951 |
| 27591.88807 | 21.957 |
| 27599.74705 | 21.959 |
| 27610.22521 | 21.963 |
| 27620.70284 | 21.969 |
| 27628.56071 | 21.978 |
| 27639.03739 | 21.984 |
| 27646.89455 | 21.99 |
| 27657.37029 | 21.992 |
| 27667.84549 | 21.989 |
| 27675.70154 | 21.986 |
| 27686.17579 | 21.987 |
| 27694.03113 | 21.985 |
| 27704.50444 | 21.985 |
| 27714.97722 | 21.982 |
| 27722.83144 | 21.976 |
| 27733.30327 | 21.969 |
| 27741.15678 | 21.964 |
| 27751.62766 | 21.96 |
| 27762.098 | 21.956 |
| 27769.9504 | 21.95 |
| 27780.41979 | 21.945 |
| 27788.27148 | 21.94 |
| 27798.73992 | 21.936 |
| 27809.20783 | 21.935 |
| 27817.0584 | 21.935 |
| 27827.52535 | 21.935 |
| 27835.37521 | 21.934 |
| 27845.84121 | 21.929 |
| 27856.30667 | 21.924 |
| 27864.15541 | 21.917 |
| 27874.61992 | 21.915 |
| 27882.46795 | 21.913 |
| 27892.93151 | 21.915 |
| 27903.39452 | 21.919 |
| 27911.24143 | 21.927 |
| 27921.70349 | 21.939 |
| 27929.54968 | 21.954 |
| 27940.01079 | 21.966 |
| 27950.47135 | 21.975 |
| 27958.31642 | 21.982 |
| 27968.77603 | 21.998 |
| 27976.62038 | 22.009 |
| 27987.07904 | 22.022 |
| 27997.53715 | 22.033 |
| 28005.38038 | 22.044 |
| 28015.83754 | 22.05 |
| 28023.68004 | 22.057 |
| 28034.13625 | 22.061 |
| 28044.5919 | 22.072 |
| 28052.43328 | 22.09 |
| 28062.88798 | 22.108 |
| 28070.72864 | 22.115 |
| 28081.18238 | 22.124 |
| 28091.63557 | 22.131 |
| 28099.47511 | 22.14 |
| 28109.92734 | 22.158 |
| 28120.37903 | 22.184 |
| 28128.21743 | 22.208 |
| 28138.66816 | 22.23 |
| 28146.50584 | 22.249 |
| 28156.95561 | 22.268 |
| 28167.40483 | 22.288 |
| 28175.24138 | 22.31 |
| 28185.68963 | 22.336 |
| 28193.52546 | 22.355 |
| 28203.97276 | 22.372 |
| 28214.4195 | 22.386 |
| 28222.2542 | 22.399 |
| 28232.69998 | 22.419 |
| 28240.53396 | 22.444 |
| 28250.97877 | 22.471 |
| 28261.42304 | 22.488 |
| 28269.25588 | 22.508 |
| 28279.69918 | 22.522 |
| 28287.5313 | 22.533 |
| 28297.97364 | 22.544 |
| 28308.41542 | 22.55 |
| 28316.2464 | 22.553 |
| 28326.68722 | 22.56 |
| 28337.12749 | 22.573 |
| 28344.95733 | 22.588 |
| 28355.39663 | 22.592 |
| 28363.22574 | 22.605 |
| 28373.66408 | 22.623 |
| 28384.10186 | 22.637 |
| 28391.92983 | 22.653 |
| 28402.36664 | 22.672 |
| 28410.19389 | 22.692 |
| 28420.62973 | 22.716 |
| 28431.06502 | 22.732 |
| 28438.89112 | 22.745 |
| 28449.32544 | 22.758 |
| 28457.15082 | 22.783 |
| 28467.58416 | 22.81 |
| 28478.01696 | 22.835 |
| 28485.84119 | 22.861 |
| 28496.27301 | 22.88 |
| 28506.70427 | 22.889 |
| 28514.52736 | 22.9 |
| 28524.95765 | 22.909 |
| 28532.78001 | 22.922 |
| 28543.20933 | 22.935 |
| 28553.63809 | 22.946 |
| 28561.4593 | 22.957 |
| 28571.88709 | 22.961 |
| 28579.70756 | 22.969 |
| 28590.13438 | 22.977 |
| 28600.56063 | 22.983 |
| 28608.37996 | 22.99 |
| 28618.80524 | 22.994 |
| 28629.22996 | 22.994 |
| 28637.04814 | 22.99 |
| 28647.47188 | 22.991 |
| 28655.28933 | 22.992 |
| 28665.7121 | 22.993 |
| 28676.13431 | 22.996 |
| 28683.9506 | 22.995 |
| 28694.37183 | 22.995 |
| 28704.7925 | 23.002 |
| 28712.60764 | 23.006 |
| 28723.02733 | 22.999 |
| 28730.84173 | 22.99 |
| 28741.26044 | 22.983 |
| 28751.67859 | 22.97 |
| 28759.49184 | 22.952 |
| 28769.90901 | 22.936 |
| 28777.72152 | 22.919 |
| 28788.13771 | 22.904 |
| 28798.55334 | 22.885 |
| 28806.36469 | 22.865 |
| 28816.77933 | 22.849 |
| 28827.19342 | 22.83 |
| 28835.00361 | 22.813 |
| 28845.41671 | 22.789 |
| 28853.22617 | 22.761 |
| 28863.63828 | 22.734 |
| 28874.04984 | 22.701 |
| 28881.85813 | 22.668 |
| 28892.2687 | 22.639 |
| 28902.6787 | 22.611 |
| 28910.48584 | 22.588 |
| 28920.89485 | 22.561 |
| 28928.70125 | 22.532 |
| 28939.10928 | 22.503 |
| 28949.51675 | 22.468 |
| 28957.32198 | 22.435 |
| 28967.72845 | 22.402 |
| 28978.13437 | 22.368 |
| 28985.93843 | 22.339 |
| 28996.34336 | 22.307 |
| 29004.14668 | 22.278 |
| 29014.55062 | 22.249 |
| 29024.95399 | 22.221 |
| 29032.75615 | 22.194 |
| 29043.15853 | 22.166 |
| 29053.56034 | 22.139 |
| 29061.36133 | 22.109 |
| 29071.76215 | 22.081 |
| 29079.5624 | 22.05 |
| 29089.96223 | 22.015 |
| 29100.36149 | 21.977 |
| 29108.16057 | 21.945 |
| 29118.55884 | 21.918 |
| 29128.95654 | 21.895 |
| 29136.75445 | 21.876 |
| 29147.15115 | 21.856 |
| 29154.94831 | 21.839 |
| 29165.34403 | 21.818 |
| 29175.73917 | 21.794 |
| 29183.53516 | 21.77 |
| 29193.92931 | 21.748 |
| 29204.32289 | 21.726 |
| 29212.1177 | 21.707 |
| 29222.51029 | 21.688 |
| 29230.30435 | 21.672 |
| 29240.69594 | 21.66 |
| 29251.08696 | 21.647 |
| 29258.87985 | 21.639 |
| 29269.26987 | 21.633 |
| 29279.65932 | 21.628 |
| 29287.45103 | 21.623 |
| 29297.83948 | 21.613 |
| 29305.63044 | 21.608 |
| 29316.01789 | 21.605 |
| 29326.40477 | 21.605 |
| 29334.19455 | 21.609 |
| 29344.58043 | 21.615 |
| 29354.96574 | 21.622 |
| 29362.75434 | 21.63 |
| 29373.13864 | 21.635 |
| 29380.9265 | 21.641 |
| 29391.3098 | 21.643 |
| 29401.69253 | 21.645 |
| 29409.4792 | 21.648 |
| 29419.86092 | 21.655 |
| 29430.24207 | 21.66 |
| 29438.02756 | 21.664 |
| 29448.40771 | 21.671 |
| 29458.78728 | 21.678 |
| 29466.57159 | 21.688 |
| 29476.95016 | 21.699 |
| 29484.7337 | 21.715 |
| 29495.11127 | 21.735 |
| 29505.48826 | 21.746 |
| 29513.27062 | 21.756 |
| 29523.6466 | 21.761 |
| 29534.022 | 21.769 |
| 29541.80318 | 21.774 |
| 29552.17758 | 21.787 |
| 29562.5514 | 21.803 |
| 29570.33139 | 21.822 |
| 29580.7042 | 21.842 |
| 29588.48343 | 21.862 |
| 29598.85524 | 21.881 |
| 29609.22646 | 21.895 |
| 29617.0045 | 21.911 |
| 29627.37472 | 21.926 |
| 29637.74436 | 21.944 |
| 29645.52121 | 21.961 |
| 29655.88983 | 21.976 |
| 29663.66593 | 21.988 |
| 29674.03354 | 22.003 |
| 29684.40058 | 22.018 |
| 29692.17548 | 22.028 |
| 29702.5415 | 22.037 |
| 29712.90694 | 22.048 |
| 29720.68065 | 22.058 |
| 29731.04508 | 22.068 |
| 29741.40893 | 22.078 |
| 29749.18144 | 22.09 |
| 29759.54427 | 22.104 |
| 29769.90653 | 22.118 |
| 29777.67784 | 22.135 |
| 29788.03908 | 22.154 |
| 29795.80963 | 22.168 |
| 29806.16986 | 22.176 |
| 29816.5295 | 22.188 |
| 29824.29885 | 22.203 |
| 29834.65748 | 22.218 |
| 29845.01552 | 22.242 |
| 29852.78367 | 22.263 |
| 29863.1407 | 22.286 |
| 29873.49714 | 22.307 |
| 29881.26409 | 22.325 |
| 29891.61951 | 22.348 |
| 29899.3857 | 22.371 |
| 29909.7401 | 22.398 |
| 29920.09393 | 22.426 |
| 29927.85891 | 22.454 |
| 29938.21171 | 22.477 |
| 29948.56392 | 22.498 |
| 29956.3277 | 22.511 |
| 29966.6789 | 22.517 |
| 29977.02951 | 22.523 |
| 29984.79208 | 22.522 |
| 29995.14167 | 22.525 |
| 30005.49067 | 22.528 |
| 30013.25204 | 22.528 |
| 30023.60002 | 22.525 |
| 30031.36062 | 22.518 |
| 30041.70758 | 22.515 |
| 30052.05394 | 22.512 |
| 30059.81334 | 22.502 |
| 30070.15868 | 22.489 |
| 30080.50344 | 22.482 |
| 30088.26162 | 22.475 |
| 30098.60535 | 22.464 |
| 30108.94849 | 22.458 |
| 30116.70547 | 22.453 |
| 30127.04758 | 22.443 |
| 30137.38911 | 22.431 |
| 30145.14487 | 22.419 |
| 30155.48537 | 22.408 |
| 30163.24036 | 22.398 |
| 30173.57984 | 22.388 |
| 30183.91872 | 22.385 |
| 30191.6725 | 22.385 |
| 30202.01035 | 22.382 |
| 30212.34762 | 22.378 |
| 30220.10018 | 22.379 |
| 30230.43641 | 22.368 |
| 30240.77206 | 22.364 |
| 30248.5234 | 22.359 |
| 30258.85802 | 22.353 |
| 30269.19204 | 22.347 |
| 30276.94217 | 22.34 |
| 30287.27516 | 22.333 |
| 30297.60756 | 22.323 |
| 30305.35647 | 22.311 |
| 30315.68784 | 22.304 |
| 30326.01861 | 22.296 |
| 30333.76631 | 22.288 |
| 30344.09605 | 22.289 |
| 30351.84296 | 22.302 |
| 30362.17167 | 22.309 |
| 30372.49978 | 22.331 |
| 30380.24548 | 22.357 |
| 30390.57255 | 22.38 |
| 30400.89904 | 22.397 |
| 30408.64351 | 22.419 |
| 30418.96896 | 22.441 |
| 30429.29381 | 22.464 |
| 30437.03706 | 22.479 |
| 30447.36088 | 22.498 |
| 30457.6841 | 22.531 |
| 30465.42612 | 22.561 |
| 30475.74831 | 22.593 |
| 30486.0699 | 22.624 |
| 30493.8107 | 22.644 |
| 30504.13124 | 22.654 |
| 30514.4512 | 22.664 |
| 30522.19077 | 22.665 |
| 30532.50968 | 22.658 |
| 30542.828 | 22.647 |
| 30550.56635 | 22.637 |
| 30560.88362 | 22.623 |
| 30568.62119 | 22.604 |
| 30578.93742 | 22.581 |
| 30589.25306 | 22.561 |
| 30596.98939 | 22.54 |
| 30607.30398 | 22.505 |
| 30617.61798 | 22.475 |
| 30625.35308 | 22.435 |
| 30635.66603 | 22.4 |
| 30645.97839 | 22.363 |
| 30653.71226 | 22.322 |
| 30664.02357 | 22.28 |
| 30674.33428 | 22.23 |
| 30682.06692 | 22.181 |
| 30692.37658 | 22.13 |
| 30702.68565 | 22.074 |
| 30710.41705 | 22.014 |
| 30720.72507 | 21.96 |
| 30731.03249 | 21.905 |
| 30738.76266 | 21.842 |
| 30749.06903 | 21.787 |
| 30759.3748 | 21.725 |
| 30767.10373 | 21.649 |
| 30777.40845 | 21.575 |
| 30787.71257 | 21.513 |
| 30795.44027 | 21.45 |
| 30805.74334 | 21.397 |
| 30816.04581 | 21.346 |
| 30823.77227 | 21.305 |
| 30834.07369 | 21.262 |
| 30844.3745 | 21.205 |
| 30852.09972 | 21.144 |
| 30862.39949 | 21.085 |
| 30872.69865 | 21.022 |
| 30880.42263 | 20.971 |
| 30890.72074 | 20.936 |
| 30901.01824 | 20.907 |
| 30908.74098 | 20.896 |
| 30919.03743 | 20.899 |
| 30926.75937 | 20.91 |
| 30937.05477 | 20.917 |
| 30947.34957 | 20.93 |
| 30955.07027 | 20.948 |
| 30965.36401 | 20.967 |
| 30975.65714 | 20.979 |
| 30983.3766 | 20.996 |
| 30993.66867 | 21.026 |
| 31003.96015 | 21.06 |
| 31011.67836 | 21.096 |
| 31021.96877 | 21.12 |
| 31032.25858 | 21.145 |
| 31039.97555 | 21.179 |
| 31050.2643 | 21.215 |
| 31060.55244 | 21.26 |
| 31068.26816 | 21.309 |
| 31078.55524 | 21.355 |
| 31088.84173 | 21.403 |
| 31096.55619 | 21.448 |
| 31106.84161 | 21.487 |
| 31117.12642 | 21.521 |
| 31124.83964 | 21.556 |
| 31135.12339 | 21.588 |
| 31145.40653 | 21.619 |
| 31153.11849 | 21.655 |
| 31163.40058 | 21.694 |
| 31173.68205 | 21.726 |
| 31181.39276 | 21.755 |
| 31191.67317 | 21.776 |
| 31201.95297 | 21.794 |
| 31209.66243 | 21.811 |
| 31219.94117 | 21.832 |
| 31230.21929 | 21.856 |
| 31237.92749 | 21.881 |
| 31248.20456 | 21.903 |
| 31258.48101 | 21.933 |
| 31266.18795 | 21.95 |
| 31276.46334 | 21.963 |
| 31286.73812 | 21.968 |
| 31294.4438 | 21.966 |
| 31304.71752 | 21.954 |
| 31314.99062 | 21.939 |
| 31322.69504 | 21.921 |
| 31332.96707 | 21.897 |
| 31343.2385 | 21.873 |
| 31350.94166 | 21.846 |
| 31361.21201 | 21.824 |
| 31371.48175 | 21.8 |
| 31379.18366 | 21.764 |
| 31389.45233 | 21.717 |
| 31399.72039 | 21.675 |
| 31409.98783 | 21.641 |
| 31417.68802 | 21.608 |
| 31427.95439 | 21.57 |
| 31438.22015 | 21.535 |
| 31445.91907 | 21.499 |
| 31456.18376 | 21.464 |
| 31466.44783 | 21.433 |
| 31474.14549 | 21.406 |
| 31484.40849 | 21.392 |
| 31494.67088 | 21.382 |
| 31502.36727 | 21.373 |
| 31512.62858 | 21.363 |
| 31522.88928 | 21.353 |
| 31530.5844 | 21.343 |
| 31540.84403 | 21.337 |
| 31551.10303 | 21.331 |
| 31558.79689 | 21.322 |
| 31569.05482 | 21.309 |
| 31579.31214 | 21.295 |
| 31587.00472 | 21.282 |
| 31597.26096 | 21.266 |
| 31607.51658 | 21.247 |
| 31615.20789 | 21.233 |
| 31625.46244 | 21.22 |
| 31635.71637 | 21.207 |
| 31643.40641 | 21.193 |
| 31653.65926 | 21.192 |
| 31663.91149 | 21.189 |
| 31671.60026 | 21.197 |
| 31681.85141 | 21.2 |
| 31692.10194 | 21.202 |
| 31699.78944 | 21.198 |
| 31710.03889 | 21.197 |
| 31720.28772 | 21.2 |
| 31727.97394 | 21.2 |
| 31738.22169 | 21.207 |
| 31748.46883 | 21.212 |
| 31758.71534 | 21.211 |
| 31766.39982 | 21.216 |
| 31776.64525 | 21.23 |
| 31786.89006 | 21.235 |
| 31794.57326 | 21.24 |
| 31804.81699 | 21.245 |
| 31815.06009 | 21.245 |
| 31822.74202 | 21.24 |
| 31832.98404 | 21.231 |
| 31843.22544 | 21.213 |
| 31850.90608 | 21.203 |
| 31861.14639 | 21.19 |
| 31871.38608 | 21.169 |
| 31879.06545 | 21.144 |
| 31889.30405 | 21.114 |
| 31899.54203 | 21.086 |
| 31907.22011 | 21.058 |
| 31917.45701 | 21.027 |
| 31927.69328 | 20.999 |
| 31935.37008 | 20.968 |
| 31945.60526 | 20.942 |
| 31955.83982 | 20.928 |
| 31966.07376 | 20.919 |
| 31973.7488 | 20.908 |
| 31983.98165 | 20.897 |
| 31994.21387 | 20.891 |
| 32001.88763 | 20.881 |
| 32012.11876 | 20.872 |
| 32022.34927 | 20.861 |
| 32030.02174 | 20.853 |
| 32040.25115 | 20.834 |
| 32050.47994 | 20.811 |
| 32058.15112 | 20.782 |
| 32068.37882 | 20.758 |
| 32078.60589 | 20.743 |
| 32086.27578 | 20.733 |
| 32096.50176 | 20.728 |
| 32106.72711 | 20.723 |
| 32116.95183 | 20.719 |
| 32124.61997 | 20.708 |
| 32134.8436 | 20.699 |
| 32145.0666 | 20.699 |
| 32152.73344 | 20.702 |
| 32162.95534 | 20.705 |
| 32173.17662 | 20.711 |
| 32180.84217 | 20.718 |
| 32191.06235 | 20.725 |
| 32201.2819 | 20.74 |
| 32208.94616 | 20.754 |
| 32219.16461 | 20.769 |
| 32229.38244 | 20.796 |
| 32237.0454 | 20.806 |
| 32247.26212 | 20.813 |
| 32257.47822 | 20.815 |
| 32267.69369 | 20.826 |
| 32275.35488 | 20.849 |
| 32285.56925 | 20.876 |
| 32295.78298 | 20.896 |
| 32303.44288 | 20.921 |
| 32313.65551 | 20.938 |
| 32323.86752 | 20.954 |
| 32331.52611 | 20.972 |
| 32341.73701 | 20.98 |
| 32351.94729 | 20.985 |
| 32359.60458 | 20.985 |
| 32369.81375 | 20.987 |
| 32380.02229 | 20.986 |
| 32390.23019 | 20.987 |
| 32397.88571 | 20.986 |
| 32408.09251 | 20.989 |
| 32418.29868 | 20.985 |
| 32425.95289 | 20.985 |
| 32436.15796 | 20.989 |
| 32446.36239 | 20.986 |
| 32454.0153 | 20.978 |
| 32464.21862 | 20.959 |
| 32474.42131 | 20.941 |
| 32482.07292 | 20.914 |
| 32492.2745 | 20.884 |
| 32502.47545 | 20.857 |
| 32512.67577 | 20.83 |
| 32520.32559 | 20.803 |
| 32530.52479 | 20.767 |
| 32540.72337 | 20.725 |
| 32548.37188 | 20.682 |
| 32558.56934 | 20.638 |
| 32568.76617 | 20.597 |
| 32576.41337 | 20.55 |
| 32586.60909 | 20.5 |
| 32596.80417 | 20.45 |
| 32606.99862 | 20.405 |
| 32614.64403 | 20.354 |
| 32624.83737 | 20.319 |
| 32635.03006 | 20.282 |
| 32642.67417 | 20.251 |
| 32652.86575 | 20.212 |
| 32663.0567 | 20.155 |
| 32670.69949 | 20.089 |
| 32680.88932 | 20.045 |
| 32691.07852 | 20.005 |
| 32701.26708 | 19.96 |
| 32708.90808 | 19.925 |
| 32719.09552 | 19.887 |
| 32729.28232 | 19.859 |
| 32736.92201 | 19.838 |
| 32747.10769 | 19.833 |
| 32757.29274 | 19.818 |
| 32764.93111 | 19.799 |
| 32775.11504 | 19.786 |
| 32785.29833 | 19.765 |
| 32795.48099 | 19.742 |
| 32803.11756 | 19.73 |
| 32813.29909 | 19.732 |
| 32823.47999 | 19.743 |
| 32831.11524 | 19.761 |
| 32841.29501 | 19.798 |
| 32851.47415 | 19.837 |
| 32859.10808 | 19.866 |
| 32869.28609 | 19.91 |
| 32879.46346 | 19.949 |
| 32889.64019 | 19.991 |
| 32897.27232 | 20.033 |
| 32907.44793 | 20.078 |
| 32917.6229 | 20.129 |
| 32925.2537 | 20.183 |
| 32935.42755 | 20.232 |
| 32945.60075 | 20.288 |
| 32955.77331 | 20.331 |
| 32963.40231 | 20.388 |
| 32973.57374 | 20.446 |
| 32983.74454 | 20.511 |
| 32991.37221 | 20.57 |
| 33001.54188 | 20.625 |
| 33011.7109 | 20.671 |
| 33019.33725 | 20.725 |
| 33029.50514 | 20.781 |
| 33039.6724 | 20.841 |
| 33049.83901 | 20.921 |
| 33057.46354 | 21.009 |
| 33067.62902 | 21.069 |
| 33077.79386 | 21.12 |
| 33085.41707 | 21.192 |
| 33095.58077 | 21.249 |
| 33105.74384 | 21.302 |
| 33115.90626 | 21.346 |
| 33123.52764 | 21.372 |
| 33133.68893 | 21.379 |
| 33143.84957 | 21.402 |
| 33151.46963 | 21.438 |
| 33161.62914 | 21.458 |
| 33171.78801 | 21.495 |
| 33181.94623 | 21.534 |
| 33189.56446 | 21.559 |
| 33199.72155 | 21.559 |
| 33209.87799 | 21.537 |
| 33217.49489 | 21.522 |
| 33227.6502 | 21.48 |
| 33237.80486 | 21.449 |
| 33247.95886 | 21.431 |
| 33255.57395 | 21.403 |
| 33265.72682 | 21.385 |
| 33275.87905 | 21.356 |
| 33283.49279 | 21.337 |
| 33293.64388 | 21.312 |
| 33303.79432 | 21.287 |
| 33313.94412 | 21.263 |
| 33321.55604 | 21.251 |
| 33331.70469 | 21.237 |
| 33343.99572 | 21.233 |
| 33351.66103 | 21.22 |
| 33359.3263 | 21.208 |
| 33366.99152 | 21.192 |
| 33382.32186 | 21.178 |
| 33389.98696 | 21.169 |
| 33397.65202 | 21.165 |
| 33405.31705 | 21.158 |
| 33412.98203 | 21.149 |
| 33428.31187 | 21.139 |
| 33435.97673 | 21.119 |
| 33443.64155 | 21.097 |
| 33451.30633 | 21.085 |
| 33466.63576 | 21.08 |
| 33474.30042 | 21.061 |
| 33481.96504 | 21.05 |
| 33489.62961 | 21.041 |
| 33504.95864 | 21.036 |
| 33512.62309 | 21.042 |
| 33520.2875 | 21.054 |
| 33527.95187 | 21.058 |
| 33535.6162 | 21.055 |
| 33550.94474 | 21.06 |
| 33558.60895 | 21.057 |
| 33566.27311 | 21.054 |
| 33573.93724 | 21.056 |
| 33589.26537 | 21.068 |
| 33596.92937 | 21.091 |
| 33604.59333 | 21.111 |
| 33612.25725 | 21.143 |
| 33627.58497 | 21.17 |
| 33635.24877 | 21.192 |
| 33642.91253 | 21.215 |
| 33650.57624 | 21.236 |
| 33658.23992 | 21.26 |
| 33673.56714 | 21.278 |
| 33681.23069 | 21.3 |
| 33688.89421 | 21.325 |
| 33696.55768 | 21.348 |
| 33711.88449 | 21.366 |
| 33719.54784 | 21.381 |
| 33727.21114 | 21.396 |
| 33734.87441 | 21.411 |
| 33742.53763 | 21.427 |
| 33757.86395 | 21.441 |
| 33765.52705 | 21.456 |
| 33773.19011 | 21.473 |
| 33780.85313 | 21.487 |
| 33796.17904 | 21.499 |
| 33803.84194 | 21.512 |
| 33811.50479 | 21.524 |
| 33819.1676 | 21.536 |
| 33834.4931 | 21.549 |
| 33842.15579 | 21.566 |
| 33849.81844 | 21.582 |
| 33857.48104 | 21.599 |
| 33865.14361 | 21.612 |
| 33880.46861 | 21.629 |
| 33888.13105 | 21.647 |
| 33895.79345 | 21.661 |
| 33903.45581 | 21.677 |
| 33918.7804 | 21.693 |
| 33926.44263 | 21.711 |
| 33934.10483 | 21.731 |
| 33941.76698 | 21.752 |
| 33957.09116 | 21.77 |
| 33964.75318 | 21.789 |
| 33972.41517 | 21.808 |
| 33980.07711 | 21.829 |
| 33987.73902 | 21.848 |
| 34003.0627 | 21.864 |
| 34010.72448 | 21.878 |
| 34018.38621 | 21.89 |
| 34026.04791 | 21.9 |
| 34041.37118 | 21.908 |
| 34049.03275 | 21.918 |
| 34056.69428 | 21.928 |
| 34064.35577 | 21.934 |
| 34079.67862 | 21.938 |
| 34087.33998 | 21.941 |
| 34095.0013 | 21.943 |
| 34102.66259 | 21.945 |
| 34110.32382 | 21.95 |
| 34125.64618 | 21.953 |
| 34133.30729 | 21.954 |
| 34140.96837 | 21.958 |
| 34148.6294 | 21.957 |
| 34163.95134 | 21.952 |
| 34171.61224 | 21.946 |
| 34179.27311 | 21.944 |
| 34186.93393 | 21.944 |
| 34202.25545 | 21.943 |
| 34209.91615 | 21.943 |
| 34217.57681 | 21.94 |
| 34225.23742 | 21.932 |
| 34232.89799 | 21.922 |
| 34248.21901 | 21.914 |
| 34255.87946 | 21.91 |
| 34263.53987 | 21.903 |
| 34271.20023 | 21.895 |
| 34286.52084 | 21.893 |
| 34294.18108 | 21.89 |
| 34301.84127 | 21.889 |
| 34309.50143 | 21.889 |
| 34324.82162 | 21.886 |
| 34332.48165 | 21.883 |
| 34340.14163 | 21.88 |
| 34347.80158 | 21.878 |
| 34355.46148 | 21.879 |
| 34370.78117 | 21.88 |
| 34378.44095 | 21.882 |
| 34386.10068 | 21.886 |
| 34393.76038 | 21.889 |
| 34409.07964 | 21.897 |
| 34416.73921 | 21.908 |
| 34424.39874 | 21.923 |
| 34432.05823 | 21.938 |
| 34447.37707 | 21.953 |
| 34455.03643 | 21.97 |
| 34462.69575 | 21.987 |
| 34470.35503 | 22.006 |
| 34478.01426 | 22.024 |
| 34493.3326 | 22.041 |
| 34500.99171 | 22.053 |
| 34508.65077 | 22.067 |
| 34516.3098 | 22.081 |
| 34531.62772 | 22.093 |
| 34539.28662 | 22.109 |
| 34546.94547 | 22.125 |
| 34554.60428 | 22.142 |
| 34569.92178 | 22.154 |
| 34577.58047 | 22.161 |
| 34585.23912 | 22.17 |
| 34592.89772 | 22.179 |
| 34600.55628 | 22.19 |
| 34615.87327 | 22.207 |
| 34623.53171 | 22.223 |
| 34631.1901 | 22.24 |
| 34638.84845 | 22.256 |
| 34654.16502 | 22.271 |
| 34661.82324 | 22.286 |
| 34669.48142 | 22.298 |
| 34677.13956 | 22.309 |
| 34692.45571 | 22.319 |
| 34700.11372 | 22.326 |
| 34707.77169 | 22.332 |
| 34715.42962 | 22.334 |
| 34723.08751 | 22.337 |
| 34738.40315 | 22.342 |
| 34746.06091 | 22.344 |
| 34753.71862 | 22.345 |
| 34761.37629 | 22.344 |
| 34776.69151 | 22.342 |
| 34784.34906 | 22.342 |
| 34792.00656 | 22.334 |
| 34799.66402 | 22.325 |
| 34814.97882 | 22.313 |
| 34822.63615 | 22.31 |
| 34830.29344 | 22.306 |
| 34837.95069 | 22.3 |
| 34845.6079 | 22.294 |
| 34860.92219 | 22.286 |
| 34868.57927 | 22.278 |
| 34876.2363 | 22.271 |
| 34883.8933 | 22.266 |
| 34899.20716 | 22.26 |
| 34906.86403 | 22.254 |
| 34914.52085 | 22.249 |
| 34922.17763 | 22.242 |
| 34937.49107 | 22.238 |
| 34945.14772 | 22.233 |
| 34952.80433 | 22.231 |
| 34960.4609 | 22.232 |
| 34968.11743 | 22.233 |
| 34983.43035 | 22.234 |
| 34991.08675 | 22.231 |
| 34998.74311 | 22.223 |